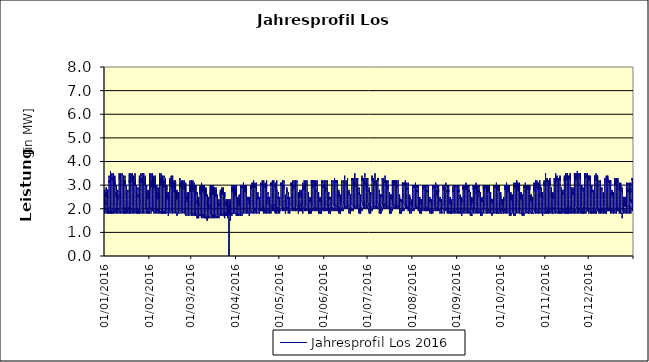
| Category | Jahresprofil Los 2016 |
|---|---|
| 01/01/2016 | 2.1 |
| 01/01/2016 | 2.1 |
| 01/01/2016 | 2 |
| 01/01/2016 | 1.8 |
| 01/01/2016 | 1.8 |
| 01/01/2016 | 1.9 |
| 01/01/2016 | 2 |
| 01/01/2016 | 2.1 |
| 01/01/2016 | 2.1 |
| 01/01/2016 | 2.2 |
| 01/01/2016 | 2.1 |
| 01/01/2016 | 2.4 |
| 01/01/2016 | 2.4 |
| 01/01/2016 | 2.2 |
| 01/01/2016 | 2.3 |
| 01/01/2016 | 2.2 |
| 01/01/2016 | 2.4 |
| 01/01/2016 | 2.8 |
| 01/01/2016 | 2.7 |
| 01/01/2016 | 2.7 |
| 01/01/2016 | 2.6 |
| 01/01/2016 | 2.4 |
| 01/01/2016 | 2.4 |
| 01/01/2016 | 2.3 |
| 02/01/2016 | 2 |
| 02/01/2016 | 1.9 |
| 02/01/2016 | 1.8 |
| 02/01/2016 | 1.8 |
| 02/01/2016 | 1.8 |
| 02/01/2016 | 1.8 |
| 02/01/2016 | 1.9 |
| 02/01/2016 | 2.1 |
| 02/01/2016 | 2.1 |
| 02/01/2016 | 2.4 |
| 02/01/2016 | 2.5 |
| 02/01/2016 | 2.7 |
| 02/01/2016 | 2.5 |
| 02/01/2016 | 2.6 |
| 02/01/2016 | 2.6 |
| 02/01/2016 | 2.5 |
| 02/01/2016 | 2.7 |
| 02/01/2016 | 2.9 |
| 02/01/2016 | 2.9 |
| 02/01/2016 | 2.8 |
| 02/01/2016 | 2.6 |
| 02/01/2016 | 2.4 |
| 02/01/2016 | 2.3 |
| 02/01/2016 | 2.1 |
| 03/01/2016 | 2 |
| 03/01/2016 | 1.9 |
| 03/01/2016 | 1.8 |
| 03/01/2016 | 1.8 |
| 03/01/2016 | 1.8 |
| 03/01/2016 | 1.8 |
| 03/01/2016 | 1.8 |
| 03/01/2016 | 2 |
| 03/01/2016 | 2.1 |
| 03/01/2016 | 2.3 |
| 03/01/2016 | 2.4 |
| 03/01/2016 | 2.5 |
| 03/01/2016 | 2.5 |
| 03/01/2016 | 2.5 |
| 03/01/2016 | 2.4 |
| 03/01/2016 | 2.6 |
| 03/01/2016 | 2.7 |
| 03/01/2016 | 2.8 |
| 03/01/2016 | 2.7 |
| 03/01/2016 | 2.8 |
| 03/01/2016 | 2.5 |
| 03/01/2016 | 2.4 |
| 03/01/2016 | 2.4 |
| 03/01/2016 | 2.1 |
| 04/01/2016 | 2.1 |
| 04/01/2016 | 1.8 |
| 04/01/2016 | 1.8 |
| 04/01/2016 | 1.9 |
| 04/01/2016 | 1.8 |
| 04/01/2016 | 2.1 |
| 04/01/2016 | 2.4 |
| 04/01/2016 | 2.7 |
| 04/01/2016 | 3 |
| 04/01/2016 | 3 |
| 04/01/2016 | 3.1 |
| 04/01/2016 | 3.2 |
| 04/01/2016 | 3.1 |
| 04/01/2016 | 3.2 |
| 04/01/2016 | 3.2 |
| 04/01/2016 | 3.2 |
| 04/01/2016 | 3.4 |
| 04/01/2016 | 3.4 |
| 04/01/2016 | 3.4 |
| 04/01/2016 | 3.3 |
| 04/01/2016 | 3 |
| 04/01/2016 | 2.6 |
| 04/01/2016 | 2.4 |
| 04/01/2016 | 2.2 |
| 05/01/2016 | 2.1 |
| 05/01/2016 | 2 |
| 05/01/2016 | 1.8 |
| 05/01/2016 | 1.8 |
| 05/01/2016 | 1.9 |
| 05/01/2016 | 2.1 |
| 05/01/2016 | 2.4 |
| 05/01/2016 | 2.7 |
| 05/01/2016 | 3 |
| 05/01/2016 | 3 |
| 05/01/2016 | 3.1 |
| 05/01/2016 | 3.1 |
| 05/01/2016 | 3.2 |
| 05/01/2016 | 3.1 |
| 05/01/2016 | 3.1 |
| 05/01/2016 | 3.2 |
| 05/01/2016 | 3.5 |
| 05/01/2016 | 3.6 |
| 05/01/2016 | 3.5 |
| 05/01/2016 | 3.3 |
| 05/01/2016 | 3 |
| 05/01/2016 | 2.7 |
| 05/01/2016 | 2.5 |
| 05/01/2016 | 2.3 |
| 06/01/2016 | 2.1 |
| 06/01/2016 | 1.8 |
| 06/01/2016 | 1.9 |
| 06/01/2016 | 1.8 |
| 06/01/2016 | 1.9 |
| 06/01/2016 | 2.1 |
| 06/01/2016 | 2.5 |
| 06/01/2016 | 2.8 |
| 06/01/2016 | 3 |
| 06/01/2016 | 3.2 |
| 06/01/2016 | 3.2 |
| 06/01/2016 | 3.2 |
| 06/01/2016 | 3.3 |
| 06/01/2016 | 3.2 |
| 06/01/2016 | 3.2 |
| 06/01/2016 | 3.3 |
| 06/01/2016 | 3.5 |
| 06/01/2016 | 3.5 |
| 06/01/2016 | 3.5 |
| 06/01/2016 | 3.3 |
| 06/01/2016 | 3 |
| 06/01/2016 | 2.7 |
| 06/01/2016 | 2.5 |
| 06/01/2016 | 2.3 |
| 07/01/2016 | 2 |
| 07/01/2016 | 1.9 |
| 07/01/2016 | 1.9 |
| 07/01/2016 | 1.8 |
| 07/01/2016 | 1.9 |
| 07/01/2016 | 2.1 |
| 07/01/2016 | 2.5 |
| 07/01/2016 | 2.8 |
| 07/01/2016 | 3 |
| 07/01/2016 | 3 |
| 07/01/2016 | 3.2 |
| 07/01/2016 | 3.2 |
| 07/01/2016 | 3.1 |
| 07/01/2016 | 3.1 |
| 07/01/2016 | 3.1 |
| 07/01/2016 | 3 |
| 07/01/2016 | 3.3 |
| 07/01/2016 | 3.5 |
| 07/01/2016 | 3.3 |
| 07/01/2016 | 3.2 |
| 07/01/2016 | 2.9 |
| 07/01/2016 | 2.7 |
| 07/01/2016 | 2.5 |
| 07/01/2016 | 2.1 |
| 08/01/2016 | 2 |
| 08/01/2016 | 1.9 |
| 08/01/2016 | 1.8 |
| 08/01/2016 | 1.8 |
| 08/01/2016 | 1.9 |
| 08/01/2016 | 2.1 |
| 08/01/2016 | 2.4 |
| 08/01/2016 | 2.7 |
| 08/01/2016 | 3 |
| 08/01/2016 | 3 |
| 08/01/2016 | 3.2 |
| 08/01/2016 | 3.2 |
| 08/01/2016 | 3.2 |
| 08/01/2016 | 3.2 |
| 08/01/2016 | 3 |
| 08/01/2016 | 3.1 |
| 08/01/2016 | 3.2 |
| 08/01/2016 | 3.4 |
| 08/01/2016 | 3.4 |
| 08/01/2016 | 3.2 |
| 08/01/2016 | 2.9 |
| 08/01/2016 | 2.6 |
| 08/01/2016 | 2.4 |
| 08/01/2016 | 2.2 |
| 09/01/2016 | 2.1 |
| 09/01/2016 | 1.8 |
| 09/01/2016 | 1.8 |
| 09/01/2016 | 1.8 |
| 09/01/2016 | 1.8 |
| 09/01/2016 | 1.8 |
| 09/01/2016 | 2 |
| 09/01/2016 | 2.1 |
| 09/01/2016 | 2.3 |
| 09/01/2016 | 2.5 |
| 09/01/2016 | 2.7 |
| 09/01/2016 | 2.6 |
| 09/01/2016 | 2.6 |
| 09/01/2016 | 2.7 |
| 09/01/2016 | 2.5 |
| 09/01/2016 | 2.7 |
| 09/01/2016 | 2.8 |
| 09/01/2016 | 3 |
| 09/01/2016 | 3 |
| 09/01/2016 | 2.8 |
| 09/01/2016 | 2.6 |
| 09/01/2016 | 2.4 |
| 09/01/2016 | 2.3 |
| 09/01/2016 | 2.1 |
| 10/01/2016 | 1.9 |
| 10/01/2016 | 2 |
| 10/01/2016 | 1.8 |
| 10/01/2016 | 1.8 |
| 10/01/2016 | 1.8 |
| 10/01/2016 | 1.8 |
| 10/01/2016 | 1.9 |
| 10/01/2016 | 1.9 |
| 10/01/2016 | 2.1 |
| 10/01/2016 | 2.2 |
| 10/01/2016 | 2.4 |
| 10/01/2016 | 2.6 |
| 10/01/2016 | 2.6 |
| 10/01/2016 | 2.6 |
| 10/01/2016 | 2.4 |
| 10/01/2016 | 2.6 |
| 10/01/2016 | 2.7 |
| 10/01/2016 | 2.8 |
| 10/01/2016 | 2.8 |
| 10/01/2016 | 2.7 |
| 10/01/2016 | 2.6 |
| 10/01/2016 | 2.4 |
| 10/01/2016 | 2.4 |
| 10/01/2016 | 2.1 |
| 11/01/2016 | 2 |
| 11/01/2016 | 2 |
| 11/01/2016 | 1.9 |
| 11/01/2016 | 1.8 |
| 11/01/2016 | 1.9 |
| 11/01/2016 | 2.1 |
| 11/01/2016 | 2.4 |
| 11/01/2016 | 2.9 |
| 11/01/2016 | 3 |
| 11/01/2016 | 3 |
| 11/01/2016 | 3.1 |
| 11/01/2016 | 3.1 |
| 11/01/2016 | 3.2 |
| 11/01/2016 | 3.2 |
| 11/01/2016 | 3.2 |
| 11/01/2016 | 3.2 |
| 11/01/2016 | 3.3 |
| 11/01/2016 | 3.4 |
| 11/01/2016 | 3.5 |
| 11/01/2016 | 3.2 |
| 11/01/2016 | 2.9 |
| 11/01/2016 | 2.7 |
| 11/01/2016 | 2.5 |
| 11/01/2016 | 2.3 |
| 12/01/2016 | 2 |
| 12/01/2016 | 1.9 |
| 12/01/2016 | 1.8 |
| 12/01/2016 | 1.9 |
| 12/01/2016 | 2 |
| 12/01/2016 | 2.1 |
| 12/01/2016 | 2.4 |
| 12/01/2016 | 2.9 |
| 12/01/2016 | 3 |
| 12/01/2016 | 3 |
| 12/01/2016 | 3.2 |
| 12/01/2016 | 3.2 |
| 12/01/2016 | 3.1 |
| 12/01/2016 | 3.2 |
| 12/01/2016 | 3.1 |
| 12/01/2016 | 3.2 |
| 12/01/2016 | 3.3 |
| 12/01/2016 | 3.5 |
| 12/01/2016 | 3.5 |
| 12/01/2016 | 3.4 |
| 12/01/2016 | 3 |
| 12/01/2016 | 2.7 |
| 12/01/2016 | 2.4 |
| 12/01/2016 | 2.1 |
| 13/01/2016 | 2.1 |
| 13/01/2016 | 2 |
| 13/01/2016 | 1.8 |
| 13/01/2016 | 1.9 |
| 13/01/2016 | 2 |
| 13/01/2016 | 2.1 |
| 13/01/2016 | 2.5 |
| 13/01/2016 | 2.8 |
| 13/01/2016 | 3 |
| 13/01/2016 | 3.2 |
| 13/01/2016 | 3.2 |
| 13/01/2016 | 3.2 |
| 13/01/2016 | 3.2 |
| 13/01/2016 | 3.2 |
| 13/01/2016 | 3.2 |
| 13/01/2016 | 3.2 |
| 13/01/2016 | 3.3 |
| 13/01/2016 | 3.5 |
| 13/01/2016 | 3.5 |
| 13/01/2016 | 3.4 |
| 13/01/2016 | 3 |
| 13/01/2016 | 2.7 |
| 13/01/2016 | 2.4 |
| 13/01/2016 | 2.2 |
| 14/01/2016 | 2.1 |
| 14/01/2016 | 2 |
| 14/01/2016 | 1.8 |
| 14/01/2016 | 1.9 |
| 14/01/2016 | 2 |
| 14/01/2016 | 2.1 |
| 14/01/2016 | 2.5 |
| 14/01/2016 | 2.8 |
| 14/01/2016 | 3 |
| 14/01/2016 | 3.1 |
| 14/01/2016 | 3.1 |
| 14/01/2016 | 3.2 |
| 14/01/2016 | 3.2 |
| 14/01/2016 | 3.2 |
| 14/01/2016 | 3.1 |
| 14/01/2016 | 3 |
| 14/01/2016 | 3.2 |
| 14/01/2016 | 3.4 |
| 14/01/2016 | 3.4 |
| 14/01/2016 | 3.3 |
| 14/01/2016 | 3 |
| 14/01/2016 | 2.6 |
| 14/01/2016 | 2.4 |
| 14/01/2016 | 2.2 |
| 15/01/2016 | 2.1 |
| 15/01/2016 | 2 |
| 15/01/2016 | 1.8 |
| 15/01/2016 | 1.9 |
| 15/01/2016 | 1.8 |
| 15/01/2016 | 2.1 |
| 15/01/2016 | 2.4 |
| 15/01/2016 | 2.7 |
| 15/01/2016 | 3 |
| 15/01/2016 | 3.2 |
| 15/01/2016 | 3.2 |
| 15/01/2016 | 3.2 |
| 15/01/2016 | 3.1 |
| 15/01/2016 | 3.2 |
| 15/01/2016 | 3 |
| 15/01/2016 | 3.1 |
| 15/01/2016 | 3.2 |
| 15/01/2016 | 3.4 |
| 15/01/2016 | 3.3 |
| 15/01/2016 | 3.2 |
| 15/01/2016 | 2.8 |
| 15/01/2016 | 2.7 |
| 15/01/2016 | 2.4 |
| 15/01/2016 | 2.1 |
| 16/01/2016 | 2 |
| 16/01/2016 | 1.9 |
| 16/01/2016 | 1.8 |
| 16/01/2016 | 1.8 |
| 16/01/2016 | 1.8 |
| 16/01/2016 | 2 |
| 16/01/2016 | 2.1 |
| 16/01/2016 | 2.2 |
| 16/01/2016 | 2.4 |
| 16/01/2016 | 2.4 |
| 16/01/2016 | 2.6 |
| 16/01/2016 | 2.7 |
| 16/01/2016 | 2.7 |
| 16/01/2016 | 2.6 |
| 16/01/2016 | 2.6 |
| 16/01/2016 | 2.6 |
| 16/01/2016 | 2.7 |
| 16/01/2016 | 2.9 |
| 16/01/2016 | 3 |
| 16/01/2016 | 2.9 |
| 16/01/2016 | 2.7 |
| 16/01/2016 | 2.5 |
| 16/01/2016 | 2.4 |
| 16/01/2016 | 2.2 |
| 17/01/2016 | 2 |
| 17/01/2016 | 1.9 |
| 17/01/2016 | 1.8 |
| 17/01/2016 | 1.8 |
| 17/01/2016 | 1.8 |
| 17/01/2016 | 1.8 |
| 17/01/2016 | 1.8 |
| 17/01/2016 | 2.1 |
| 17/01/2016 | 2.1 |
| 17/01/2016 | 2.4 |
| 17/01/2016 | 2.4 |
| 17/01/2016 | 2.5 |
| 17/01/2016 | 2.5 |
| 17/01/2016 | 2.5 |
| 17/01/2016 | 2.5 |
| 17/01/2016 | 2.5 |
| 17/01/2016 | 2.6 |
| 17/01/2016 | 2.8 |
| 17/01/2016 | 2.8 |
| 17/01/2016 | 2.7 |
| 17/01/2016 | 2.6 |
| 17/01/2016 | 2.4 |
| 17/01/2016 | 2.3 |
| 17/01/2016 | 2.2 |
| 18/01/2016 | 2.1 |
| 18/01/2016 | 1.9 |
| 18/01/2016 | 1.8 |
| 18/01/2016 | 1.9 |
| 18/01/2016 | 1.8 |
| 18/01/2016 | 2.1 |
| 18/01/2016 | 2.4 |
| 18/01/2016 | 2.9 |
| 18/01/2016 | 3.1 |
| 18/01/2016 | 3.2 |
| 18/01/2016 | 3.2 |
| 18/01/2016 | 3.2 |
| 18/01/2016 | 3.2 |
| 18/01/2016 | 3.1 |
| 18/01/2016 | 3.1 |
| 18/01/2016 | 3.1 |
| 18/01/2016 | 3.3 |
| 18/01/2016 | 3.4 |
| 18/01/2016 | 3.5 |
| 18/01/2016 | 3.3 |
| 18/01/2016 | 3 |
| 18/01/2016 | 2.7 |
| 18/01/2016 | 2.4 |
| 18/01/2016 | 2.2 |
| 19/01/2016 | 2.1 |
| 19/01/2016 | 2 |
| 19/01/2016 | 1.8 |
| 19/01/2016 | 1.8 |
| 19/01/2016 | 1.9 |
| 19/01/2016 | 2.1 |
| 19/01/2016 | 2.6 |
| 19/01/2016 | 2.9 |
| 19/01/2016 | 3.1 |
| 19/01/2016 | 3.2 |
| 19/01/2016 | 3.2 |
| 19/01/2016 | 3.2 |
| 19/01/2016 | 3.2 |
| 19/01/2016 | 3.2 |
| 19/01/2016 | 3.1 |
| 19/01/2016 | 3.2 |
| 19/01/2016 | 3.3 |
| 19/01/2016 | 3.5 |
| 19/01/2016 | 3.5 |
| 19/01/2016 | 3.5 |
| 19/01/2016 | 3.1 |
| 19/01/2016 | 2.7 |
| 19/01/2016 | 2.4 |
| 19/01/2016 | 2.2 |
| 20/01/2016 | 2 |
| 20/01/2016 | 1.9 |
| 20/01/2016 | 1.9 |
| 20/01/2016 | 1.8 |
| 20/01/2016 | 1.9 |
| 20/01/2016 | 2.1 |
| 20/01/2016 | 2.5 |
| 20/01/2016 | 3 |
| 20/01/2016 | 3.2 |
| 20/01/2016 | 3.2 |
| 20/01/2016 | 3.3 |
| 20/01/2016 | 3.3 |
| 20/01/2016 | 3.3 |
| 20/01/2016 | 3.2 |
| 20/01/2016 | 3.2 |
| 20/01/2016 | 3.2 |
| 20/01/2016 | 3.2 |
| 20/01/2016 | 3.5 |
| 20/01/2016 | 3.5 |
| 20/01/2016 | 3.3 |
| 20/01/2016 | 3.1 |
| 20/01/2016 | 2.7 |
| 20/01/2016 | 2.5 |
| 20/01/2016 | 2.3 |
| 21/01/2016 | 2 |
| 21/01/2016 | 1.9 |
| 21/01/2016 | 1.9 |
| 21/01/2016 | 1.8 |
| 21/01/2016 | 1.9 |
| 21/01/2016 | 2.1 |
| 21/01/2016 | 2.5 |
| 21/01/2016 | 3 |
| 21/01/2016 | 3 |
| 21/01/2016 | 3.1 |
| 21/01/2016 | 3.2 |
| 21/01/2016 | 3.2 |
| 21/01/2016 | 3.2 |
| 21/01/2016 | 3.1 |
| 21/01/2016 | 3 |
| 21/01/2016 | 3 |
| 21/01/2016 | 3.2 |
| 21/01/2016 | 3.4 |
| 21/01/2016 | 3.4 |
| 21/01/2016 | 3.2 |
| 21/01/2016 | 2.9 |
| 21/01/2016 | 2.7 |
| 21/01/2016 | 2.5 |
| 21/01/2016 | 2.1 |
| 22/01/2016 | 2 |
| 22/01/2016 | 1.9 |
| 22/01/2016 | 1.8 |
| 22/01/2016 | 1.8 |
| 22/01/2016 | 1.9 |
| 22/01/2016 | 2.1 |
| 22/01/2016 | 2.4 |
| 22/01/2016 | 2.9 |
| 22/01/2016 | 3 |
| 22/01/2016 | 3.2 |
| 22/01/2016 | 3.2 |
| 22/01/2016 | 3.2 |
| 22/01/2016 | 3.2 |
| 22/01/2016 | 3.1 |
| 22/01/2016 | 3.1 |
| 22/01/2016 | 3 |
| 22/01/2016 | 3.2 |
| 22/01/2016 | 3.4 |
| 22/01/2016 | 3.5 |
| 22/01/2016 | 3.2 |
| 22/01/2016 | 2.9 |
| 22/01/2016 | 2.6 |
| 22/01/2016 | 2.4 |
| 22/01/2016 | 2.2 |
| 23/01/2016 | 1.9 |
| 23/01/2016 | 1.9 |
| 23/01/2016 | 1.9 |
| 23/01/2016 | 1.8 |
| 23/01/2016 | 1.9 |
| 23/01/2016 | 1.9 |
| 23/01/2016 | 2.1 |
| 23/01/2016 | 2.1 |
| 23/01/2016 | 2.4 |
| 23/01/2016 | 2.6 |
| 23/01/2016 | 2.7 |
| 23/01/2016 | 2.8 |
| 23/01/2016 | 2.7 |
| 23/01/2016 | 2.6 |
| 23/01/2016 | 2.6 |
| 23/01/2016 | 2.6 |
| 23/01/2016 | 2.7 |
| 23/01/2016 | 2.9 |
| 23/01/2016 | 3 |
| 23/01/2016 | 3 |
| 23/01/2016 | 2.7 |
| 23/01/2016 | 2.4 |
| 23/01/2016 | 2.3 |
| 23/01/2016 | 2.1 |
| 24/01/2016 | 1.9 |
| 24/01/2016 | 2 |
| 24/01/2016 | 1.8 |
| 24/01/2016 | 1.9 |
| 24/01/2016 | 1.8 |
| 24/01/2016 | 1.8 |
| 24/01/2016 | 2 |
| 24/01/2016 | 2 |
| 24/01/2016 | 2.3 |
| 24/01/2016 | 2.3 |
| 24/01/2016 | 2.5 |
| 24/01/2016 | 2.6 |
| 24/01/2016 | 2.6 |
| 24/01/2016 | 2.5 |
| 24/01/2016 | 2.5 |
| 24/01/2016 | 2.5 |
| 24/01/2016 | 2.6 |
| 24/01/2016 | 2.8 |
| 24/01/2016 | 2.9 |
| 24/01/2016 | 2.8 |
| 24/01/2016 | 2.5 |
| 24/01/2016 | 2.4 |
| 24/01/2016 | 2.4 |
| 24/01/2016 | 2.1 |
| 25/01/2016 | 2 |
| 25/01/2016 | 1.8 |
| 25/01/2016 | 1.9 |
| 25/01/2016 | 1.8 |
| 25/01/2016 | 1.9 |
| 25/01/2016 | 2.1 |
| 25/01/2016 | 2.6 |
| 25/01/2016 | 2.9 |
| 25/01/2016 | 3.1 |
| 25/01/2016 | 3.2 |
| 25/01/2016 | 3.2 |
| 25/01/2016 | 3.2 |
| 25/01/2016 | 3.2 |
| 25/01/2016 | 3.2 |
| 25/01/2016 | 3.1 |
| 25/01/2016 | 3.1 |
| 25/01/2016 | 3.2 |
| 25/01/2016 | 3.3 |
| 25/01/2016 | 3.4 |
| 25/01/2016 | 3.4 |
| 25/01/2016 | 3 |
| 25/01/2016 | 2.7 |
| 25/01/2016 | 2.4 |
| 25/01/2016 | 2.2 |
| 26/01/2016 | 2 |
| 26/01/2016 | 1.9 |
| 26/01/2016 | 1.8 |
| 26/01/2016 | 1.9 |
| 26/01/2016 | 2 |
| 26/01/2016 | 2.2 |
| 26/01/2016 | 2.6 |
| 26/01/2016 | 2.9 |
| 26/01/2016 | 3.1 |
| 26/01/2016 | 3.2 |
| 26/01/2016 | 3.3 |
| 26/01/2016 | 3.3 |
| 26/01/2016 | 3.2 |
| 26/01/2016 | 3.1 |
| 26/01/2016 | 3.2 |
| 26/01/2016 | 3.2 |
| 26/01/2016 | 3.2 |
| 26/01/2016 | 3.5 |
| 26/01/2016 | 3.5 |
| 26/01/2016 | 3.4 |
| 26/01/2016 | 3 |
| 26/01/2016 | 2.7 |
| 26/01/2016 | 2.5 |
| 26/01/2016 | 2.1 |
| 27/01/2016 | 2.1 |
| 27/01/2016 | 2 |
| 27/01/2016 | 1.8 |
| 27/01/2016 | 1.9 |
| 27/01/2016 | 2 |
| 27/01/2016 | 2.1 |
| 27/01/2016 | 2.7 |
| 27/01/2016 | 3 |
| 27/01/2016 | 3.2 |
| 27/01/2016 | 3.3 |
| 27/01/2016 | 3.2 |
| 27/01/2016 | 3.2 |
| 27/01/2016 | 3.2 |
| 27/01/2016 | 3.2 |
| 27/01/2016 | 3.1 |
| 27/01/2016 | 3.2 |
| 27/01/2016 | 3.2 |
| 27/01/2016 | 3.5 |
| 27/01/2016 | 3.5 |
| 27/01/2016 | 3.4 |
| 27/01/2016 | 3 |
| 27/01/2016 | 2.7 |
| 27/01/2016 | 2.4 |
| 27/01/2016 | 2.2 |
| 28/01/2016 | 2.1 |
| 28/01/2016 | 2 |
| 28/01/2016 | 1.8 |
| 28/01/2016 | 1.9 |
| 28/01/2016 | 2 |
| 28/01/2016 | 2.1 |
| 28/01/2016 | 2.7 |
| 28/01/2016 | 3 |
| 28/01/2016 | 3.2 |
| 28/01/2016 | 3.2 |
| 28/01/2016 | 3.2 |
| 28/01/2016 | 3.2 |
| 28/01/2016 | 3.2 |
| 28/01/2016 | 3.1 |
| 28/01/2016 | 3 |
| 28/01/2016 | 3 |
| 28/01/2016 | 3.1 |
| 28/01/2016 | 3.4 |
| 28/01/2016 | 3.5 |
| 28/01/2016 | 3.3 |
| 28/01/2016 | 3 |
| 28/01/2016 | 2.7 |
| 28/01/2016 | 2.4 |
| 28/01/2016 | 2.2 |
| 29/01/2016 | 1.9 |
| 29/01/2016 | 1.8 |
| 29/01/2016 | 1.8 |
| 29/01/2016 | 1.9 |
| 29/01/2016 | 2 |
| 29/01/2016 | 2.1 |
| 29/01/2016 | 2.6 |
| 29/01/2016 | 2.9 |
| 29/01/2016 | 3.2 |
| 29/01/2016 | 3.3 |
| 29/01/2016 | 3.2 |
| 29/01/2016 | 3.2 |
| 29/01/2016 | 3.2 |
| 29/01/2016 | 3.2 |
| 29/01/2016 | 3.1 |
| 29/01/2016 | 3 |
| 29/01/2016 | 3.1 |
| 29/01/2016 | 3.3 |
| 29/01/2016 | 3.4 |
| 29/01/2016 | 3.2 |
| 29/01/2016 | 2.8 |
| 29/01/2016 | 2.7 |
| 29/01/2016 | 2.4 |
| 29/01/2016 | 2.3 |
| 30/01/2016 | 2 |
| 30/01/2016 | 2 |
| 30/01/2016 | 1.8 |
| 30/01/2016 | 1.8 |
| 30/01/2016 | 1.8 |
| 30/01/2016 | 2 |
| 30/01/2016 | 2 |
| 30/01/2016 | 2.3 |
| 30/01/2016 | 2.5 |
| 30/01/2016 | 2.6 |
| 30/01/2016 | 2.8 |
| 30/01/2016 | 2.7 |
| 30/01/2016 | 2.7 |
| 30/01/2016 | 2.7 |
| 30/01/2016 | 2.6 |
| 30/01/2016 | 2.6 |
| 30/01/2016 | 2.7 |
| 30/01/2016 | 2.9 |
| 30/01/2016 | 3 |
| 30/01/2016 | 2.9 |
| 30/01/2016 | 2.7 |
| 30/01/2016 | 2.4 |
| 30/01/2016 | 2.4 |
| 30/01/2016 | 2.1 |
| 31/01/2016 | 2.1 |
| 31/01/2016 | 1.9 |
| 31/01/2016 | 1.8 |
| 31/01/2016 | 1.8 |
| 31/01/2016 | 1.9 |
| 31/01/2016 | 1.8 |
| 31/01/2016 | 1.9 |
| 31/01/2016 | 2.1 |
| 31/01/2016 | 2.2 |
| 31/01/2016 | 2.4 |
| 31/01/2016 | 2.6 |
| 31/01/2016 | 2.7 |
| 31/01/2016 | 2.7 |
| 31/01/2016 | 2.6 |
| 31/01/2016 | 2.5 |
| 31/01/2016 | 2.5 |
| 31/01/2016 | 2.4 |
| 31/01/2016 | 2.7 |
| 31/01/2016 | 2.8 |
| 31/01/2016 | 2.7 |
| 31/01/2016 | 2.6 |
| 31/01/2016 | 2.4 |
| 31/01/2016 | 2.3 |
| 31/01/2016 | 2.2 |
| 01/02/2016 | 2.1 |
| 01/02/2016 | 1.9 |
| 01/02/2016 | 1.8 |
| 01/02/2016 | 1.8 |
| 01/02/2016 | 2 |
| 01/02/2016 | 2.1 |
| 01/02/2016 | 2.5 |
| 01/02/2016 | 2.9 |
| 01/02/2016 | 3.2 |
| 01/02/2016 | 3.2 |
| 01/02/2016 | 3.2 |
| 01/02/2016 | 3.2 |
| 01/02/2016 | 3.2 |
| 01/02/2016 | 3 |
| 01/02/2016 | 3 |
| 01/02/2016 | 2.9 |
| 01/02/2016 | 3 |
| 01/02/2016 | 3.3 |
| 01/02/2016 | 3.5 |
| 01/02/2016 | 3.2 |
| 01/02/2016 | 2.8 |
| 01/02/2016 | 2.5 |
| 01/02/2016 | 2.4 |
| 01/02/2016 | 2.1 |
| 02/02/2016 | 2.1 |
| 02/02/2016 | 2 |
| 02/02/2016 | 1.8 |
| 02/02/2016 | 1.9 |
| 02/02/2016 | 2 |
| 02/02/2016 | 2.2 |
| 02/02/2016 | 2.5 |
| 02/02/2016 | 2.9 |
| 02/02/2016 | 3.2 |
| 02/02/2016 | 3.2 |
| 02/02/2016 | 3.2 |
| 02/02/2016 | 3.2 |
| 02/02/2016 | 3.2 |
| 02/02/2016 | 3 |
| 02/02/2016 | 2.9 |
| 02/02/2016 | 3 |
| 02/02/2016 | 3.1 |
| 02/02/2016 | 3.3 |
| 02/02/2016 | 3.5 |
| 02/02/2016 | 3.2 |
| 02/02/2016 | 2.9 |
| 02/02/2016 | 2.6 |
| 02/02/2016 | 2.5 |
| 02/02/2016 | 2.2 |
| 03/02/2016 | 2 |
| 03/02/2016 | 1.9 |
| 03/02/2016 | 1.9 |
| 03/02/2016 | 2 |
| 03/02/2016 | 1.9 |
| 03/02/2016 | 2.1 |
| 03/02/2016 | 2.6 |
| 03/02/2016 | 3 |
| 03/02/2016 | 3.1 |
| 03/02/2016 | 3.4 |
| 03/02/2016 | 3.4 |
| 03/02/2016 | 3.3 |
| 03/02/2016 | 3.2 |
| 03/02/2016 | 3.2 |
| 03/02/2016 | 3 |
| 03/02/2016 | 3 |
| 03/02/2016 | 3.1 |
| 03/02/2016 | 3.3 |
| 03/02/2016 | 3.5 |
| 03/02/2016 | 3.3 |
| 03/02/2016 | 2.9 |
| 03/02/2016 | 2.6 |
| 03/02/2016 | 2.4 |
| 03/02/2016 | 2.2 |
| 04/02/2016 | 2 |
| 04/02/2016 | 1.9 |
| 04/02/2016 | 1.9 |
| 04/02/2016 | 1.8 |
| 04/02/2016 | 1.9 |
| 04/02/2016 | 2.1 |
| 04/02/2016 | 2.6 |
| 04/02/2016 | 3 |
| 04/02/2016 | 3.1 |
| 04/02/2016 | 3.3 |
| 04/02/2016 | 3.3 |
| 04/02/2016 | 3.3 |
| 04/02/2016 | 3.2 |
| 04/02/2016 | 3 |
| 04/02/2016 | 2.9 |
| 04/02/2016 | 3 |
| 04/02/2016 | 3 |
| 04/02/2016 | 3.2 |
| 04/02/2016 | 3.4 |
| 04/02/2016 | 3 |
| 04/02/2016 | 2.9 |
| 04/02/2016 | 2.6 |
| 04/02/2016 | 2.4 |
| 04/02/2016 | 2.2 |
| 05/02/2016 | 2 |
| 05/02/2016 | 1.9 |
| 05/02/2016 | 1.9 |
| 05/02/2016 | 1.8 |
| 05/02/2016 | 1.9 |
| 05/02/2016 | 2.1 |
| 05/02/2016 | 2.5 |
| 05/02/2016 | 2.9 |
| 05/02/2016 | 3.1 |
| 05/02/2016 | 3.3 |
| 05/02/2016 | 3.3 |
| 05/02/2016 | 3.3 |
| 05/02/2016 | 3.2 |
| 05/02/2016 | 3 |
| 05/02/2016 | 2.9 |
| 05/02/2016 | 2.8 |
| 05/02/2016 | 3 |
| 05/02/2016 | 3.2 |
| 05/02/2016 | 3.4 |
| 05/02/2016 | 3 |
| 05/02/2016 | 2.7 |
| 05/02/2016 | 2.5 |
| 05/02/2016 | 2.4 |
| 05/02/2016 | 2.1 |
| 06/02/2016 | 1.9 |
| 06/02/2016 | 1.9 |
| 06/02/2016 | 1.9 |
| 06/02/2016 | 1.9 |
| 06/02/2016 | 1.8 |
| 06/02/2016 | 2 |
| 06/02/2016 | 2 |
| 06/02/2016 | 2.2 |
| 06/02/2016 | 2.4 |
| 06/02/2016 | 2.7 |
| 06/02/2016 | 2.7 |
| 06/02/2016 | 2.8 |
| 06/02/2016 | 2.7 |
| 06/02/2016 | 2.5 |
| 06/02/2016 | 2.4 |
| 06/02/2016 | 2.4 |
| 06/02/2016 | 2.5 |
| 06/02/2016 | 2.7 |
| 06/02/2016 | 3 |
| 06/02/2016 | 2.8 |
| 06/02/2016 | 2.6 |
| 06/02/2016 | 2.4 |
| 06/02/2016 | 2.3 |
| 06/02/2016 | 2 |
| 07/02/2016 | 1.9 |
| 07/02/2016 | 2 |
| 07/02/2016 | 1.8 |
| 07/02/2016 | 1.8 |
| 07/02/2016 | 1.8 |
| 07/02/2016 | 1.9 |
| 07/02/2016 | 2 |
| 07/02/2016 | 2.2 |
| 07/02/2016 | 2.3 |
| 07/02/2016 | 2.5 |
| 07/02/2016 | 2.5 |
| 07/02/2016 | 2.6 |
| 07/02/2016 | 2.7 |
| 07/02/2016 | 2.6 |
| 07/02/2016 | 2.5 |
| 07/02/2016 | 2.4 |
| 07/02/2016 | 2.4 |
| 07/02/2016 | 2.7 |
| 07/02/2016 | 2.9 |
| 07/02/2016 | 2.8 |
| 07/02/2016 | 2.7 |
| 07/02/2016 | 2.4 |
| 07/02/2016 | 2.4 |
| 07/02/2016 | 2.1 |
| 08/02/2016 | 1.9 |
| 08/02/2016 | 1.9 |
| 08/02/2016 | 1.8 |
| 08/02/2016 | 1.8 |
| 08/02/2016 | 1.9 |
| 08/02/2016 | 2.2 |
| 08/02/2016 | 2.7 |
| 08/02/2016 | 3 |
| 08/02/2016 | 3.2 |
| 08/02/2016 | 3.2 |
| 08/02/2016 | 3.3 |
| 08/02/2016 | 3.3 |
| 08/02/2016 | 3.2 |
| 08/02/2016 | 3.1 |
| 08/02/2016 | 3.1 |
| 08/02/2016 | 3.2 |
| 08/02/2016 | 3 |
| 08/02/2016 | 3.3 |
| 08/02/2016 | 3.5 |
| 08/02/2016 | 3.3 |
| 08/02/2016 | 3 |
| 08/02/2016 | 2.6 |
| 08/02/2016 | 2.4 |
| 08/02/2016 | 2.2 |
| 09/02/2016 | 1.9 |
| 09/02/2016 | 1.8 |
| 09/02/2016 | 1.9 |
| 09/02/2016 | 1.8 |
| 09/02/2016 | 1.9 |
| 09/02/2016 | 2.2 |
| 09/02/2016 | 2.6 |
| 09/02/2016 | 3.1 |
| 09/02/2016 | 3.3 |
| 09/02/2016 | 3.2 |
| 09/02/2016 | 3.2 |
| 09/02/2016 | 3.2 |
| 09/02/2016 | 3.2 |
| 09/02/2016 | 3.1 |
| 09/02/2016 | 3.1 |
| 09/02/2016 | 3 |
| 09/02/2016 | 3.2 |
| 09/02/2016 | 3.5 |
| 09/02/2016 | 3.5 |
| 09/02/2016 | 3.5 |
| 09/02/2016 | 3 |
| 09/02/2016 | 2.7 |
| 09/02/2016 | 2.4 |
| 09/02/2016 | 2.2 |
| 10/02/2016 | 2 |
| 10/02/2016 | 1.8 |
| 10/02/2016 | 1.9 |
| 10/02/2016 | 1.8 |
| 10/02/2016 | 1.9 |
| 10/02/2016 | 2.2 |
| 10/02/2016 | 2.7 |
| 10/02/2016 | 3 |
| 10/02/2016 | 3.2 |
| 10/02/2016 | 3.3 |
| 10/02/2016 | 3.3 |
| 10/02/2016 | 3.3 |
| 10/02/2016 | 3.2 |
| 10/02/2016 | 3.2 |
| 10/02/2016 | 3.2 |
| 10/02/2016 | 3 |
| 10/02/2016 | 3.1 |
| 10/02/2016 | 3.3 |
| 10/02/2016 | 3.4 |
| 10/02/2016 | 3.4 |
| 10/02/2016 | 3 |
| 10/02/2016 | 2.6 |
| 10/02/2016 | 2.4 |
| 10/02/2016 | 2.2 |
| 11/02/2016 | 1.9 |
| 11/02/2016 | 1.8 |
| 11/02/2016 | 1.9 |
| 11/02/2016 | 1.8 |
| 11/02/2016 | 1.9 |
| 11/02/2016 | 2.1 |
| 11/02/2016 | 2.6 |
| 11/02/2016 | 3 |
| 11/02/2016 | 3.2 |
| 11/02/2016 | 3.2 |
| 11/02/2016 | 3.2 |
| 11/02/2016 | 3.2 |
| 11/02/2016 | 3.1 |
| 11/02/2016 | 3 |
| 11/02/2016 | 3 |
| 11/02/2016 | 2.9 |
| 11/02/2016 | 3 |
| 11/02/2016 | 3.2 |
| 11/02/2016 | 3.4 |
| 11/02/2016 | 3.3 |
| 11/02/2016 | 3 |
| 11/02/2016 | 2.6 |
| 11/02/2016 | 2.4 |
| 11/02/2016 | 2.1 |
| 12/02/2016 | 1.9 |
| 12/02/2016 | 1.8 |
| 12/02/2016 | 1.9 |
| 12/02/2016 | 1.8 |
| 12/02/2016 | 1.9 |
| 12/02/2016 | 2.1 |
| 12/02/2016 | 2.5 |
| 12/02/2016 | 2.9 |
| 12/02/2016 | 3.2 |
| 12/02/2016 | 3.3 |
| 12/02/2016 | 3.2 |
| 12/02/2016 | 3.2 |
| 12/02/2016 | 3.2 |
| 12/02/2016 | 3 |
| 12/02/2016 | 3 |
| 12/02/2016 | 3 |
| 12/02/2016 | 3 |
| 12/02/2016 | 3.2 |
| 12/02/2016 | 3.2 |
| 12/02/2016 | 3.1 |
| 12/02/2016 | 2.8 |
| 12/02/2016 | 2.6 |
| 12/02/2016 | 2.4 |
| 12/02/2016 | 2.2 |
| 13/02/2016 | 1.9 |
| 13/02/2016 | 1.8 |
| 13/02/2016 | 1.8 |
| 13/02/2016 | 1.8 |
| 13/02/2016 | 1.8 |
| 13/02/2016 | 1.8 |
| 13/02/2016 | 2 |
| 13/02/2016 | 2.2 |
| 13/02/2016 | 2.4 |
| 13/02/2016 | 2.7 |
| 13/02/2016 | 2.7 |
| 13/02/2016 | 2.7 |
| 13/02/2016 | 2.7 |
| 13/02/2016 | 2.5 |
| 13/02/2016 | 2.4 |
| 13/02/2016 | 2.4 |
| 13/02/2016 | 2.5 |
| 13/02/2016 | 2.7 |
| 13/02/2016 | 3 |
| 13/02/2016 | 2.8 |
| 13/02/2016 | 2.6 |
| 13/02/2016 | 2.4 |
| 13/02/2016 | 2.2 |
| 13/02/2016 | 2.1 |
| 14/02/2016 | 1.9 |
| 14/02/2016 | 1.8 |
| 14/02/2016 | 1.8 |
| 14/02/2016 | 1.8 |
| 14/02/2016 | 1.7 |
| 14/02/2016 | 1.8 |
| 14/02/2016 | 1.9 |
| 14/02/2016 | 2 |
| 14/02/2016 | 2.1 |
| 14/02/2016 | 2.4 |
| 14/02/2016 | 2.4 |
| 14/02/2016 | 2.5 |
| 14/02/2016 | 2.4 |
| 14/02/2016 | 2.4 |
| 14/02/2016 | 2.4 |
| 14/02/2016 | 2.4 |
| 14/02/2016 | 2.4 |
| 14/02/2016 | 2.6 |
| 14/02/2016 | 2.7 |
| 14/02/2016 | 2.7 |
| 14/02/2016 | 2.5 |
| 14/02/2016 | 2.4 |
| 14/02/2016 | 2.3 |
| 14/02/2016 | 2.1 |
| 15/02/2016 | 1.9 |
| 15/02/2016 | 1.8 |
| 15/02/2016 | 1.8 |
| 15/02/2016 | 1.8 |
| 15/02/2016 | 1.9 |
| 15/02/2016 | 2.1 |
| 15/02/2016 | 2.5 |
| 15/02/2016 | 2.9 |
| 15/02/2016 | 3.1 |
| 15/02/2016 | 3.2 |
| 15/02/2016 | 3.2 |
| 15/02/2016 | 3.2 |
| 15/02/2016 | 3.1 |
| 15/02/2016 | 3.1 |
| 15/02/2016 | 3 |
| 15/02/2016 | 3 |
| 15/02/2016 | 3 |
| 15/02/2016 | 3.1 |
| 15/02/2016 | 3.3 |
| 15/02/2016 | 3.2 |
| 15/02/2016 | 3 |
| 15/02/2016 | 2.6 |
| 15/02/2016 | 2.4 |
| 15/02/2016 | 2.1 |
| 16/02/2016 | 1.9 |
| 16/02/2016 | 1.8 |
| 16/02/2016 | 1.8 |
| 16/02/2016 | 1.8 |
| 16/02/2016 | 2 |
| 16/02/2016 | 2.1 |
| 16/02/2016 | 2.6 |
| 16/02/2016 | 3 |
| 16/02/2016 | 3 |
| 16/02/2016 | 3.1 |
| 16/02/2016 | 3.2 |
| 16/02/2016 | 3.1 |
| 16/02/2016 | 3 |
| 16/02/2016 | 3 |
| 16/02/2016 | 3 |
| 16/02/2016 | 2.9 |
| 16/02/2016 | 3 |
| 16/02/2016 | 3.2 |
| 16/02/2016 | 3.4 |
| 16/02/2016 | 3.2 |
| 16/02/2016 | 2.9 |
| 16/02/2016 | 2.7 |
| 16/02/2016 | 2.4 |
| 16/02/2016 | 2 |
| 17/02/2016 | 1.9 |
| 17/02/2016 | 1.9 |
| 17/02/2016 | 1.8 |
| 17/02/2016 | 1.9 |
| 17/02/2016 | 2 |
| 17/02/2016 | 2.1 |
| 17/02/2016 | 2.6 |
| 17/02/2016 | 2.9 |
| 17/02/2016 | 3.1 |
| 17/02/2016 | 3.2 |
| 17/02/2016 | 3.2 |
| 17/02/2016 | 3.2 |
| 17/02/2016 | 3.1 |
| 17/02/2016 | 3 |
| 17/02/2016 | 3.1 |
| 17/02/2016 | 2.9 |
| 17/02/2016 | 3 |
| 17/02/2016 | 3.1 |
| 17/02/2016 | 3.4 |
| 17/02/2016 | 3.2 |
| 17/02/2016 | 2.9 |
| 17/02/2016 | 2.6 |
| 17/02/2016 | 2.4 |
| 17/02/2016 | 2 |
| 18/02/2016 | 1.9 |
| 18/02/2016 | 1.8 |
| 18/02/2016 | 1.8 |
| 18/02/2016 | 1.8 |
| 18/02/2016 | 2 |
| 18/02/2016 | 2.1 |
| 18/02/2016 | 2.6 |
| 18/02/2016 | 3 |
| 18/02/2016 | 3 |
| 18/02/2016 | 3.1 |
| 18/02/2016 | 3.1 |
| 18/02/2016 | 3 |
| 18/02/2016 | 3 |
| 18/02/2016 | 3 |
| 18/02/2016 | 3 |
| 18/02/2016 | 2.7 |
| 18/02/2016 | 2.8 |
| 18/02/2016 | 3.1 |
| 18/02/2016 | 3.2 |
| 18/02/2016 | 3.1 |
| 18/02/2016 | 2.8 |
| 18/02/2016 | 2.5 |
| 18/02/2016 | 2.4 |
| 18/02/2016 | 2 |
| 19/02/2016 | 1.9 |
| 19/02/2016 | 1.8 |
| 19/02/2016 | 1.8 |
| 19/02/2016 | 1.8 |
| 19/02/2016 | 1.9 |
| 19/02/2016 | 2 |
| 19/02/2016 | 2.4 |
| 19/02/2016 | 2.8 |
| 19/02/2016 | 3.1 |
| 19/02/2016 | 3 |
| 19/02/2016 | 3.1 |
| 19/02/2016 | 3.2 |
| 19/02/2016 | 3 |
| 19/02/2016 | 2.9 |
| 19/02/2016 | 2.8 |
| 19/02/2016 | 2.8 |
| 19/02/2016 | 2.8 |
| 19/02/2016 | 3 |
| 19/02/2016 | 3.2 |
| 19/02/2016 | 3.1 |
| 19/02/2016 | 2.8 |
| 19/02/2016 | 2.4 |
| 19/02/2016 | 2.2 |
| 19/02/2016 | 2 |
| 20/02/2016 | 1.9 |
| 20/02/2016 | 1.8 |
| 20/02/2016 | 1.7 |
| 20/02/2016 | 1.7 |
| 20/02/2016 | 1.8 |
| 20/02/2016 | 1.9 |
| 20/02/2016 | 2 |
| 20/02/2016 | 2.2 |
| 20/02/2016 | 2.3 |
| 20/02/2016 | 2.4 |
| 20/02/2016 | 2.7 |
| 20/02/2016 | 2.5 |
| 20/02/2016 | 2.6 |
| 20/02/2016 | 2.4 |
| 20/02/2016 | 2.4 |
| 20/02/2016 | 2.4 |
| 20/02/2016 | 2.4 |
| 20/02/2016 | 2.6 |
| 20/02/2016 | 2.8 |
| 20/02/2016 | 2.8 |
| 20/02/2016 | 2.6 |
| 20/02/2016 | 2.4 |
| 20/02/2016 | 2.2 |
| 20/02/2016 | 2.1 |
| 21/02/2016 | 1.8 |
| 21/02/2016 | 1.8 |
| 21/02/2016 | 1.8 |
| 21/02/2016 | 1.8 |
| 21/02/2016 | 1.8 |
| 21/02/2016 | 1.8 |
| 21/02/2016 | 1.9 |
| 21/02/2016 | 2 |
| 21/02/2016 | 2.1 |
| 21/02/2016 | 2.3 |
| 21/02/2016 | 2.4 |
| 21/02/2016 | 2.4 |
| 21/02/2016 | 2.4 |
| 21/02/2016 | 2.3 |
| 21/02/2016 | 2.3 |
| 21/02/2016 | 2.3 |
| 21/02/2016 | 2.3 |
| 21/02/2016 | 2.5 |
| 21/02/2016 | 2.7 |
| 21/02/2016 | 2.7 |
| 21/02/2016 | 2.5 |
| 21/02/2016 | 2.3 |
| 21/02/2016 | 2.1 |
| 21/02/2016 | 2.1 |
| 22/02/2016 | 1.8 |
| 22/02/2016 | 1.8 |
| 22/02/2016 | 1.8 |
| 22/02/2016 | 1.8 |
| 22/02/2016 | 1.8 |
| 22/02/2016 | 2.1 |
| 22/02/2016 | 2.4 |
| 22/02/2016 | 2.8 |
| 22/02/2016 | 3 |
| 22/02/2016 | 3.1 |
| 22/02/2016 | 3 |
| 22/02/2016 | 3 |
| 22/02/2016 | 3 |
| 22/02/2016 | 3 |
| 22/02/2016 | 2.9 |
| 22/02/2016 | 2.9 |
| 22/02/2016 | 2.9 |
| 22/02/2016 | 3.1 |
| 22/02/2016 | 3.3 |
| 22/02/2016 | 3.2 |
| 22/02/2016 | 2.8 |
| 22/02/2016 | 2.5 |
| 22/02/2016 | 2.4 |
| 22/02/2016 | 2 |
| 23/02/2016 | 1.9 |
| 23/02/2016 | 1.8 |
| 23/02/2016 | 1.8 |
| 23/02/2016 | 1.8 |
| 23/02/2016 | 1.8 |
| 23/02/2016 | 2.1 |
| 23/02/2016 | 2.4 |
| 23/02/2016 | 2.7 |
| 23/02/2016 | 3 |
| 23/02/2016 | 3 |
| 23/02/2016 | 3.1 |
| 23/02/2016 | 3 |
| 23/02/2016 | 2.9 |
| 23/02/2016 | 2.9 |
| 23/02/2016 | 2.9 |
| 23/02/2016 | 2.9 |
| 23/02/2016 | 3 |
| 23/02/2016 | 3 |
| 23/02/2016 | 3.2 |
| 23/02/2016 | 3.2 |
| 23/02/2016 | 2.9 |
| 23/02/2016 | 2.6 |
| 23/02/2016 | 2.2 |
| 23/02/2016 | 2 |
| 24/02/2016 | 1.9 |
| 24/02/2016 | 1.8 |
| 24/02/2016 | 1.8 |
| 24/02/2016 | 1.8 |
| 24/02/2016 | 1.9 |
| 24/02/2016 | 2.1 |
| 24/02/2016 | 2.4 |
| 24/02/2016 | 2.8 |
| 24/02/2016 | 3 |
| 24/02/2016 | 3.1 |
| 24/02/2016 | 3.1 |
| 24/02/2016 | 3 |
| 24/02/2016 | 3 |
| 24/02/2016 | 3 |
| 24/02/2016 | 3 |
| 24/02/2016 | 3 |
| 24/02/2016 | 3 |
| 24/02/2016 | 3.1 |
| 24/02/2016 | 3.2 |
| 24/02/2016 | 3.2 |
| 24/02/2016 | 2.9 |
| 24/02/2016 | 2.6 |
| 24/02/2016 | 2.2 |
| 24/02/2016 | 2 |
| 25/02/2016 | 1.9 |
| 25/02/2016 | 1.8 |
| 25/02/2016 | 1.8 |
| 25/02/2016 | 1.8 |
| 25/02/2016 | 1.8 |
| 25/02/2016 | 2.1 |
| 25/02/2016 | 2.4 |
| 25/02/2016 | 2.7 |
| 25/02/2016 | 2.9 |
| 25/02/2016 | 3 |
| 25/02/2016 | 3 |
| 25/02/2016 | 3 |
| 25/02/2016 | 2.9 |
| 25/02/2016 | 2.8 |
| 25/02/2016 | 2.8 |
| 25/02/2016 | 2.8 |
| 25/02/2016 | 2.8 |
| 25/02/2016 | 2.9 |
| 25/02/2016 | 3.2 |
| 25/02/2016 | 3.1 |
| 25/02/2016 | 2.8 |
| 25/02/2016 | 2.5 |
| 25/02/2016 | 2.1 |
| 25/02/2016 | 2 |
| 26/02/2016 | 1.9 |
| 26/02/2016 | 1.7 |
| 26/02/2016 | 1.8 |
| 26/02/2016 | 1.8 |
| 26/02/2016 | 1.8 |
| 26/02/2016 | 2.1 |
| 26/02/2016 | 2.4 |
| 26/02/2016 | 2.7 |
| 26/02/2016 | 3 |
| 26/02/2016 | 3 |
| 26/02/2016 | 3 |
| 26/02/2016 | 3 |
| 26/02/2016 | 3 |
| 26/02/2016 | 2.8 |
| 26/02/2016 | 2.7 |
| 26/02/2016 | 2.7 |
| 26/02/2016 | 2.8 |
| 26/02/2016 | 2.8 |
| 26/02/2016 | 3.1 |
| 26/02/2016 | 3.1 |
| 26/02/2016 | 2.7 |
| 26/02/2016 | 2.4 |
| 26/02/2016 | 2.2 |
| 26/02/2016 | 2 |
| 27/02/2016 | 1.8 |
| 27/02/2016 | 1.7 |
| 27/02/2016 | 1.8 |
| 27/02/2016 | 1.8 |
| 27/02/2016 | 1.8 |
| 27/02/2016 | 1.8 |
| 27/02/2016 | 1.9 |
| 27/02/2016 | 2 |
| 27/02/2016 | 2.2 |
| 27/02/2016 | 2.4 |
| 27/02/2016 | 2.4 |
| 27/02/2016 | 2.4 |
| 27/02/2016 | 2.5 |
| 27/02/2016 | 2.4 |
| 27/02/2016 | 2.3 |
| 27/02/2016 | 2.3 |
| 27/02/2016 | 2.3 |
| 27/02/2016 | 2.5 |
| 27/02/2016 | 2.7 |
| 27/02/2016 | 2.7 |
| 27/02/2016 | 2.4 |
| 27/02/2016 | 2.2 |
| 27/02/2016 | 2.1 |
| 27/02/2016 | 1.9 |
| 28/02/2016 | 1.8 |
| 28/02/2016 | 1.7 |
| 28/02/2016 | 1.7 |
| 28/02/2016 | 1.7 |
| 28/02/2016 | 1.7 |
| 28/02/2016 | 1.8 |
| 28/02/2016 | 1.8 |
| 28/02/2016 | 1.8 |
| 28/02/2016 | 2.1 |
| 28/02/2016 | 2.1 |
| 28/02/2016 | 2.2 |
| 28/02/2016 | 2.4 |
| 28/02/2016 | 2.4 |
| 28/02/2016 | 2.3 |
| 28/02/2016 | 2.2 |
| 28/02/2016 | 2.3 |
| 28/02/2016 | 2.1 |
| 28/02/2016 | 2.4 |
| 28/02/2016 | 2.7 |
| 28/02/2016 | 2.7 |
| 28/02/2016 | 2.4 |
| 28/02/2016 | 2.3 |
| 28/02/2016 | 2.1 |
| 28/02/2016 | 1.9 |
| 29/02/2016 | 1.8 |
| 29/02/2016 | 1.7 |
| 29/02/2016 | 1.7 |
| 29/02/2016 | 1.8 |
| 29/02/2016 | 1.8 |
| 29/02/2016 | 2 |
| 29/02/2016 | 2.4 |
| 29/02/2016 | 2.7 |
| 29/02/2016 | 2.9 |
| 29/02/2016 | 3 |
| 29/02/2016 | 2.9 |
| 29/02/2016 | 3 |
| 29/02/2016 | 2.9 |
| 29/02/2016 | 2.9 |
| 29/02/2016 | 2.7 |
| 29/02/2016 | 2.7 |
| 29/02/2016 | 2.7 |
| 29/02/2016 | 2.9 |
| 29/02/2016 | 3.1 |
| 29/02/2016 | 3.2 |
| 29/02/2016 | 2.8 |
| 29/02/2016 | 2.4 |
| 29/02/2016 | 2.1 |
| 29/02/2016 | 2 |
| 01/03/2016 | 1.8 |
| 01/03/2016 | 1.8 |
| 01/03/2016 | 1.7 |
| 01/03/2016 | 1.8 |
| 01/03/2016 | 1.8 |
| 01/03/2016 | 2 |
| 01/03/2016 | 2.4 |
| 01/03/2016 | 2.7 |
| 01/03/2016 | 2.9 |
| 01/03/2016 | 3 |
| 01/03/2016 | 3 |
| 01/03/2016 | 2.9 |
| 01/03/2016 | 2.8 |
| 01/03/2016 | 2.8 |
| 01/03/2016 | 2.8 |
| 01/03/2016 | 2.8 |
| 01/03/2016 | 2.8 |
| 01/03/2016 | 3 |
| 01/03/2016 | 3.2 |
| 01/03/2016 | 3.1 |
| 01/03/2016 | 2.7 |
| 01/03/2016 | 2.4 |
| 01/03/2016 | 2.1 |
| 01/03/2016 | 2 |
| 02/03/2016 | 1.8 |
| 02/03/2016 | 1.8 |
| 02/03/2016 | 1.7 |
| 02/03/2016 | 1.7 |
| 02/03/2016 | 1.8 |
| 02/03/2016 | 2 |
| 02/03/2016 | 2.4 |
| 02/03/2016 | 2.7 |
| 02/03/2016 | 3 |
| 02/03/2016 | 3 |
| 02/03/2016 | 3 |
| 02/03/2016 | 3 |
| 02/03/2016 | 2.9 |
| 02/03/2016 | 2.9 |
| 02/03/2016 | 2.8 |
| 02/03/2016 | 2.8 |
| 02/03/2016 | 2.8 |
| 02/03/2016 | 2.9 |
| 02/03/2016 | 3.2 |
| 02/03/2016 | 3.2 |
| 02/03/2016 | 2.7 |
| 02/03/2016 | 2.4 |
| 02/03/2016 | 2.1 |
| 02/03/2016 | 2 |
| 03/03/2016 | 1.8 |
| 03/03/2016 | 1.8 |
| 03/03/2016 | 1.7 |
| 03/03/2016 | 1.7 |
| 03/03/2016 | 1.8 |
| 03/03/2016 | 2 |
| 03/03/2016 | 2.4 |
| 03/03/2016 | 2.6 |
| 03/03/2016 | 2.8 |
| 03/03/2016 | 2.9 |
| 03/03/2016 | 3 |
| 03/03/2016 | 2.8 |
| 03/03/2016 | 2.7 |
| 03/03/2016 | 2.7 |
| 03/03/2016 | 2.7 |
| 03/03/2016 | 2.7 |
| 03/03/2016 | 2.7 |
| 03/03/2016 | 2.7 |
| 03/03/2016 | 3 |
| 03/03/2016 | 3.1 |
| 03/03/2016 | 2.7 |
| 03/03/2016 | 2.3 |
| 03/03/2016 | 2.1 |
| 03/03/2016 | 1.9 |
| 04/03/2016 | 1.8 |
| 04/03/2016 | 1.8 |
| 04/03/2016 | 1.7 |
| 04/03/2016 | 1.8 |
| 04/03/2016 | 1.7 |
| 04/03/2016 | 1.9 |
| 04/03/2016 | 2.3 |
| 04/03/2016 | 2.7 |
| 04/03/2016 | 2.7 |
| 04/03/2016 | 2.9 |
| 04/03/2016 | 2.9 |
| 04/03/2016 | 3 |
| 04/03/2016 | 2.8 |
| 04/03/2016 | 2.7 |
| 04/03/2016 | 2.6 |
| 04/03/2016 | 2.7 |
| 04/03/2016 | 2.7 |
| 04/03/2016 | 2.7 |
| 04/03/2016 | 3 |
| 04/03/2016 | 3 |
| 04/03/2016 | 2.7 |
| 04/03/2016 | 2.4 |
| 04/03/2016 | 2.1 |
| 04/03/2016 | 2 |
| 05/03/2016 | 1.8 |
| 05/03/2016 | 1.7 |
| 05/03/2016 | 1.6 |
| 05/03/2016 | 1.7 |
| 05/03/2016 | 1.6 |
| 05/03/2016 | 1.7 |
| 05/03/2016 | 1.9 |
| 05/03/2016 | 2 |
| 05/03/2016 | 2.2 |
| 05/03/2016 | 2.4 |
| 05/03/2016 | 2.4 |
| 05/03/2016 | 2.4 |
| 05/03/2016 | 2.4 |
| 05/03/2016 | 2.3 |
| 05/03/2016 | 2.2 |
| 05/03/2016 | 2.2 |
| 05/03/2016 | 2.2 |
| 05/03/2016 | 2.4 |
| 05/03/2016 | 2.7 |
| 05/03/2016 | 2.7 |
| 05/03/2016 | 2.5 |
| 05/03/2016 | 2.2 |
| 05/03/2016 | 2.1 |
| 05/03/2016 | 1.9 |
| 06/03/2016 | 1.8 |
| 06/03/2016 | 1.8 |
| 06/03/2016 | 1.7 |
| 06/03/2016 | 1.6 |
| 06/03/2016 | 1.8 |
| 06/03/2016 | 1.7 |
| 06/03/2016 | 1.8 |
| 06/03/2016 | 1.8 |
| 06/03/2016 | 2 |
| 06/03/2016 | 2.1 |
| 06/03/2016 | 2.2 |
| 06/03/2016 | 2.2 |
| 06/03/2016 | 2.3 |
| 06/03/2016 | 2.2 |
| 06/03/2016 | 2.1 |
| 06/03/2016 | 2.2 |
| 06/03/2016 | 2.1 |
| 06/03/2016 | 2.1 |
| 06/03/2016 | 2.5 |
| 06/03/2016 | 2.5 |
| 06/03/2016 | 2.4 |
| 06/03/2016 | 2.1 |
| 06/03/2016 | 2 |
| 06/03/2016 | 1.9 |
| 07/03/2016 | 1.8 |
| 07/03/2016 | 1.7 |
| 07/03/2016 | 1.7 |
| 07/03/2016 | 1.7 |
| 07/03/2016 | 1.8 |
| 07/03/2016 | 1.9 |
| 07/03/2016 | 2.3 |
| 07/03/2016 | 2.6 |
| 07/03/2016 | 2.8 |
| 07/03/2016 | 2.9 |
| 07/03/2016 | 2.8 |
| 07/03/2016 | 2.8 |
| 07/03/2016 | 2.8 |
| 07/03/2016 | 2.8 |
| 07/03/2016 | 2.7 |
| 07/03/2016 | 2.7 |
| 07/03/2016 | 2.6 |
| 07/03/2016 | 2.7 |
| 07/03/2016 | 3 |
| 07/03/2016 | 3 |
| 07/03/2016 | 2.7 |
| 07/03/2016 | 2.4 |
| 07/03/2016 | 2.1 |
| 07/03/2016 | 1.9 |
| 08/03/2016 | 1.8 |
| 08/03/2016 | 1.6 |
| 08/03/2016 | 1.8 |
| 08/03/2016 | 1.7 |
| 08/03/2016 | 1.8 |
| 08/03/2016 | 1.9 |
| 08/03/2016 | 2.2 |
| 08/03/2016 | 2.6 |
| 08/03/2016 | 2.8 |
| 08/03/2016 | 2.9 |
| 08/03/2016 | 2.9 |
| 08/03/2016 | 2.7 |
| 08/03/2016 | 2.7 |
| 08/03/2016 | 2.7 |
| 08/03/2016 | 2.7 |
| 08/03/2016 | 2.7 |
| 08/03/2016 | 2.7 |
| 08/03/2016 | 2.8 |
| 08/03/2016 | 3 |
| 08/03/2016 | 3.1 |
| 08/03/2016 | 2.7 |
| 08/03/2016 | 2.4 |
| 08/03/2016 | 2.1 |
| 08/03/2016 | 2 |
| 09/03/2016 | 1.8 |
| 09/03/2016 | 1.7 |
| 09/03/2016 | 1.6 |
| 09/03/2016 | 1.8 |
| 09/03/2016 | 1.8 |
| 09/03/2016 | 1.9 |
| 09/03/2016 | 2.2 |
| 09/03/2016 | 2.6 |
| 09/03/2016 | 2.8 |
| 09/03/2016 | 2.9 |
| 09/03/2016 | 3 |
| 09/03/2016 | 2.8 |
| 09/03/2016 | 2.8 |
| 09/03/2016 | 2.7 |
| 09/03/2016 | 2.7 |
| 09/03/2016 | 2.7 |
| 09/03/2016 | 2.7 |
| 09/03/2016 | 2.7 |
| 09/03/2016 | 3 |
| 09/03/2016 | 3 |
| 09/03/2016 | 2.7 |
| 09/03/2016 | 2.4 |
| 09/03/2016 | 2.1 |
| 09/03/2016 | 1.8 |
| 10/03/2016 | 1.8 |
| 10/03/2016 | 1.6 |
| 10/03/2016 | 1.6 |
| 10/03/2016 | 1.7 |
| 10/03/2016 | 1.8 |
| 10/03/2016 | 1.8 |
| 10/03/2016 | 2.4 |
| 10/03/2016 | 2.5 |
| 10/03/2016 | 2.7 |
| 10/03/2016 | 2.8 |
| 10/03/2016 | 2.8 |
| 10/03/2016 | 2.7 |
| 10/03/2016 | 2.7 |
| 10/03/2016 | 2.7 |
| 10/03/2016 | 2.6 |
| 10/03/2016 | 2.6 |
| 10/03/2016 | 2.5 |
| 10/03/2016 | 2.6 |
| 10/03/2016 | 3 |
| 10/03/2016 | 3 |
| 10/03/2016 | 2.7 |
| 10/03/2016 | 2.3 |
| 10/03/2016 | 2.1 |
| 10/03/2016 | 1.8 |
| 11/03/2016 | 1.8 |
| 11/03/2016 | 1.6 |
| 11/03/2016 | 1.7 |
| 11/03/2016 | 1.7 |
| 11/03/2016 | 1.8 |
| 11/03/2016 | 2 |
| 11/03/2016 | 2.2 |
| 11/03/2016 | 2.6 |
| 11/03/2016 | 2.7 |
| 11/03/2016 | 2.8 |
| 11/03/2016 | 2.8 |
| 11/03/2016 | 2.8 |
| 11/03/2016 | 2.7 |
| 11/03/2016 | 2.7 |
| 11/03/2016 | 2.7 |
| 11/03/2016 | 2.6 |
| 11/03/2016 | 2.5 |
| 11/03/2016 | 2.5 |
| 11/03/2016 | 2.9 |
| 11/03/2016 | 2.9 |
| 11/03/2016 | 2.5 |
| 11/03/2016 | 2.2 |
| 11/03/2016 | 2 |
| 11/03/2016 | 1.8 |
| 12/03/2016 | 1.6 |
| 12/03/2016 | 1.5 |
| 12/03/2016 | 1.7 |
| 12/03/2016 | 1.5 |
| 12/03/2016 | 1.7 |
| 12/03/2016 | 1.8 |
| 12/03/2016 | 1.8 |
| 12/03/2016 | 2 |
| 12/03/2016 | 2.1 |
| 12/03/2016 | 2.1 |
| 12/03/2016 | 2.3 |
| 12/03/2016 | 2.3 |
| 12/03/2016 | 2.2 |
| 12/03/2016 | 2.2 |
| 12/03/2016 | 2.1 |
| 12/03/2016 | 2.1 |
| 12/03/2016 | 2.1 |
| 12/03/2016 | 2.1 |
| 12/03/2016 | 2.6 |
| 12/03/2016 | 2.5 |
| 12/03/2016 | 2.4 |
| 12/03/2016 | 2.1 |
| 12/03/2016 | 1.9 |
| 12/03/2016 | 1.8 |
| 13/03/2016 | 1.7 |
| 13/03/2016 | 1.6 |
| 13/03/2016 | 1.6 |
| 13/03/2016 | 1.7 |
| 13/03/2016 | 1.6 |
| 13/03/2016 | 1.7 |
| 13/03/2016 | 1.7 |
| 13/03/2016 | 1.8 |
| 13/03/2016 | 2 |
| 13/03/2016 | 2.1 |
| 13/03/2016 | 2.1 |
| 13/03/2016 | 2.1 |
| 13/03/2016 | 2.2 |
| 13/03/2016 | 2.2 |
| 13/03/2016 | 2.1 |
| 13/03/2016 | 2 |
| 13/03/2016 | 2 |
| 13/03/2016 | 2.1 |
| 13/03/2016 | 2.4 |
| 13/03/2016 | 2.5 |
| 13/03/2016 | 2.3 |
| 13/03/2016 | 2.1 |
| 13/03/2016 | 1.9 |
| 13/03/2016 | 1.8 |
| 14/03/2016 | 1.7 |
| 14/03/2016 | 1.6 |
| 14/03/2016 | 1.6 |
| 14/03/2016 | 1.6 |
| 14/03/2016 | 1.7 |
| 14/03/2016 | 1.9 |
| 14/03/2016 | 2.3 |
| 14/03/2016 | 2.5 |
| 14/03/2016 | 2.6 |
| 14/03/2016 | 2.7 |
| 14/03/2016 | 2.7 |
| 14/03/2016 | 2.7 |
| 14/03/2016 | 2.7 |
| 14/03/2016 | 2.7 |
| 14/03/2016 | 2.6 |
| 14/03/2016 | 2.5 |
| 14/03/2016 | 2.6 |
| 14/03/2016 | 2.6 |
| 14/03/2016 | 3 |
| 14/03/2016 | 3 |
| 14/03/2016 | 2.7 |
| 14/03/2016 | 2.4 |
| 14/03/2016 | 1.9 |
| 14/03/2016 | 1.8 |
| 15/03/2016 | 1.8 |
| 15/03/2016 | 1.7 |
| 15/03/2016 | 1.6 |
| 15/03/2016 | 1.6 |
| 15/03/2016 | 1.7 |
| 15/03/2016 | 1.9 |
| 15/03/2016 | 2.2 |
| 15/03/2016 | 2.5 |
| 15/03/2016 | 2.7 |
| 15/03/2016 | 2.8 |
| 15/03/2016 | 2.8 |
| 15/03/2016 | 2.7 |
| 15/03/2016 | 2.7 |
| 15/03/2016 | 2.6 |
| 15/03/2016 | 2.6 |
| 15/03/2016 | 2.6 |
| 15/03/2016 | 2.6 |
| 15/03/2016 | 2.7 |
| 15/03/2016 | 3 |
| 15/03/2016 | 3 |
| 15/03/2016 | 2.7 |
| 15/03/2016 | 2.4 |
| 15/03/2016 | 2 |
| 15/03/2016 | 1.8 |
| 16/03/2016 | 1.7 |
| 16/03/2016 | 1.7 |
| 16/03/2016 | 1.7 |
| 16/03/2016 | 1.6 |
| 16/03/2016 | 1.8 |
| 16/03/2016 | 2 |
| 16/03/2016 | 2.3 |
| 16/03/2016 | 2.6 |
| 16/03/2016 | 2.8 |
| 16/03/2016 | 2.9 |
| 16/03/2016 | 2.9 |
| 16/03/2016 | 2.7 |
| 16/03/2016 | 2.7 |
| 16/03/2016 | 2.7 |
| 16/03/2016 | 2.7 |
| 16/03/2016 | 2.7 |
| 16/03/2016 | 2.6 |
| 16/03/2016 | 2.7 |
| 16/03/2016 | 3 |
| 16/03/2016 | 3 |
| 16/03/2016 | 2.7 |
| 16/03/2016 | 2.4 |
| 16/03/2016 | 2 |
| 16/03/2016 | 1.8 |
| 17/03/2016 | 1.7 |
| 17/03/2016 | 1.7 |
| 17/03/2016 | 1.7 |
| 17/03/2016 | 1.6 |
| 17/03/2016 | 1.8 |
| 17/03/2016 | 1.9 |
| 17/03/2016 | 2.2 |
| 17/03/2016 | 2.5 |
| 17/03/2016 | 2.7 |
| 17/03/2016 | 2.8 |
| 17/03/2016 | 2.8 |
| 17/03/2016 | 2.7 |
| 17/03/2016 | 2.7 |
| 17/03/2016 | 2.6 |
| 17/03/2016 | 2.6 |
| 17/03/2016 | 2.5 |
| 17/03/2016 | 2.5 |
| 17/03/2016 | 2.7 |
| 17/03/2016 | 2.9 |
| 17/03/2016 | 2.8 |
| 17/03/2016 | 2.7 |
| 17/03/2016 | 2.4 |
| 17/03/2016 | 2 |
| 17/03/2016 | 1.8 |
| 18/03/2016 | 1.7 |
| 18/03/2016 | 1.7 |
| 18/03/2016 | 1.6 |
| 18/03/2016 | 1.6 |
| 18/03/2016 | 1.7 |
| 18/03/2016 | 1.9 |
| 18/03/2016 | 2.3 |
| 18/03/2016 | 2.4 |
| 18/03/2016 | 2.7 |
| 18/03/2016 | 2.8 |
| 18/03/2016 | 2.8 |
| 18/03/2016 | 2.7 |
| 18/03/2016 | 2.7 |
| 18/03/2016 | 2.7 |
| 18/03/2016 | 2.5 |
| 18/03/2016 | 2.6 |
| 18/03/2016 | 2.6 |
| 18/03/2016 | 2.7 |
| 18/03/2016 | 2.9 |
| 18/03/2016 | 2.8 |
| 18/03/2016 | 2.5 |
| 18/03/2016 | 2.3 |
| 18/03/2016 | 2.1 |
| 18/03/2016 | 1.8 |
| 19/03/2016 | 1.7 |
| 19/03/2016 | 1.6 |
| 19/03/2016 | 1.6 |
| 19/03/2016 | 1.7 |
| 19/03/2016 | 1.7 |
| 19/03/2016 | 1.7 |
| 19/03/2016 | 1.8 |
| 19/03/2016 | 1.8 |
| 19/03/2016 | 2.1 |
| 19/03/2016 | 2.2 |
| 19/03/2016 | 2.4 |
| 19/03/2016 | 2.4 |
| 19/03/2016 | 2.3 |
| 19/03/2016 | 2.3 |
| 19/03/2016 | 2.2 |
| 19/03/2016 | 2.2 |
| 19/03/2016 | 2.2 |
| 19/03/2016 | 2.2 |
| 19/03/2016 | 2.5 |
| 19/03/2016 | 2.6 |
| 19/03/2016 | 2.4 |
| 19/03/2016 | 2.1 |
| 19/03/2016 | 2 |
| 19/03/2016 | 1.8 |
| 20/03/2016 | 1.8 |
| 20/03/2016 | 1.8 |
| 20/03/2016 | 1.7 |
| 20/03/2016 | 1.6 |
| 20/03/2016 | 1.6 |
| 20/03/2016 | 1.7 |
| 20/03/2016 | 1.8 |
| 20/03/2016 | 1.8 |
| 20/03/2016 | 1.9 |
| 20/03/2016 | 2 |
| 20/03/2016 | 2.1 |
| 20/03/2016 | 2.2 |
| 20/03/2016 | 2.1 |
| 20/03/2016 | 2.1 |
| 20/03/2016 | 2.1 |
| 20/03/2016 | 2.1 |
| 20/03/2016 | 2.1 |
| 20/03/2016 | 2.3 |
| 20/03/2016 | 2.4 |
| 20/03/2016 | 2.4 |
| 20/03/2016 | 2.3 |
| 20/03/2016 | 2.1 |
| 20/03/2016 | 2.1 |
| 20/03/2016 | 1.8 |
| 21/03/2016 | 1.8 |
| 21/03/2016 | 1.7 |
| 21/03/2016 | 1.7 |
| 21/03/2016 | 1.7 |
| 21/03/2016 | 1.8 |
| 21/03/2016 | 1.9 |
| 21/03/2016 | 2.1 |
| 21/03/2016 | 2.4 |
| 21/03/2016 | 2.6 |
| 21/03/2016 | 2.7 |
| 21/03/2016 | 2.7 |
| 21/03/2016 | 2.7 |
| 21/03/2016 | 2.6 |
| 21/03/2016 | 2.6 |
| 21/03/2016 | 2.5 |
| 21/03/2016 | 2.5 |
| 21/03/2016 | 2.5 |
| 21/03/2016 | 2.7 |
| 21/03/2016 | 2.8 |
| 21/03/2016 | 2.7 |
| 21/03/2016 | 2.5 |
| 21/03/2016 | 2.2 |
| 21/03/2016 | 2.1 |
| 21/03/2016 | 1.8 |
| 22/03/2016 | 1.7 |
| 22/03/2016 | 1.8 |
| 22/03/2016 | 1.8 |
| 22/03/2016 | 1.7 |
| 22/03/2016 | 1.8 |
| 22/03/2016 | 1.9 |
| 22/03/2016 | 2.1 |
| 22/03/2016 | 2.4 |
| 22/03/2016 | 2.6 |
| 22/03/2016 | 2.7 |
| 22/03/2016 | 2.8 |
| 22/03/2016 | 2.7 |
| 22/03/2016 | 2.7 |
| 22/03/2016 | 2.7 |
| 22/03/2016 | 2.6 |
| 22/03/2016 | 2.6 |
| 22/03/2016 | 2.6 |
| 22/03/2016 | 2.7 |
| 22/03/2016 | 2.9 |
| 22/03/2016 | 2.8 |
| 22/03/2016 | 2.6 |
| 22/03/2016 | 2.3 |
| 22/03/2016 | 2.1 |
| 22/03/2016 | 1.8 |
| 23/03/2016 | 1.8 |
| 23/03/2016 | 1.7 |
| 23/03/2016 | 1.8 |
| 23/03/2016 | 1.8 |
| 23/03/2016 | 1.8 |
| 23/03/2016 | 2 |
| 23/03/2016 | 2.1 |
| 23/03/2016 | 2.5 |
| 23/03/2016 | 2.7 |
| 23/03/2016 | 2.8 |
| 23/03/2016 | 2.7 |
| 23/03/2016 | 2.8 |
| 23/03/2016 | 2.8 |
| 23/03/2016 | 2.7 |
| 23/03/2016 | 2.7 |
| 23/03/2016 | 2.6 |
| 23/03/2016 | 2.6 |
| 23/03/2016 | 2.7 |
| 23/03/2016 | 2.9 |
| 23/03/2016 | 2.9 |
| 23/03/2016 | 2.6 |
| 23/03/2016 | 2.3 |
| 23/03/2016 | 2.1 |
| 23/03/2016 | 1.9 |
| 24/03/2016 | 1.8 |
| 24/03/2016 | 1.6 |
| 24/03/2016 | 1.8 |
| 24/03/2016 | 1.7 |
| 24/03/2016 | 1.8 |
| 24/03/2016 | 1.9 |
| 24/03/2016 | 2.2 |
| 24/03/2016 | 2.4 |
| 24/03/2016 | 2.6 |
| 24/03/2016 | 2.7 |
| 24/03/2016 | 2.7 |
| 24/03/2016 | 2.7 |
| 24/03/2016 | 2.7 |
| 24/03/2016 | 2.7 |
| 24/03/2016 | 2.6 |
| 24/03/2016 | 2.5 |
| 24/03/2016 | 2.5 |
| 24/03/2016 | 2.6 |
| 24/03/2016 | 2.7 |
| 24/03/2016 | 2.7 |
| 24/03/2016 | 2.4 |
| 24/03/2016 | 2.3 |
| 24/03/2016 | 2.1 |
| 24/03/2016 | 1.8 |
| 25/03/2016 | 1.8 |
| 25/03/2016 | 1.8 |
| 25/03/2016 | 1.8 |
| 25/03/2016 | 1.7 |
| 25/03/2016 | 1.7 |
| 25/03/2016 | 1.7 |
| 25/03/2016 | 1.8 |
| 25/03/2016 | 1.7 |
| 25/03/2016 | 1.9 |
| 25/03/2016 | 2.1 |
| 25/03/2016 | 2.1 |
| 25/03/2016 | 2.2 |
| 25/03/2016 | 2.2 |
| 25/03/2016 | 2.3 |
| 25/03/2016 | 2.2 |
| 25/03/2016 | 2.1 |
| 25/03/2016 | 2.1 |
| 25/03/2016 | 2.3 |
| 25/03/2016 | 2.4 |
| 25/03/2016 | 2.2 |
| 25/03/2016 | 2.1 |
| 25/03/2016 | 2.1 |
| 25/03/2016 | 2 |
| 25/03/2016 | 1.8 |
| 26/03/2016 | 1.8 |
| 26/03/2016 | 1.8 |
| 26/03/2016 | 1.7 |
| 26/03/2016 | 1.8 |
| 26/03/2016 | 1.8 |
| 26/03/2016 | 1.8 |
| 26/03/2016 | 1.8 |
| 26/03/2016 | 1.8 |
| 26/03/2016 | 2.1 |
| 26/03/2016 | 2.2 |
| 26/03/2016 | 2.3 |
| 26/03/2016 | 2.3 |
| 26/03/2016 | 2.4 |
| 26/03/2016 | 2.2 |
| 26/03/2016 | 2.1 |
| 26/03/2016 | 2.1 |
| 26/03/2016 | 2.1 |
| 26/03/2016 | 2.4 |
| 26/03/2016 | 2.4 |
| 26/03/2016 | 2.4 |
| 26/03/2016 | 2.3 |
| 26/03/2016 | 2.1 |
| 26/03/2016 | 2 |
| 26/03/2016 | 1.8 |
| 27/03/2016 | 1.6 |
| 27/03/2016 | 1.6 |
| 27/03/2016 | 0 |
| 27/03/2016 | 1.5 |
| 27/03/2016 | 1.5 |
| 27/03/2016 | 1.5 |
| 27/03/2016 | 1.7 |
| 27/03/2016 | 1.9 |
| 27/03/2016 | 2 |
| 27/03/2016 | 2.1 |
| 27/03/2016 | 2.1 |
| 27/03/2016 | 2.1 |
| 27/03/2016 | 2.1 |
| 27/03/2016 | 1.9 |
| 27/03/2016 | 2 |
| 27/03/2016 | 1.8 |
| 27/03/2016 | 1.8 |
| 27/03/2016 | 1.7 |
| 27/03/2016 | 2.3 |
| 27/03/2016 | 2.4 |
| 27/03/2016 | 2.1 |
| 27/03/2016 | 1.9 |
| 27/03/2016 | 1.8 |
| 27/03/2016 | 1.8 |
| 28/03/2016 | 1.5 |
| 28/03/2016 | 1.6 |
| 28/03/2016 | 1.6 |
| 28/03/2016 | 1.5 |
| 28/03/2016 | 1.5 |
| 28/03/2016 | 1.5 |
| 28/03/2016 | 1.7 |
| 28/03/2016 | 1.9 |
| 28/03/2016 | 2 |
| 28/03/2016 | 2.1 |
| 28/03/2016 | 2.1 |
| 28/03/2016 | 2.1 |
| 28/03/2016 | 2.1 |
| 28/03/2016 | 1.9 |
| 28/03/2016 | 2 |
| 28/03/2016 | 1.8 |
| 28/03/2016 | 1.9 |
| 28/03/2016 | 1.8 |
| 28/03/2016 | 2.4 |
| 28/03/2016 | 2.4 |
| 28/03/2016 | 2.2 |
| 28/03/2016 | 1.9 |
| 28/03/2016 | 1.8 |
| 28/03/2016 | 1.8 |
| 29/03/2016 | 1.8 |
| 29/03/2016 | 1.8 |
| 29/03/2016 | 1.8 |
| 29/03/2016 | 1.7 |
| 29/03/2016 | 1.8 |
| 29/03/2016 | 1.9 |
| 29/03/2016 | 2.3 |
| 29/03/2016 | 2.5 |
| 29/03/2016 | 2.8 |
| 29/03/2016 | 2.9 |
| 29/03/2016 | 2.9 |
| 29/03/2016 | 3 |
| 29/03/2016 | 2.9 |
| 29/03/2016 | 2.8 |
| 29/03/2016 | 2.7 |
| 29/03/2016 | 2.7 |
| 29/03/2016 | 2.7 |
| 29/03/2016 | 2.7 |
| 29/03/2016 | 2.9 |
| 29/03/2016 | 2.9 |
| 29/03/2016 | 2.8 |
| 29/03/2016 | 2.4 |
| 29/03/2016 | 2.1 |
| 29/03/2016 | 2.1 |
| 30/03/2016 | 1.8 |
| 30/03/2016 | 1.8 |
| 30/03/2016 | 1.8 |
| 30/03/2016 | 1.8 |
| 30/03/2016 | 1.8 |
| 30/03/2016 | 2 |
| 30/03/2016 | 2.3 |
| 30/03/2016 | 2.6 |
| 30/03/2016 | 2.9 |
| 30/03/2016 | 3 |
| 30/03/2016 | 3 |
| 30/03/2016 | 3 |
| 30/03/2016 | 3 |
| 30/03/2016 | 2.9 |
| 30/03/2016 | 2.8 |
| 30/03/2016 | 2.7 |
| 30/03/2016 | 2.7 |
| 30/03/2016 | 2.7 |
| 30/03/2016 | 3 |
| 30/03/2016 | 2.9 |
| 30/03/2016 | 2.7 |
| 30/03/2016 | 2.4 |
| 30/03/2016 | 2.1 |
| 30/03/2016 | 2.1 |
| 31/03/2016 | 1.8 |
| 31/03/2016 | 1.8 |
| 31/03/2016 | 1.8 |
| 31/03/2016 | 1.8 |
| 31/03/2016 | 1.8 |
| 31/03/2016 | 1.9 |
| 31/03/2016 | 2.3 |
| 31/03/2016 | 2.5 |
| 31/03/2016 | 2.8 |
| 31/03/2016 | 2.9 |
| 31/03/2016 | 2.9 |
| 31/03/2016 | 3 |
| 31/03/2016 | 3 |
| 31/03/2016 | 2.8 |
| 31/03/2016 | 2.7 |
| 31/03/2016 | 2.7 |
| 31/03/2016 | 2.6 |
| 31/03/2016 | 2.6 |
| 31/03/2016 | 2.9 |
| 31/03/2016 | 2.9 |
| 31/03/2016 | 2.7 |
| 31/03/2016 | 2.3 |
| 31/03/2016 | 2.1 |
| 31/03/2016 | 2.1 |
| 01/04/2016 | 1.8 |
| 01/04/2016 | 1.8 |
| 01/04/2016 | 1.8 |
| 01/04/2016 | 1.7 |
| 01/04/2016 | 1.8 |
| 01/04/2016 | 2.1 |
| 01/04/2016 | 2.2 |
| 01/04/2016 | 2.6 |
| 01/04/2016 | 2.7 |
| 01/04/2016 | 2.9 |
| 01/04/2016 | 3 |
| 01/04/2016 | 3 |
| 01/04/2016 | 2.9 |
| 01/04/2016 | 2.8 |
| 01/04/2016 | 2.7 |
| 01/04/2016 | 2.6 |
| 01/04/2016 | 2.7 |
| 01/04/2016 | 2.5 |
| 01/04/2016 | 2.8 |
| 01/04/2016 | 2.7 |
| 01/04/2016 | 2.5 |
| 01/04/2016 | 2.4 |
| 01/04/2016 | 2.2 |
| 01/04/2016 | 1.9 |
| 02/04/2016 | 1.8 |
| 02/04/2016 | 1.8 |
| 02/04/2016 | 1.7 |
| 02/04/2016 | 1.8 |
| 02/04/2016 | 1.8 |
| 02/04/2016 | 1.7 |
| 02/04/2016 | 1.8 |
| 02/04/2016 | 2 |
| 02/04/2016 | 2.1 |
| 02/04/2016 | 2.3 |
| 02/04/2016 | 2.4 |
| 02/04/2016 | 2.4 |
| 02/04/2016 | 2.4 |
| 02/04/2016 | 2.4 |
| 02/04/2016 | 2.2 |
| 02/04/2016 | 2.2 |
| 02/04/2016 | 2.2 |
| 02/04/2016 | 2.2 |
| 02/04/2016 | 2.5 |
| 02/04/2016 | 2.4 |
| 02/04/2016 | 2.4 |
| 02/04/2016 | 2.3 |
| 02/04/2016 | 2.1 |
| 02/04/2016 | 2 |
| 03/04/2016 | 1.9 |
| 03/04/2016 | 1.7 |
| 03/04/2016 | 1.7 |
| 03/04/2016 | 1.8 |
| 03/04/2016 | 1.8 |
| 03/04/2016 | 1.8 |
| 03/04/2016 | 1.8 |
| 03/04/2016 | 1.9 |
| 03/04/2016 | 2.1 |
| 03/04/2016 | 2.2 |
| 03/04/2016 | 2.3 |
| 03/04/2016 | 2.3 |
| 03/04/2016 | 2.4 |
| 03/04/2016 | 2.4 |
| 03/04/2016 | 2.3 |
| 03/04/2016 | 2.3 |
| 03/04/2016 | 2.2 |
| 03/04/2016 | 2.1 |
| 03/04/2016 | 2.4 |
| 03/04/2016 | 2.6 |
| 03/04/2016 | 2.4 |
| 03/04/2016 | 2.2 |
| 03/04/2016 | 2.1 |
| 03/04/2016 | 2.1 |
| 04/04/2016 | 1.9 |
| 04/04/2016 | 1.8 |
| 04/04/2016 | 1.7 |
| 04/04/2016 | 1.8 |
| 04/04/2016 | 1.8 |
| 04/04/2016 | 2 |
| 04/04/2016 | 2.4 |
| 04/04/2016 | 2.7 |
| 04/04/2016 | 2.8 |
| 04/04/2016 | 2.9 |
| 04/04/2016 | 3 |
| 04/04/2016 | 3 |
| 04/04/2016 | 3 |
| 04/04/2016 | 3 |
| 04/04/2016 | 2.9 |
| 04/04/2016 | 2.9 |
| 04/04/2016 | 2.8 |
| 04/04/2016 | 2.7 |
| 04/04/2016 | 3 |
| 04/04/2016 | 3 |
| 04/04/2016 | 2.8 |
| 04/04/2016 | 2.5 |
| 04/04/2016 | 2.3 |
| 04/04/2016 | 2.1 |
| 05/04/2016 | 1.9 |
| 05/04/2016 | 1.8 |
| 05/04/2016 | 1.7 |
| 05/04/2016 | 1.8 |
| 05/04/2016 | 1.8 |
| 05/04/2016 | 2 |
| 05/04/2016 | 2.4 |
| 05/04/2016 | 2.7 |
| 05/04/2016 | 3 |
| 05/04/2016 | 2.9 |
| 05/04/2016 | 3 |
| 05/04/2016 | 3 |
| 05/04/2016 | 3 |
| 05/04/2016 | 3 |
| 05/04/2016 | 3 |
| 05/04/2016 | 3 |
| 05/04/2016 | 3 |
| 05/04/2016 | 2.9 |
| 05/04/2016 | 3 |
| 05/04/2016 | 3 |
| 05/04/2016 | 2.9 |
| 05/04/2016 | 2.6 |
| 05/04/2016 | 2.3 |
| 05/04/2016 | 2.1 |
| 06/04/2016 | 1.9 |
| 06/04/2016 | 1.8 |
| 06/04/2016 | 1.8 |
| 06/04/2016 | 1.9 |
| 06/04/2016 | 1.8 |
| 06/04/2016 | 2.1 |
| 06/04/2016 | 2.4 |
| 06/04/2016 | 2.8 |
| 06/04/2016 | 2.9 |
| 06/04/2016 | 3 |
| 06/04/2016 | 3 |
| 06/04/2016 | 3.1 |
| 06/04/2016 | 3.1 |
| 06/04/2016 | 3.1 |
| 06/04/2016 | 3 |
| 06/04/2016 | 3 |
| 06/04/2016 | 3 |
| 06/04/2016 | 2.9 |
| 06/04/2016 | 3 |
| 06/04/2016 | 3.1 |
| 06/04/2016 | 2.9 |
| 06/04/2016 | 2.5 |
| 06/04/2016 | 2.4 |
| 06/04/2016 | 2.1 |
| 07/04/2016 | 1.9 |
| 07/04/2016 | 1.8 |
| 07/04/2016 | 1.8 |
| 07/04/2016 | 1.8 |
| 07/04/2016 | 1.8 |
| 07/04/2016 | 2 |
| 07/04/2016 | 2.4 |
| 07/04/2016 | 2.7 |
| 07/04/2016 | 3 |
| 07/04/2016 | 2.9 |
| 07/04/2016 | 3 |
| 07/04/2016 | 3 |
| 07/04/2016 | 3 |
| 07/04/2016 | 3 |
| 07/04/2016 | 2.9 |
| 07/04/2016 | 2.9 |
| 07/04/2016 | 2.7 |
| 07/04/2016 | 2.8 |
| 07/04/2016 | 2.9 |
| 07/04/2016 | 3 |
| 07/04/2016 | 2.7 |
| 07/04/2016 | 2.5 |
| 07/04/2016 | 2.3 |
| 07/04/2016 | 2 |
| 08/04/2016 | 1.9 |
| 08/04/2016 | 1.8 |
| 08/04/2016 | 1.8 |
| 08/04/2016 | 1.8 |
| 08/04/2016 | 2 |
| 08/04/2016 | 2.1 |
| 08/04/2016 | 2.3 |
| 08/04/2016 | 2.7 |
| 08/04/2016 | 2.9 |
| 08/04/2016 | 3 |
| 08/04/2016 | 3 |
| 08/04/2016 | 3 |
| 08/04/2016 | 3 |
| 08/04/2016 | 3 |
| 08/04/2016 | 2.9 |
| 08/04/2016 | 2.8 |
| 08/04/2016 | 2.8 |
| 08/04/2016 | 2.7 |
| 08/04/2016 | 2.8 |
| 08/04/2016 | 3 |
| 08/04/2016 | 2.8 |
| 08/04/2016 | 2.4 |
| 08/04/2016 | 2.2 |
| 08/04/2016 | 2.1 |
| 09/04/2016 | 1.8 |
| 09/04/2016 | 1.9 |
| 09/04/2016 | 1.8 |
| 09/04/2016 | 1.8 |
| 09/04/2016 | 1.8 |
| 09/04/2016 | 1.9 |
| 09/04/2016 | 1.9 |
| 09/04/2016 | 2.1 |
| 09/04/2016 | 2.1 |
| 09/04/2016 | 2.4 |
| 09/04/2016 | 2.5 |
| 09/04/2016 | 2.5 |
| 09/04/2016 | 2.5 |
| 09/04/2016 | 2.5 |
| 09/04/2016 | 2.4 |
| 09/04/2016 | 2.4 |
| 09/04/2016 | 2.4 |
| 09/04/2016 | 2.4 |
| 09/04/2016 | 2.5 |
| 09/04/2016 | 2.5 |
| 09/04/2016 | 2.5 |
| 09/04/2016 | 2.4 |
| 09/04/2016 | 2.1 |
| 09/04/2016 | 2 |
| 09/04/2016 | 1.9 |
| 10/04/2016 | 1.8 |
| 10/04/2016 | 1.8 |
| 10/04/2016 | 1.7 |
| 10/04/2016 | 1.7 |
| 10/04/2016 | 1.8 |
| 10/04/2016 | 1.8 |
| 10/04/2016 | 1.8 |
| 10/04/2016 | 2 |
| 10/04/2016 | 2.3 |
| 10/04/2016 | 2.4 |
| 10/04/2016 | 2.4 |
| 10/04/2016 | 2.4 |
| 10/04/2016 | 2.5 |
| 10/04/2016 | 2.4 |
| 10/04/2016 | 2.3 |
| 10/04/2016 | 2.2 |
| 10/04/2016 | 2.4 |
| 10/04/2016 | 2.4 |
| 10/04/2016 | 2.4 |
| 10/04/2016 | 2.4 |
| 10/04/2016 | 2.4 |
| 10/04/2016 | 2.2 |
| 10/04/2016 | 2 |
| 10/04/2016 | 1.9 |
| 11/04/2016 | 1.8 |
| 11/04/2016 | 1.8 |
| 11/04/2016 | 1.8 |
| 11/04/2016 | 1.9 |
| 11/04/2016 | 2.1 |
| 11/04/2016 | 2.4 |
| 11/04/2016 | 2.7 |
| 11/04/2016 | 2.9 |
| 11/04/2016 | 3 |
| 11/04/2016 | 3 |
| 11/04/2016 | 3 |
| 11/04/2016 | 3 |
| 11/04/2016 | 3 |
| 11/04/2016 | 3 |
| 11/04/2016 | 3 |
| 11/04/2016 | 3 |
| 11/04/2016 | 2.8 |
| 11/04/2016 | 2.9 |
| 11/04/2016 | 3 |
| 11/04/2016 | 2.8 |
| 11/04/2016 | 2.6 |
| 11/04/2016 | 2.4 |
| 11/04/2016 | 2.1 |
| 11/04/2016 | 2 |
| 12/04/2016 | 1.8 |
| 12/04/2016 | 1.8 |
| 12/04/2016 | 1.8 |
| 12/04/2016 | 1.9 |
| 12/04/2016 | 2.1 |
| 12/04/2016 | 2.4 |
| 12/04/2016 | 2.8 |
| 12/04/2016 | 2.9 |
| 12/04/2016 | 3 |
| 12/04/2016 | 3 |
| 12/04/2016 | 3.1 |
| 12/04/2016 | 3.1 |
| 12/04/2016 | 3.1 |
| 12/04/2016 | 3 |
| 12/04/2016 | 2.9 |
| 12/04/2016 | 3 |
| 12/04/2016 | 3 |
| 12/04/2016 | 3 |
| 12/04/2016 | 3.1 |
| 12/04/2016 | 2.9 |
| 12/04/2016 | 2.7 |
| 12/04/2016 | 2.4 |
| 12/04/2016 | 2.1 |
| 12/04/2016 | 2.1 |
| 13/04/2016 | 1.9 |
| 13/04/2016 | 1.8 |
| 13/04/2016 | 1.8 |
| 13/04/2016 | 2 |
| 13/04/2016 | 2.1 |
| 13/04/2016 | 2.5 |
| 13/04/2016 | 2.7 |
| 13/04/2016 | 3 |
| 13/04/2016 | 3 |
| 13/04/2016 | 3.1 |
| 13/04/2016 | 3.2 |
| 13/04/2016 | 3.2 |
| 13/04/2016 | 3.2 |
| 13/04/2016 | 3.1 |
| 13/04/2016 | 3 |
| 13/04/2016 | 3 |
| 13/04/2016 | 3 |
| 13/04/2016 | 2.9 |
| 13/04/2016 | 3 |
| 13/04/2016 | 3 |
| 13/04/2016 | 2.7 |
| 13/04/2016 | 2.3 |
| 13/04/2016 | 2.1 |
| 13/04/2016 | 2.1 |
| 14/04/2016 | 1.9 |
| 14/04/2016 | 1.8 |
| 14/04/2016 | 1.8 |
| 14/04/2016 | 2 |
| 14/04/2016 | 2.1 |
| 14/04/2016 | 2.4 |
| 14/04/2016 | 2.8 |
| 14/04/2016 | 2.9 |
| 14/04/2016 | 3 |
| 14/04/2016 | 3 |
| 14/04/2016 | 3.1 |
| 14/04/2016 | 3.1 |
| 14/04/2016 | 3.1 |
| 14/04/2016 | 2.9 |
| 14/04/2016 | 2.9 |
| 14/04/2016 | 2.9 |
| 14/04/2016 | 2.9 |
| 14/04/2016 | 3 |
| 14/04/2016 | 2.9 |
| 14/04/2016 | 2.9 |
| 14/04/2016 | 2.7 |
| 14/04/2016 | 2.4 |
| 14/04/2016 | 2.1 |
| 14/04/2016 | 2 |
| 15/04/2016 | 1.9 |
| 15/04/2016 | 1.8 |
| 15/04/2016 | 1.8 |
| 15/04/2016 | 1.9 |
| 15/04/2016 | 2.1 |
| 15/04/2016 | 2.4 |
| 15/04/2016 | 2.7 |
| 15/04/2016 | 2.8 |
| 15/04/2016 | 3 |
| 15/04/2016 | 3 |
| 15/04/2016 | 3 |
| 15/04/2016 | 3 |
| 15/04/2016 | 3.1 |
| 15/04/2016 | 3 |
| 15/04/2016 | 3 |
| 15/04/2016 | 3 |
| 15/04/2016 | 2.9 |
| 15/04/2016 | 2.9 |
| 15/04/2016 | 2.9 |
| 15/04/2016 | 2.7 |
| 15/04/2016 | 2.6 |
| 15/04/2016 | 2.3 |
| 15/04/2016 | 2.2 |
| 15/04/2016 | 1.9 |
| 16/04/2016 | 1.8 |
| 16/04/2016 | 1.8 |
| 16/04/2016 | 1.8 |
| 16/04/2016 | 1.9 |
| 16/04/2016 | 1.9 |
| 16/04/2016 | 2 |
| 16/04/2016 | 2.1 |
| 16/04/2016 | 2.3 |
| 16/04/2016 | 2.4 |
| 16/04/2016 | 2.6 |
| 16/04/2016 | 2.6 |
| 16/04/2016 | 2.6 |
| 16/04/2016 | 2.7 |
| 16/04/2016 | 2.5 |
| 16/04/2016 | 2.5 |
| 16/04/2016 | 2.4 |
| 16/04/2016 | 2.5 |
| 16/04/2016 | 2.5 |
| 16/04/2016 | 2.5 |
| 16/04/2016 | 2.5 |
| 16/04/2016 | 2.4 |
| 16/04/2016 | 2.2 |
| 16/04/2016 | 2.1 |
| 16/04/2016 | 2 |
| 17/04/2016 | 1.9 |
| 17/04/2016 | 1.8 |
| 17/04/2016 | 1.8 |
| 17/04/2016 | 1.8 |
| 17/04/2016 | 1.9 |
| 17/04/2016 | 1.8 |
| 17/04/2016 | 2 |
| 17/04/2016 | 2.1 |
| 17/04/2016 | 2.2 |
| 17/04/2016 | 2.3 |
| 17/04/2016 | 2.5 |
| 17/04/2016 | 2.5 |
| 17/04/2016 | 2.4 |
| 17/04/2016 | 2.4 |
| 17/04/2016 | 2.4 |
| 17/04/2016 | 2.4 |
| 17/04/2016 | 2.4 |
| 17/04/2016 | 2.4 |
| 17/04/2016 | 2.4 |
| 17/04/2016 | 2.4 |
| 17/04/2016 | 2.5 |
| 17/04/2016 | 2.3 |
| 17/04/2016 | 2.1 |
| 17/04/2016 | 2 |
| 18/04/2016 | 1.9 |
| 18/04/2016 | 1.9 |
| 18/04/2016 | 1.9 |
| 18/04/2016 | 1.9 |
| 18/04/2016 | 2.1 |
| 18/04/2016 | 2.4 |
| 18/04/2016 | 2.7 |
| 18/04/2016 | 3 |
| 18/04/2016 | 3 |
| 18/04/2016 | 3 |
| 18/04/2016 | 3 |
| 18/04/2016 | 3.1 |
| 18/04/2016 | 3.1 |
| 18/04/2016 | 3.1 |
| 18/04/2016 | 3 |
| 18/04/2016 | 3 |
| 18/04/2016 | 3 |
| 18/04/2016 | 3 |
| 18/04/2016 | 3 |
| 18/04/2016 | 2.9 |
| 18/04/2016 | 2.7 |
| 18/04/2016 | 2.4 |
| 18/04/2016 | 2.2 |
| 18/04/2016 | 1.9 |
| 19/04/2016 | 2 |
| 19/04/2016 | 1.9 |
| 19/04/2016 | 1.9 |
| 19/04/2016 | 1.9 |
| 19/04/2016 | 2.1 |
| 19/04/2016 | 2.5 |
| 19/04/2016 | 2.7 |
| 19/04/2016 | 3 |
| 19/04/2016 | 3 |
| 19/04/2016 | 3.1 |
| 19/04/2016 | 3.2 |
| 19/04/2016 | 3.2 |
| 19/04/2016 | 3 |
| 19/04/2016 | 3 |
| 19/04/2016 | 3 |
| 19/04/2016 | 3.1 |
| 19/04/2016 | 3 |
| 19/04/2016 | 3 |
| 19/04/2016 | 3 |
| 19/04/2016 | 3 |
| 19/04/2016 | 2.8 |
| 19/04/2016 | 2.4 |
| 19/04/2016 | 2.2 |
| 19/04/2016 | 2 |
| 20/04/2016 | 1.8 |
| 20/04/2016 | 1.8 |
| 20/04/2016 | 2 |
| 20/04/2016 | 1.9 |
| 20/04/2016 | 2.1 |
| 20/04/2016 | 2.6 |
| 20/04/2016 | 2.7 |
| 20/04/2016 | 3 |
| 20/04/2016 | 3.1 |
| 20/04/2016 | 3.2 |
| 20/04/2016 | 3.2 |
| 20/04/2016 | 3.2 |
| 20/04/2016 | 3.1 |
| 20/04/2016 | 3.1 |
| 20/04/2016 | 3.1 |
| 20/04/2016 | 3.1 |
| 20/04/2016 | 3 |
| 20/04/2016 | 3 |
| 20/04/2016 | 3 |
| 20/04/2016 | 3 |
| 20/04/2016 | 2.8 |
| 20/04/2016 | 2.4 |
| 20/04/2016 | 2.2 |
| 20/04/2016 | 2 |
| 21/04/2016 | 1.8 |
| 21/04/2016 | 1.8 |
| 21/04/2016 | 1.9 |
| 21/04/2016 | 1.9 |
| 21/04/2016 | 2.1 |
| 21/04/2016 | 2.5 |
| 21/04/2016 | 2.7 |
| 21/04/2016 | 3 |
| 21/04/2016 | 3 |
| 21/04/2016 | 3.1 |
| 21/04/2016 | 3 |
| 21/04/2016 | 3 |
| 21/04/2016 | 3 |
| 21/04/2016 | 3 |
| 21/04/2016 | 3 |
| 21/04/2016 | 3 |
| 21/04/2016 | 2.9 |
| 21/04/2016 | 2.9 |
| 21/04/2016 | 3 |
| 21/04/2016 | 2.9 |
| 21/04/2016 | 2.7 |
| 21/04/2016 | 2.4 |
| 21/04/2016 | 2.2 |
| 21/04/2016 | 2 |
| 22/04/2016 | 1.8 |
| 22/04/2016 | 1.8 |
| 22/04/2016 | 1.9 |
| 22/04/2016 | 1.9 |
| 22/04/2016 | 2.1 |
| 22/04/2016 | 2.4 |
| 22/04/2016 | 2.8 |
| 22/04/2016 | 2.9 |
| 22/04/2016 | 3 |
| 22/04/2016 | 3.1 |
| 22/04/2016 | 3.2 |
| 22/04/2016 | 3.2 |
| 22/04/2016 | 3.1 |
| 22/04/2016 | 3 |
| 22/04/2016 | 2.9 |
| 22/04/2016 | 3 |
| 22/04/2016 | 3 |
| 22/04/2016 | 2.9 |
| 22/04/2016 | 2.8 |
| 22/04/2016 | 2.7 |
| 22/04/2016 | 2.7 |
| 22/04/2016 | 2.4 |
| 22/04/2016 | 2.1 |
| 22/04/2016 | 1.9 |
| 23/04/2016 | 2 |
| 23/04/2016 | 1.9 |
| 23/04/2016 | 1.8 |
| 23/04/2016 | 1.8 |
| 23/04/2016 | 1.8 |
| 23/04/2016 | 1.9 |
| 23/04/2016 | 2.1 |
| 23/04/2016 | 2.2 |
| 23/04/2016 | 2.5 |
| 23/04/2016 | 2.5 |
| 23/04/2016 | 2.6 |
| 23/04/2016 | 2.7 |
| 23/04/2016 | 2.6 |
| 23/04/2016 | 2.5 |
| 23/04/2016 | 2.5 |
| 23/04/2016 | 2.4 |
| 23/04/2016 | 2.5 |
| 23/04/2016 | 2.5 |
| 23/04/2016 | 2.5 |
| 23/04/2016 | 2.5 |
| 23/04/2016 | 2.5 |
| 23/04/2016 | 2.2 |
| 23/04/2016 | 2.1 |
| 23/04/2016 | 2 |
| 24/04/2016 | 1.9 |
| 24/04/2016 | 1.9 |
| 24/04/2016 | 1.8 |
| 24/04/2016 | 1.8 |
| 24/04/2016 | 1.8 |
| 24/04/2016 | 1.9 |
| 24/04/2016 | 1.9 |
| 24/04/2016 | 2.1 |
| 24/04/2016 | 2.2 |
| 24/04/2016 | 2.3 |
| 24/04/2016 | 2.4 |
| 24/04/2016 | 2.5 |
| 24/04/2016 | 2.4 |
| 24/04/2016 | 2.4 |
| 24/04/2016 | 2.4 |
| 24/04/2016 | 2.4 |
| 24/04/2016 | 2.4 |
| 24/04/2016 | 2.4 |
| 24/04/2016 | 2.5 |
| 24/04/2016 | 2.4 |
| 24/04/2016 | 2.4 |
| 24/04/2016 | 2.3 |
| 24/04/2016 | 2.1 |
| 24/04/2016 | 2 |
| 25/04/2016 | 1.9 |
| 25/04/2016 | 1.9 |
| 25/04/2016 | 1.9 |
| 25/04/2016 | 1.8 |
| 25/04/2016 | 2.2 |
| 25/04/2016 | 2.5 |
| 25/04/2016 | 2.7 |
| 25/04/2016 | 2.9 |
| 25/04/2016 | 3 |
| 25/04/2016 | 3.1 |
| 25/04/2016 | 3 |
| 25/04/2016 | 3.1 |
| 25/04/2016 | 3.1 |
| 25/04/2016 | 3.1 |
| 25/04/2016 | 3.1 |
| 25/04/2016 | 3 |
| 25/04/2016 | 3 |
| 25/04/2016 | 2.9 |
| 25/04/2016 | 2.9 |
| 25/04/2016 | 2.9 |
| 25/04/2016 | 2.7 |
| 25/04/2016 | 2.4 |
| 25/04/2016 | 2.1 |
| 25/04/2016 | 2.1 |
| 26/04/2016 | 2 |
| 26/04/2016 | 1.9 |
| 26/04/2016 | 1.9 |
| 26/04/2016 | 2.1 |
| 26/04/2016 | 2.2 |
| 26/04/2016 | 2.4 |
| 26/04/2016 | 2.8 |
| 26/04/2016 | 2.9 |
| 26/04/2016 | 3 |
| 26/04/2016 | 3 |
| 26/04/2016 | 3.1 |
| 26/04/2016 | 3.2 |
| 26/04/2016 | 3 |
| 26/04/2016 | 3 |
| 26/04/2016 | 3 |
| 26/04/2016 | 3.1 |
| 26/04/2016 | 3 |
| 26/04/2016 | 3 |
| 26/04/2016 | 3 |
| 26/04/2016 | 3 |
| 26/04/2016 | 2.7 |
| 26/04/2016 | 2.4 |
| 26/04/2016 | 2.2 |
| 26/04/2016 | 2 |
| 27/04/2016 | 2 |
| 27/04/2016 | 2 |
| 27/04/2016 | 1.9 |
| 27/04/2016 | 1.9 |
| 27/04/2016 | 2.2 |
| 27/04/2016 | 2.5 |
| 27/04/2016 | 2.7 |
| 27/04/2016 | 3 |
| 27/04/2016 | 3 |
| 27/04/2016 | 3.2 |
| 27/04/2016 | 3.2 |
| 27/04/2016 | 3.2 |
| 27/04/2016 | 3.2 |
| 27/04/2016 | 3.1 |
| 27/04/2016 | 3.1 |
| 27/04/2016 | 3.1 |
| 27/04/2016 | 3 |
| 27/04/2016 | 3 |
| 27/04/2016 | 3 |
| 27/04/2016 | 3 |
| 27/04/2016 | 2.7 |
| 27/04/2016 | 2.4 |
| 27/04/2016 | 2.2 |
| 27/04/2016 | 2 |
| 28/04/2016 | 1.8 |
| 28/04/2016 | 2 |
| 28/04/2016 | 1.9 |
| 28/04/2016 | 1.9 |
| 28/04/2016 | 2.2 |
| 28/04/2016 | 2.4 |
| 28/04/2016 | 2.8 |
| 28/04/2016 | 2.9 |
| 28/04/2016 | 3 |
| 28/04/2016 | 3.1 |
| 28/04/2016 | 3 |
| 28/04/2016 | 3 |
| 28/04/2016 | 3 |
| 28/04/2016 | 3 |
| 28/04/2016 | 3 |
| 28/04/2016 | 2.9 |
| 28/04/2016 | 2.9 |
| 28/04/2016 | 3 |
| 28/04/2016 | 2.9 |
| 28/04/2016 | 2.9 |
| 28/04/2016 | 2.7 |
| 28/04/2016 | 2.4 |
| 28/04/2016 | 2.2 |
| 28/04/2016 | 2 |
| 29/04/2016 | 1.8 |
| 29/04/2016 | 2 |
| 29/04/2016 | 1.9 |
| 29/04/2016 | 1.9 |
| 29/04/2016 | 2.1 |
| 29/04/2016 | 2.4 |
| 29/04/2016 | 2.7 |
| 29/04/2016 | 2.9 |
| 29/04/2016 | 3 |
| 29/04/2016 | 3.1 |
| 29/04/2016 | 3.2 |
| 29/04/2016 | 3.2 |
| 29/04/2016 | 3.1 |
| 29/04/2016 | 3 |
| 29/04/2016 | 3 |
| 29/04/2016 | 3 |
| 29/04/2016 | 3 |
| 29/04/2016 | 2.7 |
| 29/04/2016 | 2.8 |
| 29/04/2016 | 2.7 |
| 29/04/2016 | 2.6 |
| 29/04/2016 | 2.4 |
| 29/04/2016 | 2.1 |
| 29/04/2016 | 2.1 |
| 30/04/2016 | 2 |
| 30/04/2016 | 1.9 |
| 30/04/2016 | 1.8 |
| 30/04/2016 | 1.8 |
| 30/04/2016 | 2 |
| 30/04/2016 | 2.1 |
| 30/04/2016 | 2.1 |
| 30/04/2016 | 2.4 |
| 30/04/2016 | 2.4 |
| 30/04/2016 | 2.5 |
| 30/04/2016 | 2.6 |
| 30/04/2016 | 2.7 |
| 30/04/2016 | 2.6 |
| 30/04/2016 | 2.5 |
| 30/04/2016 | 2.5 |
| 30/04/2016 | 2.4 |
| 30/04/2016 | 2.5 |
| 30/04/2016 | 2.5 |
| 30/04/2016 | 2.5 |
| 30/04/2016 | 2.5 |
| 30/04/2016 | 2.4 |
| 30/04/2016 | 2.2 |
| 30/04/2016 | 2.1 |
| 30/04/2016 | 2 |
| 01/05/2016 | 1.9 |
| 01/05/2016 | 1.9 |
| 01/05/2016 | 1.8 |
| 01/05/2016 | 1.8 |
| 01/05/2016 | 1.8 |
| 01/05/2016 | 1.9 |
| 01/05/2016 | 1.9 |
| 01/05/2016 | 2.1 |
| 01/05/2016 | 2.1 |
| 01/05/2016 | 2.4 |
| 01/05/2016 | 2.4 |
| 01/05/2016 | 2.5 |
| 01/05/2016 | 2.4 |
| 01/05/2016 | 2.4 |
| 01/05/2016 | 2.4 |
| 01/05/2016 | 2.4 |
| 01/05/2016 | 2.4 |
| 01/05/2016 | 2.4 |
| 01/05/2016 | 2.4 |
| 01/05/2016 | 2.5 |
| 01/05/2016 | 2.4 |
| 01/05/2016 | 2.3 |
| 01/05/2016 | 2.1 |
| 01/05/2016 | 2 |
| 02/05/2016 | 1.9 |
| 02/05/2016 | 1.9 |
| 02/05/2016 | 1.9 |
| 02/05/2016 | 2 |
| 02/05/2016 | 2.1 |
| 02/05/2016 | 2.4 |
| 02/05/2016 | 2.8 |
| 02/05/2016 | 2.9 |
| 02/05/2016 | 3 |
| 02/05/2016 | 3.1 |
| 02/05/2016 | 3 |
| 02/05/2016 | 3.1 |
| 02/05/2016 | 3.1 |
| 02/05/2016 | 3.1 |
| 02/05/2016 | 3 |
| 02/05/2016 | 3 |
| 02/05/2016 | 3 |
| 02/05/2016 | 2.9 |
| 02/05/2016 | 2.9 |
| 02/05/2016 | 2.7 |
| 02/05/2016 | 2.7 |
| 02/05/2016 | 2.4 |
| 02/05/2016 | 2.1 |
| 02/05/2016 | 2.1 |
| 03/05/2016 | 2 |
| 03/05/2016 | 1.9 |
| 03/05/2016 | 1.9 |
| 03/05/2016 | 2 |
| 03/05/2016 | 2.1 |
| 03/05/2016 | 2.4 |
| 03/05/2016 | 2.7 |
| 03/05/2016 | 3 |
| 03/05/2016 | 3 |
| 03/05/2016 | 3 |
| 03/05/2016 | 3.1 |
| 03/05/2016 | 3.2 |
| 03/05/2016 | 3 |
| 03/05/2016 | 3 |
| 03/05/2016 | 3 |
| 03/05/2016 | 3.1 |
| 03/05/2016 | 3 |
| 03/05/2016 | 3 |
| 03/05/2016 | 3 |
| 03/05/2016 | 2.8 |
| 03/05/2016 | 2.6 |
| 03/05/2016 | 2.4 |
| 03/05/2016 | 2.2 |
| 03/05/2016 | 2 |
| 04/05/2016 | 2 |
| 04/05/2016 | 2 |
| 04/05/2016 | 1.9 |
| 04/05/2016 | 2.1 |
| 04/05/2016 | 2.1 |
| 04/05/2016 | 2.4 |
| 04/05/2016 | 2.8 |
| 04/05/2016 | 3 |
| 04/05/2016 | 3 |
| 04/05/2016 | 3.2 |
| 04/05/2016 | 3.2 |
| 04/05/2016 | 3.2 |
| 04/05/2016 | 3.2 |
| 04/05/2016 | 3.1 |
| 04/05/2016 | 3.1 |
| 04/05/2016 | 3.1 |
| 04/05/2016 | 3 |
| 04/05/2016 | 2.9 |
| 04/05/2016 | 3 |
| 04/05/2016 | 2.8 |
| 04/05/2016 | 2.6 |
| 04/05/2016 | 2.4 |
| 04/05/2016 | 2.2 |
| 04/05/2016 | 2.1 |
| 05/05/2016 | 1.9 |
| 05/05/2016 | 1.8 |
| 05/05/2016 | 1.9 |
| 05/05/2016 | 1.9 |
| 05/05/2016 | 1.9 |
| 05/05/2016 | 1.9 |
| 05/05/2016 | 2 |
| 05/05/2016 | 2.1 |
| 05/05/2016 | 2.3 |
| 05/05/2016 | 2.4 |
| 05/05/2016 | 2.5 |
| 05/05/2016 | 2.6 |
| 05/05/2016 | 2.5 |
| 05/05/2016 | 2.4 |
| 05/05/2016 | 2.4 |
| 05/05/2016 | 2.4 |
| 05/05/2016 | 2.4 |
| 05/05/2016 | 2.4 |
| 05/05/2016 | 2.3 |
| 05/05/2016 | 2.4 |
| 05/05/2016 | 2.4 |
| 05/05/2016 | 2.2 |
| 05/05/2016 | 2.1 |
| 05/05/2016 | 2.1 |
| 06/05/2016 | 2 |
| 06/05/2016 | 2 |
| 06/05/2016 | 1.9 |
| 06/05/2016 | 1.9 |
| 06/05/2016 | 2.1 |
| 06/05/2016 | 2.1 |
| 06/05/2016 | 2.4 |
| 06/05/2016 | 2.4 |
| 06/05/2016 | 2.7 |
| 06/05/2016 | 2.7 |
| 06/05/2016 | 2.9 |
| 06/05/2016 | 2.9 |
| 06/05/2016 | 2.9 |
| 06/05/2016 | 2.7 |
| 06/05/2016 | 2.7 |
| 06/05/2016 | 2.7 |
| 06/05/2016 | 2.8 |
| 06/05/2016 | 2.8 |
| 06/05/2016 | 2.8 |
| 06/05/2016 | 2.7 |
| 06/05/2016 | 2.7 |
| 06/05/2016 | 2.5 |
| 06/05/2016 | 2.4 |
| 06/05/2016 | 2.1 |
| 07/05/2016 | 2 |
| 07/05/2016 | 1.9 |
| 07/05/2016 | 1.8 |
| 07/05/2016 | 1.8 |
| 07/05/2016 | 1.9 |
| 07/05/2016 | 2 |
| 07/05/2016 | 2.1 |
| 07/05/2016 | 2.3 |
| 07/05/2016 | 2.4 |
| 07/05/2016 | 2.5 |
| 07/05/2016 | 2.6 |
| 07/05/2016 | 2.7 |
| 07/05/2016 | 2.6 |
| 07/05/2016 | 2.5 |
| 07/05/2016 | 2.5 |
| 07/05/2016 | 2.4 |
| 07/05/2016 | 2.5 |
| 07/05/2016 | 2.4 |
| 07/05/2016 | 2.5 |
| 07/05/2016 | 2.5 |
| 07/05/2016 | 2.4 |
| 07/05/2016 | 2.2 |
| 07/05/2016 | 2.1 |
| 07/05/2016 | 2 |
| 08/05/2016 | 1.9 |
| 08/05/2016 | 1.9 |
| 08/05/2016 | 1.8 |
| 08/05/2016 | 1.8 |
| 08/05/2016 | 1.8 |
| 08/05/2016 | 1.8 |
| 08/05/2016 | 1.9 |
| 08/05/2016 | 2.1 |
| 08/05/2016 | 2.3 |
| 08/05/2016 | 2.4 |
| 08/05/2016 | 2.4 |
| 08/05/2016 | 2.5 |
| 08/05/2016 | 2.4 |
| 08/05/2016 | 2.4 |
| 08/05/2016 | 2.4 |
| 08/05/2016 | 2.4 |
| 08/05/2016 | 2.4 |
| 08/05/2016 | 2.4 |
| 08/05/2016 | 2.4 |
| 08/05/2016 | 2.4 |
| 08/05/2016 | 2.4 |
| 08/05/2016 | 2.3 |
| 08/05/2016 | 2.1 |
| 08/05/2016 | 2 |
| 09/05/2016 | 1.9 |
| 09/05/2016 | 1.9 |
| 09/05/2016 | 1.9 |
| 09/05/2016 | 2 |
| 09/05/2016 | 2.1 |
| 09/05/2016 | 2.4 |
| 09/05/2016 | 2.7 |
| 09/05/2016 | 3 |
| 09/05/2016 | 3 |
| 09/05/2016 | 3.1 |
| 09/05/2016 | 3 |
| 09/05/2016 | 3.1 |
| 09/05/2016 | 3.1 |
| 09/05/2016 | 3.1 |
| 09/05/2016 | 3 |
| 09/05/2016 | 3 |
| 09/05/2016 | 3 |
| 09/05/2016 | 3 |
| 09/05/2016 | 2.9 |
| 09/05/2016 | 2.7 |
| 09/05/2016 | 2.6 |
| 09/05/2016 | 2.4 |
| 09/05/2016 | 2.1 |
| 09/05/2016 | 2.1 |
| 10/05/2016 | 2 |
| 10/05/2016 | 1.9 |
| 10/05/2016 | 1.9 |
| 10/05/2016 | 2 |
| 10/05/2016 | 2.1 |
| 10/05/2016 | 2.5 |
| 10/05/2016 | 2.7 |
| 10/05/2016 | 3 |
| 10/05/2016 | 3.1 |
| 10/05/2016 | 3 |
| 10/05/2016 | 3.1 |
| 10/05/2016 | 3.2 |
| 10/05/2016 | 3 |
| 10/05/2016 | 3 |
| 10/05/2016 | 3 |
| 10/05/2016 | 3 |
| 10/05/2016 | 3 |
| 10/05/2016 | 2.9 |
| 10/05/2016 | 3 |
| 10/05/2016 | 2.8 |
| 10/05/2016 | 2.7 |
| 10/05/2016 | 2.4 |
| 10/05/2016 | 2.2 |
| 10/05/2016 | 2.1 |
| 11/05/2016 | 2 |
| 11/05/2016 | 2 |
| 11/05/2016 | 1.9 |
| 11/05/2016 | 2 |
| 11/05/2016 | 2.1 |
| 11/05/2016 | 2.4 |
| 11/05/2016 | 2.8 |
| 11/05/2016 | 3 |
| 11/05/2016 | 3.2 |
| 11/05/2016 | 3.2 |
| 11/05/2016 | 3.2 |
| 11/05/2016 | 3.2 |
| 11/05/2016 | 3.2 |
| 11/05/2016 | 3.1 |
| 11/05/2016 | 3.1 |
| 11/05/2016 | 3 |
| 11/05/2016 | 3 |
| 11/05/2016 | 2.9 |
| 11/05/2016 | 3 |
| 11/05/2016 | 2.8 |
| 11/05/2016 | 2.7 |
| 11/05/2016 | 2.4 |
| 11/05/2016 | 2.2 |
| 11/05/2016 | 2 |
| 12/05/2016 | 2 |
| 12/05/2016 | 1.9 |
| 12/05/2016 | 1.9 |
| 12/05/2016 | 2 |
| 12/05/2016 | 2.1 |
| 12/05/2016 | 2.5 |
| 12/05/2016 | 2.7 |
| 12/05/2016 | 3 |
| 12/05/2016 | 3.1 |
| 12/05/2016 | 3.1 |
| 12/05/2016 | 3.2 |
| 12/05/2016 | 3 |
| 12/05/2016 | 3 |
| 12/05/2016 | 3 |
| 12/05/2016 | 2.8 |
| 12/05/2016 | 2.8 |
| 12/05/2016 | 2.8 |
| 12/05/2016 | 2.8 |
| 12/05/2016 | 2.9 |
| 12/05/2016 | 2.7 |
| 12/05/2016 | 2.6 |
| 12/05/2016 | 2.4 |
| 12/05/2016 | 2.2 |
| 12/05/2016 | 2 |
| 13/05/2016 | 2 |
| 13/05/2016 | 1.9 |
| 13/05/2016 | 1.9 |
| 13/05/2016 | 2 |
| 13/05/2016 | 2.2 |
| 13/05/2016 | 2.4 |
| 13/05/2016 | 2.7 |
| 13/05/2016 | 3 |
| 13/05/2016 | 3.1 |
| 13/05/2016 | 3.1 |
| 13/05/2016 | 3.2 |
| 13/05/2016 | 3.2 |
| 13/05/2016 | 3.1 |
| 13/05/2016 | 3 |
| 13/05/2016 | 3 |
| 13/05/2016 | 2.9 |
| 13/05/2016 | 2.9 |
| 13/05/2016 | 2.8 |
| 13/05/2016 | 2.7 |
| 13/05/2016 | 2.6 |
| 13/05/2016 | 2.5 |
| 13/05/2016 | 2.4 |
| 13/05/2016 | 2.1 |
| 13/05/2016 | 2.1 |
| 14/05/2016 | 2 |
| 14/05/2016 | 1.9 |
| 14/05/2016 | 1.8 |
| 14/05/2016 | 1.8 |
| 14/05/2016 | 1.9 |
| 14/05/2016 | 2 |
| 14/05/2016 | 2.1 |
| 14/05/2016 | 2.3 |
| 14/05/2016 | 2.4 |
| 14/05/2016 | 2.5 |
| 14/05/2016 | 2.7 |
| 14/05/2016 | 2.7 |
| 14/05/2016 | 2.6 |
| 14/05/2016 | 2.5 |
| 14/05/2016 | 2.5 |
| 14/05/2016 | 2.4 |
| 14/05/2016 | 2.4 |
| 14/05/2016 | 2.4 |
| 14/05/2016 | 2.4 |
| 14/05/2016 | 2.4 |
| 14/05/2016 | 2.4 |
| 14/05/2016 | 2.2 |
| 14/05/2016 | 2.1 |
| 14/05/2016 | 2.2 |
| 15/05/2016 | 2 |
| 15/05/2016 | 1.9 |
| 15/05/2016 | 2 |
| 15/05/2016 | 1.9 |
| 15/05/2016 | 1.9 |
| 15/05/2016 | 1.9 |
| 15/05/2016 | 2.3 |
| 15/05/2016 | 2.4 |
| 15/05/2016 | 2.5 |
| 15/05/2016 | 2.5 |
| 15/05/2016 | 2.6 |
| 15/05/2016 | 2.7 |
| 15/05/2016 | 2.6 |
| 15/05/2016 | 2.5 |
| 15/05/2016 | 2.6 |
| 15/05/2016 | 2.6 |
| 15/05/2016 | 2.6 |
| 15/05/2016 | 2.6 |
| 15/05/2016 | 2.7 |
| 15/05/2016 | 2.8 |
| 15/05/2016 | 2.7 |
| 15/05/2016 | 2.6 |
| 15/05/2016 | 2.4 |
| 15/05/2016 | 2.2 |
| 16/05/2016 | 2.1 |
| 16/05/2016 | 1.9 |
| 16/05/2016 | 2 |
| 16/05/2016 | 1.9 |
| 16/05/2016 | 1.9 |
| 16/05/2016 | 2.1 |
| 16/05/2016 | 2.3 |
| 16/05/2016 | 2.4 |
| 16/05/2016 | 2.5 |
| 16/05/2016 | 2.5 |
| 16/05/2016 | 2.6 |
| 16/05/2016 | 2.7 |
| 16/05/2016 | 2.6 |
| 16/05/2016 | 2.5 |
| 16/05/2016 | 2.6 |
| 16/05/2016 | 2.6 |
| 16/05/2016 | 2.6 |
| 16/05/2016 | 2.6 |
| 16/05/2016 | 2.7 |
| 16/05/2016 | 2.8 |
| 16/05/2016 | 2.7 |
| 16/05/2016 | 2.6 |
| 16/05/2016 | 2.4 |
| 16/05/2016 | 2.1 |
| 17/05/2016 | 1.9 |
| 17/05/2016 | 1.9 |
| 17/05/2016 | 1.8 |
| 17/05/2016 | 1.9 |
| 17/05/2016 | 2.1 |
| 17/05/2016 | 2.4 |
| 17/05/2016 | 2.7 |
| 17/05/2016 | 2.9 |
| 17/05/2016 | 3 |
| 17/05/2016 | 3 |
| 17/05/2016 | 3.1 |
| 17/05/2016 | 3 |
| 17/05/2016 | 3 |
| 17/05/2016 | 2.9 |
| 17/05/2016 | 2.9 |
| 17/05/2016 | 2.8 |
| 17/05/2016 | 3 |
| 17/05/2016 | 3 |
| 17/05/2016 | 2.8 |
| 17/05/2016 | 2.7 |
| 17/05/2016 | 2.5 |
| 17/05/2016 | 2.4 |
| 17/05/2016 | 2.1 |
| 17/05/2016 | 2.1 |
| 18/05/2016 | 2 |
| 18/05/2016 | 1.9 |
| 18/05/2016 | 1.9 |
| 18/05/2016 | 2 |
| 18/05/2016 | 2.2 |
| 18/05/2016 | 2.5 |
| 18/05/2016 | 2.7 |
| 18/05/2016 | 3 |
| 18/05/2016 | 3.1 |
| 18/05/2016 | 3.1 |
| 18/05/2016 | 3.2 |
| 18/05/2016 | 3.2 |
| 18/05/2016 | 3.2 |
| 18/05/2016 | 3.1 |
| 18/05/2016 | 3.1 |
| 18/05/2016 | 2.9 |
| 18/05/2016 | 2.9 |
| 18/05/2016 | 2.9 |
| 18/05/2016 | 3 |
| 18/05/2016 | 2.8 |
| 18/05/2016 | 2.5 |
| 18/05/2016 | 2.4 |
| 18/05/2016 | 2.2 |
| 18/05/2016 | 2.1 |
| 19/05/2016 | 2 |
| 19/05/2016 | 1.9 |
| 19/05/2016 | 1.9 |
| 19/05/2016 | 2 |
| 19/05/2016 | 2.1 |
| 19/05/2016 | 2.5 |
| 19/05/2016 | 2.7 |
| 19/05/2016 | 3 |
| 19/05/2016 | 3 |
| 19/05/2016 | 3.1 |
| 19/05/2016 | 3.2 |
| 19/05/2016 | 3 |
| 19/05/2016 | 3.1 |
| 19/05/2016 | 3 |
| 19/05/2016 | 2.8 |
| 19/05/2016 | 2.8 |
| 19/05/2016 | 2.8 |
| 19/05/2016 | 2.8 |
| 19/05/2016 | 2.8 |
| 19/05/2016 | 2.7 |
| 19/05/2016 | 2.5 |
| 19/05/2016 | 2.4 |
| 19/05/2016 | 2.2 |
| 19/05/2016 | 2 |
| 20/05/2016 | 2 |
| 20/05/2016 | 1.9 |
| 20/05/2016 | 1.9 |
| 20/05/2016 | 2 |
| 20/05/2016 | 2.1 |
| 20/05/2016 | 2.4 |
| 20/05/2016 | 2.8 |
| 20/05/2016 | 2.9 |
| 20/05/2016 | 3.1 |
| 20/05/2016 | 3.1 |
| 20/05/2016 | 3.2 |
| 20/05/2016 | 3.2 |
| 20/05/2016 | 3.1 |
| 20/05/2016 | 3 |
| 20/05/2016 | 3 |
| 20/05/2016 | 2.9 |
| 20/05/2016 | 2.8 |
| 20/05/2016 | 2.8 |
| 20/05/2016 | 2.7 |
| 20/05/2016 | 2.6 |
| 20/05/2016 | 2.4 |
| 20/05/2016 | 2.4 |
| 20/05/2016 | 2.3 |
| 20/05/2016 | 2.1 |
| 21/05/2016 | 2 |
| 21/05/2016 | 1.9 |
| 21/05/2016 | 1.8 |
| 21/05/2016 | 1.9 |
| 21/05/2016 | 1.8 |
| 21/05/2016 | 2 |
| 21/05/2016 | 2.1 |
| 21/05/2016 | 2.3 |
| 21/05/2016 | 2.4 |
| 21/05/2016 | 2.7 |
| 21/05/2016 | 2.7 |
| 21/05/2016 | 2.7 |
| 21/05/2016 | 2.6 |
| 21/05/2016 | 2.5 |
| 21/05/2016 | 2.4 |
| 21/05/2016 | 2.4 |
| 21/05/2016 | 2.4 |
| 21/05/2016 | 2.4 |
| 21/05/2016 | 2.4 |
| 21/05/2016 | 2.4 |
| 21/05/2016 | 2.3 |
| 21/05/2016 | 2.2 |
| 21/05/2016 | 2.2 |
| 21/05/2016 | 2 |
| 22/05/2016 | 1.9 |
| 22/05/2016 | 1.8 |
| 22/05/2016 | 1.8 |
| 22/05/2016 | 1.9 |
| 22/05/2016 | 1.8 |
| 22/05/2016 | 2 |
| 22/05/2016 | 2 |
| 22/05/2016 | 2.1 |
| 22/05/2016 | 2.3 |
| 22/05/2016 | 2.4 |
| 22/05/2016 | 2.4 |
| 22/05/2016 | 2.5 |
| 22/05/2016 | 2.4 |
| 22/05/2016 | 2.4 |
| 22/05/2016 | 2.4 |
| 22/05/2016 | 2.4 |
| 22/05/2016 | 2.3 |
| 22/05/2016 | 2.4 |
| 22/05/2016 | 2.4 |
| 22/05/2016 | 2.4 |
| 22/05/2016 | 2.4 |
| 22/05/2016 | 2.3 |
| 22/05/2016 | 2.1 |
| 22/05/2016 | 2 |
| 23/05/2016 | 1.9 |
| 23/05/2016 | 1.8 |
| 23/05/2016 | 1.8 |
| 23/05/2016 | 1.9 |
| 23/05/2016 | 2.1 |
| 23/05/2016 | 2.5 |
| 23/05/2016 | 2.8 |
| 23/05/2016 | 3 |
| 23/05/2016 | 3 |
| 23/05/2016 | 3.1 |
| 23/05/2016 | 3.2 |
| 23/05/2016 | 3.1 |
| 23/05/2016 | 3.2 |
| 23/05/2016 | 3 |
| 23/05/2016 | 3 |
| 23/05/2016 | 2.9 |
| 23/05/2016 | 2.9 |
| 23/05/2016 | 2.8 |
| 23/05/2016 | 2.8 |
| 23/05/2016 | 2.7 |
| 23/05/2016 | 2.6 |
| 23/05/2016 | 2.4 |
| 23/05/2016 | 2.1 |
| 23/05/2016 | 2.1 |
| 24/05/2016 | 1.9 |
| 24/05/2016 | 1.9 |
| 24/05/2016 | 1.9 |
| 24/05/2016 | 2 |
| 24/05/2016 | 2.1 |
| 24/05/2016 | 2.4 |
| 24/05/2016 | 2.8 |
| 24/05/2016 | 2.9 |
| 24/05/2016 | 3 |
| 24/05/2016 | 3.2 |
| 24/05/2016 | 3.1 |
| 24/05/2016 | 3.2 |
| 24/05/2016 | 3 |
| 24/05/2016 | 3 |
| 24/05/2016 | 3 |
| 24/05/2016 | 2.9 |
| 24/05/2016 | 2.9 |
| 24/05/2016 | 3 |
| 24/05/2016 | 2.9 |
| 24/05/2016 | 2.8 |
| 24/05/2016 | 2.6 |
| 24/05/2016 | 2.5 |
| 24/05/2016 | 2.2 |
| 24/05/2016 | 2.1 |
| 25/05/2016 | 2 |
| 25/05/2016 | 1.9 |
| 25/05/2016 | 1.9 |
| 25/05/2016 | 2 |
| 25/05/2016 | 2.1 |
| 25/05/2016 | 2.5 |
| 25/05/2016 | 2.9 |
| 25/05/2016 | 3 |
| 25/05/2016 | 3.1 |
| 25/05/2016 | 3.1 |
| 25/05/2016 | 3.2 |
| 25/05/2016 | 3.2 |
| 25/05/2016 | 3.2 |
| 25/05/2016 | 3.1 |
| 25/05/2016 | 3 |
| 25/05/2016 | 2.9 |
| 25/05/2016 | 2.9 |
| 25/05/2016 | 2.9 |
| 25/05/2016 | 2.9 |
| 25/05/2016 | 2.8 |
| 25/05/2016 | 2.6 |
| 25/05/2016 | 2.4 |
| 25/05/2016 | 2.2 |
| 25/05/2016 | 2.1 |
| 26/05/2016 | 2 |
| 26/05/2016 | 1.9 |
| 26/05/2016 | 1.9 |
| 26/05/2016 | 2 |
| 26/05/2016 | 2.1 |
| 26/05/2016 | 2.4 |
| 26/05/2016 | 2.8 |
| 26/05/2016 | 2.9 |
| 26/05/2016 | 3 |
| 26/05/2016 | 3 |
| 26/05/2016 | 3.2 |
| 26/05/2016 | 3 |
| 26/05/2016 | 3.1 |
| 26/05/2016 | 3 |
| 26/05/2016 | 2.9 |
| 26/05/2016 | 2.8 |
| 26/05/2016 | 2.7 |
| 26/05/2016 | 2.8 |
| 26/05/2016 | 2.8 |
| 26/05/2016 | 2.7 |
| 26/05/2016 | 2.5 |
| 26/05/2016 | 2.4 |
| 26/05/2016 | 2.2 |
| 26/05/2016 | 2.1 |
| 27/05/2016 | 2 |
| 27/05/2016 | 1.9 |
| 27/05/2016 | 1.9 |
| 27/05/2016 | 2 |
| 27/05/2016 | 2.1 |
| 27/05/2016 | 2.4 |
| 27/05/2016 | 2.7 |
| 27/05/2016 | 3 |
| 27/05/2016 | 3 |
| 27/05/2016 | 3.1 |
| 27/05/2016 | 3.2 |
| 27/05/2016 | 3.2 |
| 27/05/2016 | 3.1 |
| 27/05/2016 | 3 |
| 27/05/2016 | 3 |
| 27/05/2016 | 2.9 |
| 27/05/2016 | 2.8 |
| 27/05/2016 | 2.8 |
| 27/05/2016 | 2.7 |
| 27/05/2016 | 2.7 |
| 27/05/2016 | 2.5 |
| 27/05/2016 | 2.4 |
| 27/05/2016 | 2.3 |
| 27/05/2016 | 2.1 |
| 28/05/2016 | 2 |
| 28/05/2016 | 1.9 |
| 28/05/2016 | 1.8 |
| 28/05/2016 | 1.9 |
| 28/05/2016 | 2 |
| 28/05/2016 | 1.9 |
| 28/05/2016 | 2.2 |
| 28/05/2016 | 2.2 |
| 28/05/2016 | 2.6 |
| 28/05/2016 | 2.7 |
| 28/05/2016 | 2.7 |
| 28/05/2016 | 2.7 |
| 28/05/2016 | 2.7 |
| 28/05/2016 | 2.5 |
| 28/05/2016 | 2.4 |
| 28/05/2016 | 2.4 |
| 28/05/2016 | 2.4 |
| 28/05/2016 | 2.4 |
| 28/05/2016 | 2.4 |
| 28/05/2016 | 2.4 |
| 28/05/2016 | 2.4 |
| 28/05/2016 | 2.4 |
| 28/05/2016 | 2.2 |
| 28/05/2016 | 2 |
| 29/05/2016 | 1.9 |
| 29/05/2016 | 1.8 |
| 29/05/2016 | 1.9 |
| 29/05/2016 | 1.9 |
| 29/05/2016 | 1.8 |
| 29/05/2016 | 1.9 |
| 29/05/2016 | 2 |
| 29/05/2016 | 2.1 |
| 29/05/2016 | 2.3 |
| 29/05/2016 | 2.4 |
| 29/05/2016 | 2.5 |
| 29/05/2016 | 2.5 |
| 29/05/2016 | 2.5 |
| 29/05/2016 | 2.4 |
| 29/05/2016 | 2.4 |
| 29/05/2016 | 2.4 |
| 29/05/2016 | 2.3 |
| 29/05/2016 | 2.4 |
| 29/05/2016 | 2.4 |
| 29/05/2016 | 2.4 |
| 29/05/2016 | 2.4 |
| 29/05/2016 | 2.3 |
| 29/05/2016 | 2.1 |
| 29/05/2016 | 2 |
| 30/05/2016 | 1.9 |
| 30/05/2016 | 1.9 |
| 30/05/2016 | 1.8 |
| 30/05/2016 | 1.9 |
| 30/05/2016 | 2.1 |
| 30/05/2016 | 2.5 |
| 30/05/2016 | 2.8 |
| 30/05/2016 | 2.9 |
| 30/05/2016 | 3 |
| 30/05/2016 | 3.1 |
| 30/05/2016 | 3.2 |
| 30/05/2016 | 3.1 |
| 30/05/2016 | 3.2 |
| 30/05/2016 | 3 |
| 30/05/2016 | 3 |
| 30/05/2016 | 3 |
| 30/05/2016 | 2.9 |
| 30/05/2016 | 2.8 |
| 30/05/2016 | 2.8 |
| 30/05/2016 | 2.7 |
| 30/05/2016 | 2.5 |
| 30/05/2016 | 2.4 |
| 30/05/2016 | 2.1 |
| 30/05/2016 | 2.1 |
| 31/05/2016 | 2 |
| 31/05/2016 | 1.9 |
| 31/05/2016 | 1.9 |
| 31/05/2016 | 2 |
| 31/05/2016 | 2.1 |
| 31/05/2016 | 2.4 |
| 31/05/2016 | 2.8 |
| 31/05/2016 | 3 |
| 31/05/2016 | 3 |
| 31/05/2016 | 3.2 |
| 31/05/2016 | 3.2 |
| 31/05/2016 | 3.2 |
| 31/05/2016 | 3.1 |
| 31/05/2016 | 3 |
| 31/05/2016 | 3 |
| 31/05/2016 | 3 |
| 31/05/2016 | 2.9 |
| 31/05/2016 | 3 |
| 31/05/2016 | 2.9 |
| 31/05/2016 | 2.8 |
| 31/05/2016 | 2.6 |
| 31/05/2016 | 2.5 |
| 31/05/2016 | 2.2 |
| 31/05/2016 | 2.1 |
| 01/06/2016 | 2 |
| 01/06/2016 | 2 |
| 01/06/2016 | 1.9 |
| 01/06/2016 | 2 |
| 01/06/2016 | 2.1 |
| 01/06/2016 | 2.5 |
| 01/06/2016 | 2.9 |
| 01/06/2016 | 3 |
| 01/06/2016 | 3.1 |
| 01/06/2016 | 3.2 |
| 01/06/2016 | 3.2 |
| 01/06/2016 | 3.2 |
| 01/06/2016 | 3.2 |
| 01/06/2016 | 3.2 |
| 01/06/2016 | 3.2 |
| 01/06/2016 | 3 |
| 01/06/2016 | 2.9 |
| 01/06/2016 | 3 |
| 01/06/2016 | 3 |
| 01/06/2016 | 2.8 |
| 01/06/2016 | 2.6 |
| 01/06/2016 | 2.4 |
| 01/06/2016 | 2.2 |
| 01/06/2016 | 2.1 |
| 02/06/2016 | 2 |
| 02/06/2016 | 2 |
| 02/06/2016 | 1.9 |
| 02/06/2016 | 2 |
| 02/06/2016 | 2.1 |
| 02/06/2016 | 2.4 |
| 02/06/2016 | 2.8 |
| 02/06/2016 | 3 |
| 02/06/2016 | 3 |
| 02/06/2016 | 3.1 |
| 02/06/2016 | 3.2 |
| 02/06/2016 | 3.1 |
| 02/06/2016 | 3.1 |
| 02/06/2016 | 3.1 |
| 02/06/2016 | 2.9 |
| 02/06/2016 | 2.9 |
| 02/06/2016 | 2.8 |
| 02/06/2016 | 2.9 |
| 02/06/2016 | 2.9 |
| 02/06/2016 | 2.7 |
| 02/06/2016 | 2.5 |
| 02/06/2016 | 2.4 |
| 02/06/2016 | 2.2 |
| 02/06/2016 | 2 |
| 03/06/2016 | 2 |
| 03/06/2016 | 2 |
| 03/06/2016 | 1.9 |
| 03/06/2016 | 2 |
| 03/06/2016 | 2.1 |
| 03/06/2016 | 2.4 |
| 03/06/2016 | 2.7 |
| 03/06/2016 | 2.9 |
| 03/06/2016 | 3.1 |
| 03/06/2016 | 3.1 |
| 03/06/2016 | 3.2 |
| 03/06/2016 | 3.2 |
| 03/06/2016 | 3.2 |
| 03/06/2016 | 3 |
| 03/06/2016 | 3 |
| 03/06/2016 | 3 |
| 03/06/2016 | 2.9 |
| 03/06/2016 | 2.9 |
| 03/06/2016 | 2.7 |
| 03/06/2016 | 2.7 |
| 03/06/2016 | 2.5 |
| 03/06/2016 | 2.4 |
| 03/06/2016 | 2.3 |
| 03/06/2016 | 2.1 |
| 04/06/2016 | 2 |
| 04/06/2016 | 1.9 |
| 04/06/2016 | 1.8 |
| 04/06/2016 | 1.9 |
| 04/06/2016 | 2 |
| 04/06/2016 | 1.9 |
| 04/06/2016 | 2.2 |
| 04/06/2016 | 2.3 |
| 04/06/2016 | 2.6 |
| 04/06/2016 | 2.7 |
| 04/06/2016 | 2.7 |
| 04/06/2016 | 2.7 |
| 04/06/2016 | 2.7 |
| 04/06/2016 | 2.6 |
| 04/06/2016 | 2.4 |
| 04/06/2016 | 2.4 |
| 04/06/2016 | 2.5 |
| 04/06/2016 | 2.5 |
| 04/06/2016 | 2.4 |
| 04/06/2016 | 2.5 |
| 04/06/2016 | 2.4 |
| 04/06/2016 | 2.4 |
| 04/06/2016 | 2.3 |
| 04/06/2016 | 2 |
| 05/06/2016 | 1.9 |
| 05/06/2016 | 1.9 |
| 05/06/2016 | 1.8 |
| 05/06/2016 | 1.9 |
| 05/06/2016 | 1.8 |
| 05/06/2016 | 1.9 |
| 05/06/2016 | 2 |
| 05/06/2016 | 2.1 |
| 05/06/2016 | 2.3 |
| 05/06/2016 | 2.4 |
| 05/06/2016 | 2.5 |
| 05/06/2016 | 2.5 |
| 05/06/2016 | 2.5 |
| 05/06/2016 | 2.4 |
| 05/06/2016 | 2.5 |
| 05/06/2016 | 2.4 |
| 05/06/2016 | 2.4 |
| 05/06/2016 | 2.4 |
| 05/06/2016 | 2.4 |
| 05/06/2016 | 2.4 |
| 05/06/2016 | 2.3 |
| 05/06/2016 | 2.3 |
| 05/06/2016 | 2.1 |
| 05/06/2016 | 2.1 |
| 06/06/2016 | 1.9 |
| 06/06/2016 | 1.9 |
| 06/06/2016 | 1.9 |
| 06/06/2016 | 1.9 |
| 06/06/2016 | 2.1 |
| 06/06/2016 | 2.5 |
| 06/06/2016 | 2.8 |
| 06/06/2016 | 3 |
| 06/06/2016 | 3.1 |
| 06/06/2016 | 3.1 |
| 06/06/2016 | 3.2 |
| 06/06/2016 | 3.2 |
| 06/06/2016 | 3.2 |
| 06/06/2016 | 3 |
| 06/06/2016 | 3 |
| 06/06/2016 | 3 |
| 06/06/2016 | 3 |
| 06/06/2016 | 3 |
| 06/06/2016 | 2.9 |
| 06/06/2016 | 2.7 |
| 06/06/2016 | 2.7 |
| 06/06/2016 | 2.5 |
| 06/06/2016 | 2.2 |
| 06/06/2016 | 2.1 |
| 07/06/2016 | 2 |
| 07/06/2016 | 1.9 |
| 07/06/2016 | 1.9 |
| 07/06/2016 | 2 |
| 07/06/2016 | 2.1 |
| 07/06/2016 | 2.4 |
| 07/06/2016 | 2.8 |
| 07/06/2016 | 3 |
| 07/06/2016 | 3 |
| 07/06/2016 | 3.2 |
| 07/06/2016 | 3.2 |
| 07/06/2016 | 3.2 |
| 07/06/2016 | 3.2 |
| 07/06/2016 | 3.1 |
| 07/06/2016 | 3.1 |
| 07/06/2016 | 3 |
| 07/06/2016 | 3 |
| 07/06/2016 | 3 |
| 07/06/2016 | 3 |
| 07/06/2016 | 2.8 |
| 07/06/2016 | 2.6 |
| 07/06/2016 | 2.5 |
| 07/06/2016 | 2.3 |
| 07/06/2016 | 2.2 |
| 08/06/2016 | 2.1 |
| 08/06/2016 | 2 |
| 08/06/2016 | 1.9 |
| 08/06/2016 | 2 |
| 08/06/2016 | 2.1 |
| 08/06/2016 | 2.5 |
| 08/06/2016 | 2.9 |
| 08/06/2016 | 3 |
| 08/06/2016 | 3.2 |
| 08/06/2016 | 3.2 |
| 08/06/2016 | 3.3 |
| 08/06/2016 | 3.3 |
| 08/06/2016 | 3.2 |
| 08/06/2016 | 3.2 |
| 08/06/2016 | 3.2 |
| 08/06/2016 | 3 |
| 08/06/2016 | 3 |
| 08/06/2016 | 3 |
| 08/06/2016 | 3 |
| 08/06/2016 | 2.8 |
| 08/06/2016 | 2.6 |
| 08/06/2016 | 2.6 |
| 08/06/2016 | 2.3 |
| 08/06/2016 | 2.2 |
| 09/06/2016 | 2.1 |
| 09/06/2016 | 2 |
| 09/06/2016 | 1.9 |
| 09/06/2016 | 2 |
| 09/06/2016 | 2.1 |
| 09/06/2016 | 2.4 |
| 09/06/2016 | 2.8 |
| 09/06/2016 | 3 |
| 09/06/2016 | 3.1 |
| 09/06/2016 | 3.1 |
| 09/06/2016 | 3.2 |
| 09/06/2016 | 3.1 |
| 09/06/2016 | 3.2 |
| 09/06/2016 | 3.1 |
| 09/06/2016 | 3 |
| 09/06/2016 | 3 |
| 09/06/2016 | 2.9 |
| 09/06/2016 | 2.9 |
| 09/06/2016 | 2.9 |
| 09/06/2016 | 2.7 |
| 09/06/2016 | 2.5 |
| 09/06/2016 | 2.5 |
| 09/06/2016 | 2.3 |
| 09/06/2016 | 2.1 |
| 10/06/2016 | 2.1 |
| 10/06/2016 | 2 |
| 10/06/2016 | 1.9 |
| 10/06/2016 | 2 |
| 10/06/2016 | 2.1 |
| 10/06/2016 | 2.4 |
| 10/06/2016 | 2.7 |
| 10/06/2016 | 2.9 |
| 10/06/2016 | 3.1 |
| 10/06/2016 | 3.1 |
| 10/06/2016 | 3.2 |
| 10/06/2016 | 3.2 |
| 10/06/2016 | 3.2 |
| 10/06/2016 | 3.1 |
| 10/06/2016 | 3 |
| 10/06/2016 | 3 |
| 10/06/2016 | 3 |
| 10/06/2016 | 2.9 |
| 10/06/2016 | 2.8 |
| 10/06/2016 | 2.7 |
| 10/06/2016 | 2.5 |
| 10/06/2016 | 2.4 |
| 10/06/2016 | 2.4 |
| 10/06/2016 | 2.1 |
| 11/06/2016 | 2 |
| 11/06/2016 | 1.9 |
| 11/06/2016 | 1.8 |
| 11/06/2016 | 2 |
| 11/06/2016 | 2 |
| 11/06/2016 | 1.9 |
| 11/06/2016 | 2.1 |
| 11/06/2016 | 2.3 |
| 11/06/2016 | 2.6 |
| 11/06/2016 | 2.7 |
| 11/06/2016 | 2.8 |
| 11/06/2016 | 2.8 |
| 11/06/2016 | 2.7 |
| 11/06/2016 | 2.7 |
| 11/06/2016 | 2.7 |
| 11/06/2016 | 2.5 |
| 11/06/2016 | 2.5 |
| 11/06/2016 | 2.5 |
| 11/06/2016 | 2.7 |
| 11/06/2016 | 2.5 |
| 11/06/2016 | 2.4 |
| 11/06/2016 | 2.4 |
| 11/06/2016 | 2.3 |
| 11/06/2016 | 2.1 |
| 12/06/2016 | 2 |
| 12/06/2016 | 1.9 |
| 12/06/2016 | 1.8 |
| 12/06/2016 | 1.9 |
| 12/06/2016 | 1.8 |
| 12/06/2016 | 1.8 |
| 12/06/2016 | 2 |
| 12/06/2016 | 2.1 |
| 12/06/2016 | 2.3 |
| 12/06/2016 | 2.4 |
| 12/06/2016 | 2.5 |
| 12/06/2016 | 2.6 |
| 12/06/2016 | 2.5 |
| 12/06/2016 | 2.5 |
| 12/06/2016 | 2.5 |
| 12/06/2016 | 2.4 |
| 12/06/2016 | 2.4 |
| 12/06/2016 | 2.5 |
| 12/06/2016 | 2.4 |
| 12/06/2016 | 2.4 |
| 12/06/2016 | 2.3 |
| 12/06/2016 | 2.4 |
| 12/06/2016 | 2.2 |
| 12/06/2016 | 2.1 |
| 13/06/2016 | 2 |
| 13/06/2016 | 1.9 |
| 13/06/2016 | 1.9 |
| 13/06/2016 | 2 |
| 13/06/2016 | 2.1 |
| 13/06/2016 | 2.5 |
| 13/06/2016 | 2.7 |
| 13/06/2016 | 3 |
| 13/06/2016 | 3.1 |
| 13/06/2016 | 3.2 |
| 13/06/2016 | 3.2 |
| 13/06/2016 | 3.2 |
| 13/06/2016 | 3.2 |
| 13/06/2016 | 3.1 |
| 13/06/2016 | 3.1 |
| 13/06/2016 | 3.1 |
| 13/06/2016 | 3 |
| 13/06/2016 | 3 |
| 13/06/2016 | 3 |
| 13/06/2016 | 2.7 |
| 13/06/2016 | 2.7 |
| 13/06/2016 | 2.5 |
| 13/06/2016 | 2.3 |
| 13/06/2016 | 2.2 |
| 14/06/2016 | 2 |
| 14/06/2016 | 2 |
| 14/06/2016 | 1.9 |
| 14/06/2016 | 2 |
| 14/06/2016 | 2.1 |
| 14/06/2016 | 2.4 |
| 14/06/2016 | 2.8 |
| 14/06/2016 | 3 |
| 14/06/2016 | 3.1 |
| 14/06/2016 | 3.2 |
| 14/06/2016 | 3.2 |
| 14/06/2016 | 3.2 |
| 14/06/2016 | 3.2 |
| 14/06/2016 | 3.2 |
| 14/06/2016 | 3.2 |
| 14/06/2016 | 3.1 |
| 14/06/2016 | 3 |
| 14/06/2016 | 3 |
| 14/06/2016 | 3 |
| 14/06/2016 | 2.9 |
| 14/06/2016 | 2.7 |
| 14/06/2016 | 2.6 |
| 14/06/2016 | 2.3 |
| 14/06/2016 | 2.3 |
| 15/06/2016 | 2.1 |
| 15/06/2016 | 2 |
| 15/06/2016 | 2 |
| 15/06/2016 | 2 |
| 15/06/2016 | 2.1 |
| 15/06/2016 | 2.5 |
| 15/06/2016 | 2.9 |
| 15/06/2016 | 3 |
| 15/06/2016 | 3.2 |
| 15/06/2016 | 3.2 |
| 15/06/2016 | 3.3 |
| 15/06/2016 | 3.4 |
| 15/06/2016 | 3.3 |
| 15/06/2016 | 3.2 |
| 15/06/2016 | 3.2 |
| 15/06/2016 | 3.1 |
| 15/06/2016 | 3 |
| 15/06/2016 | 3 |
| 15/06/2016 | 3 |
| 15/06/2016 | 2.9 |
| 15/06/2016 | 2.7 |
| 15/06/2016 | 2.6 |
| 15/06/2016 | 2.4 |
| 15/06/2016 | 2.1 |
| 16/06/2016 | 2.1 |
| 16/06/2016 | 2 |
| 16/06/2016 | 2 |
| 16/06/2016 | 2 |
| 16/06/2016 | 2.1 |
| 16/06/2016 | 2.4 |
| 16/06/2016 | 2.8 |
| 16/06/2016 | 3 |
| 16/06/2016 | 3.1 |
| 16/06/2016 | 3.1 |
| 16/06/2016 | 3.2 |
| 16/06/2016 | 3.2 |
| 16/06/2016 | 3.2 |
| 16/06/2016 | 3.2 |
| 16/06/2016 | 3 |
| 16/06/2016 | 3 |
| 16/06/2016 | 3 |
| 16/06/2016 | 3 |
| 16/06/2016 | 2.9 |
| 16/06/2016 | 2.8 |
| 16/06/2016 | 2.7 |
| 16/06/2016 | 2.6 |
| 16/06/2016 | 2.4 |
| 16/06/2016 | 2.1 |
| 17/06/2016 | 2.1 |
| 17/06/2016 | 2 |
| 17/06/2016 | 2 |
| 17/06/2016 | 2 |
| 17/06/2016 | 2.1 |
| 17/06/2016 | 2.4 |
| 17/06/2016 | 2.7 |
| 17/06/2016 | 3 |
| 17/06/2016 | 3.1 |
| 17/06/2016 | 3.3 |
| 17/06/2016 | 3.2 |
| 17/06/2016 | 3.2 |
| 17/06/2016 | 3.2 |
| 17/06/2016 | 3.2 |
| 17/06/2016 | 3.1 |
| 17/06/2016 | 3.1 |
| 17/06/2016 | 3 |
| 17/06/2016 | 3 |
| 17/06/2016 | 3 |
| 17/06/2016 | 2.7 |
| 17/06/2016 | 2.7 |
| 17/06/2016 | 2.5 |
| 17/06/2016 | 2.4 |
| 17/06/2016 | 2.2 |
| 18/06/2016 | 2.1 |
| 18/06/2016 | 2 |
| 18/06/2016 | 1.8 |
| 18/06/2016 | 2 |
| 18/06/2016 | 2 |
| 18/06/2016 | 2 |
| 18/06/2016 | 2.1 |
| 18/06/2016 | 2.3 |
| 18/06/2016 | 2.6 |
| 18/06/2016 | 2.7 |
| 18/06/2016 | 2.8 |
| 18/06/2016 | 2.8 |
| 18/06/2016 | 2.7 |
| 18/06/2016 | 2.7 |
| 18/06/2016 | 2.7 |
| 18/06/2016 | 2.6 |
| 18/06/2016 | 2.6 |
| 18/06/2016 | 2.6 |
| 18/06/2016 | 2.7 |
| 18/06/2016 | 2.6 |
| 18/06/2016 | 2.4 |
| 18/06/2016 | 2.4 |
| 18/06/2016 | 2.4 |
| 18/06/2016 | 2.1 |
| 19/06/2016 | 2 |
| 19/06/2016 | 1.9 |
| 19/06/2016 | 1.8 |
| 19/06/2016 | 1.9 |
| 19/06/2016 | 1.8 |
| 19/06/2016 | 1.8 |
| 19/06/2016 | 2 |
| 19/06/2016 | 2.1 |
| 19/06/2016 | 2.3 |
| 19/06/2016 | 2.5 |
| 19/06/2016 | 2.6 |
| 19/06/2016 | 2.6 |
| 19/06/2016 | 2.6 |
| 19/06/2016 | 2.5 |
| 19/06/2016 | 2.6 |
| 19/06/2016 | 2.5 |
| 19/06/2016 | 2.5 |
| 19/06/2016 | 2.5 |
| 19/06/2016 | 2.5 |
| 19/06/2016 | 2.4 |
| 19/06/2016 | 2.4 |
| 19/06/2016 | 2.4 |
| 19/06/2016 | 2.2 |
| 19/06/2016 | 2.1 |
| 20/06/2016 | 2 |
| 20/06/2016 | 2 |
| 20/06/2016 | 1.9 |
| 20/06/2016 | 2 |
| 20/06/2016 | 2.1 |
| 20/06/2016 | 2.5 |
| 20/06/2016 | 2.7 |
| 20/06/2016 | 3 |
| 20/06/2016 | 3.1 |
| 20/06/2016 | 3.2 |
| 20/06/2016 | 3.3 |
| 20/06/2016 | 3.2 |
| 20/06/2016 | 3.3 |
| 20/06/2016 | 3.2 |
| 20/06/2016 | 3.2 |
| 20/06/2016 | 3.2 |
| 20/06/2016 | 3.1 |
| 20/06/2016 | 3.1 |
| 20/06/2016 | 3.1 |
| 20/06/2016 | 2.8 |
| 20/06/2016 | 2.7 |
| 20/06/2016 | 2.5 |
| 20/06/2016 | 2.3 |
| 20/06/2016 | 2.2 |
| 21/06/2016 | 2.1 |
| 21/06/2016 | 2 |
| 21/06/2016 | 1.9 |
| 21/06/2016 | 2 |
| 21/06/2016 | 2.1 |
| 21/06/2016 | 2.4 |
| 21/06/2016 | 2.8 |
| 21/06/2016 | 3 |
| 21/06/2016 | 3.1 |
| 21/06/2016 | 3.2 |
| 21/06/2016 | 3.2 |
| 21/06/2016 | 3.3 |
| 21/06/2016 | 3.2 |
| 21/06/2016 | 3.2 |
| 21/06/2016 | 3.2 |
| 21/06/2016 | 3.2 |
| 21/06/2016 | 3.1 |
| 21/06/2016 | 3 |
| 21/06/2016 | 3.2 |
| 21/06/2016 | 2.9 |
| 21/06/2016 | 2.7 |
| 21/06/2016 | 2.6 |
| 21/06/2016 | 2.4 |
| 21/06/2016 | 2.3 |
| 22/06/2016 | 2.1 |
| 22/06/2016 | 2.1 |
| 22/06/2016 | 2 |
| 22/06/2016 | 2 |
| 22/06/2016 | 2.1 |
| 22/06/2016 | 2.5 |
| 22/06/2016 | 2.7 |
| 22/06/2016 | 3 |
| 22/06/2016 | 3.2 |
| 22/06/2016 | 3.4 |
| 22/06/2016 | 3.4 |
| 22/06/2016 | 3.5 |
| 22/06/2016 | 3.3 |
| 22/06/2016 | 3.3 |
| 22/06/2016 | 3.3 |
| 22/06/2016 | 3.2 |
| 22/06/2016 | 3.1 |
| 22/06/2016 | 3 |
| 22/06/2016 | 3.2 |
| 22/06/2016 | 2.9 |
| 22/06/2016 | 2.7 |
| 22/06/2016 | 2.6 |
| 22/06/2016 | 2.4 |
| 22/06/2016 | 2.1 |
| 23/06/2016 | 2.1 |
| 23/06/2016 | 2.1 |
| 23/06/2016 | 2 |
| 23/06/2016 | 2 |
| 23/06/2016 | 2.1 |
| 23/06/2016 | 2.5 |
| 23/06/2016 | 2.7 |
| 23/06/2016 | 3 |
| 23/06/2016 | 3.1 |
| 23/06/2016 | 3.2 |
| 23/06/2016 | 3.3 |
| 23/06/2016 | 3.2 |
| 23/06/2016 | 3.2 |
| 23/06/2016 | 3.2 |
| 23/06/2016 | 3.1 |
| 23/06/2016 | 3.1 |
| 23/06/2016 | 3 |
| 23/06/2016 | 3 |
| 23/06/2016 | 3 |
| 23/06/2016 | 2.8 |
| 23/06/2016 | 2.7 |
| 23/06/2016 | 2.6 |
| 23/06/2016 | 2.4 |
| 23/06/2016 | 2.1 |
| 24/06/2016 | 2.1 |
| 24/06/2016 | 2.1 |
| 24/06/2016 | 2 |
| 24/06/2016 | 2 |
| 24/06/2016 | 2.1 |
| 24/06/2016 | 2.4 |
| 24/06/2016 | 2.7 |
| 24/06/2016 | 3 |
| 24/06/2016 | 3.1 |
| 24/06/2016 | 3.3 |
| 24/06/2016 | 3.3 |
| 24/06/2016 | 3.3 |
| 24/06/2016 | 3.2 |
| 24/06/2016 | 3.2 |
| 24/06/2016 | 3.2 |
| 24/06/2016 | 3.2 |
| 24/06/2016 | 3.1 |
| 24/06/2016 | 3 |
| 24/06/2016 | 3 |
| 24/06/2016 | 2.8 |
| 24/06/2016 | 2.7 |
| 24/06/2016 | 2.5 |
| 24/06/2016 | 2.4 |
| 24/06/2016 | 2.2 |
| 25/06/2016 | 2.1 |
| 25/06/2016 | 2 |
| 25/06/2016 | 1.9 |
| 25/06/2016 | 2 |
| 25/06/2016 | 1.8 |
| 25/06/2016 | 2 |
| 25/06/2016 | 2.1 |
| 25/06/2016 | 2.3 |
| 25/06/2016 | 2.6 |
| 25/06/2016 | 2.7 |
| 25/06/2016 | 2.8 |
| 25/06/2016 | 2.9 |
| 25/06/2016 | 2.8 |
| 25/06/2016 | 2.7 |
| 25/06/2016 | 2.7 |
| 25/06/2016 | 2.7 |
| 25/06/2016 | 2.7 |
| 25/06/2016 | 2.6 |
| 25/06/2016 | 2.7 |
| 25/06/2016 | 2.6 |
| 25/06/2016 | 2.5 |
| 25/06/2016 | 2.4 |
| 25/06/2016 | 2.4 |
| 25/06/2016 | 2.1 |
| 26/06/2016 | 2.1 |
| 26/06/2016 | 2 |
| 26/06/2016 | 1.8 |
| 26/06/2016 | 1.9 |
| 26/06/2016 | 1.8 |
| 26/06/2016 | 1.8 |
| 26/06/2016 | 2 |
| 26/06/2016 | 2.1 |
| 26/06/2016 | 2.3 |
| 26/06/2016 | 2.5 |
| 26/06/2016 | 2.6 |
| 26/06/2016 | 2.6 |
| 26/06/2016 | 2.6 |
| 26/06/2016 | 2.6 |
| 26/06/2016 | 2.6 |
| 26/06/2016 | 2.6 |
| 26/06/2016 | 2.5 |
| 26/06/2016 | 2.5 |
| 26/06/2016 | 2.5 |
| 26/06/2016 | 2.4 |
| 26/06/2016 | 2.4 |
| 26/06/2016 | 2.4 |
| 26/06/2016 | 2.3 |
| 26/06/2016 | 2.1 |
| 27/06/2016 | 2 |
| 27/06/2016 | 2 |
| 27/06/2016 | 1.9 |
| 27/06/2016 | 2 |
| 27/06/2016 | 2.1 |
| 27/06/2016 | 2.4 |
| 27/06/2016 | 2.7 |
| 27/06/2016 | 3 |
| 27/06/2016 | 3.1 |
| 27/06/2016 | 3.2 |
| 27/06/2016 | 3.3 |
| 27/06/2016 | 3.2 |
| 27/06/2016 | 3.3 |
| 27/06/2016 | 3.4 |
| 27/06/2016 | 3.2 |
| 27/06/2016 | 3.2 |
| 27/06/2016 | 3.2 |
| 27/06/2016 | 3.1 |
| 27/06/2016 | 3.1 |
| 27/06/2016 | 2.8 |
| 27/06/2016 | 2.8 |
| 27/06/2016 | 2.6 |
| 27/06/2016 | 2.4 |
| 27/06/2016 | 2.3 |
| 28/06/2016 | 2.1 |
| 28/06/2016 | 2 |
| 28/06/2016 | 2 |
| 28/06/2016 | 2 |
| 28/06/2016 | 2.1 |
| 28/06/2016 | 2.5 |
| 28/06/2016 | 2.8 |
| 28/06/2016 | 3 |
| 28/06/2016 | 3.1 |
| 28/06/2016 | 3.3 |
| 28/06/2016 | 3.3 |
| 28/06/2016 | 3.3 |
| 28/06/2016 | 3.2 |
| 28/06/2016 | 3.2 |
| 28/06/2016 | 3.3 |
| 28/06/2016 | 3.3 |
| 28/06/2016 | 3.2 |
| 28/06/2016 | 3.2 |
| 28/06/2016 | 3.2 |
| 28/06/2016 | 3 |
| 28/06/2016 | 2.7 |
| 28/06/2016 | 2.6 |
| 28/06/2016 | 2.4 |
| 28/06/2016 | 2.4 |
| 29/06/2016 | 2.1 |
| 29/06/2016 | 2.1 |
| 29/06/2016 | 2 |
| 29/06/2016 | 2.1 |
| 29/06/2016 | 2.2 |
| 29/06/2016 | 2.5 |
| 29/06/2016 | 2.7 |
| 29/06/2016 | 3 |
| 29/06/2016 | 3.2 |
| 29/06/2016 | 3.4 |
| 29/06/2016 | 3.4 |
| 29/06/2016 | 3.5 |
| 29/06/2016 | 3.4 |
| 29/06/2016 | 3.4 |
| 29/06/2016 | 3.4 |
| 29/06/2016 | 3.4 |
| 29/06/2016 | 3.2 |
| 29/06/2016 | 3.1 |
| 29/06/2016 | 3.2 |
| 29/06/2016 | 3 |
| 29/06/2016 | 2.7 |
| 29/06/2016 | 2.7 |
| 29/06/2016 | 2.4 |
| 29/06/2016 | 2.2 |
| 30/06/2016 | 2.1 |
| 30/06/2016 | 2.1 |
| 30/06/2016 | 2 |
| 30/06/2016 | 2.1 |
| 30/06/2016 | 2.1 |
| 30/06/2016 | 2.5 |
| 30/06/2016 | 2.7 |
| 30/06/2016 | 3 |
| 30/06/2016 | 3.1 |
| 30/06/2016 | 3.2 |
| 30/06/2016 | 3.3 |
| 30/06/2016 | 3.2 |
| 30/06/2016 | 3.3 |
| 30/06/2016 | 3.2 |
| 30/06/2016 | 3.2 |
| 30/06/2016 | 3.1 |
| 30/06/2016 | 3.1 |
| 30/06/2016 | 3 |
| 30/06/2016 | 3.1 |
| 30/06/2016 | 2.9 |
| 30/06/2016 | 2.7 |
| 30/06/2016 | 2.7 |
| 30/06/2016 | 2.4 |
| 30/06/2016 | 2.2 |
| 01/07/2016 | 2.1 |
| 01/07/2016 | 2.1 |
| 01/07/2016 | 2 |
| 01/07/2016 | 2 |
| 01/07/2016 | 2.1 |
| 01/07/2016 | 2.4 |
| 01/07/2016 | 2.7 |
| 01/07/2016 | 3 |
| 01/07/2016 | 3.2 |
| 01/07/2016 | 3.3 |
| 01/07/2016 | 3.3 |
| 01/07/2016 | 3.3 |
| 01/07/2016 | 3.3 |
| 01/07/2016 | 3.2 |
| 01/07/2016 | 3.2 |
| 01/07/2016 | 3.2 |
| 01/07/2016 | 3.2 |
| 01/07/2016 | 3 |
| 01/07/2016 | 3 |
| 01/07/2016 | 2.8 |
| 01/07/2016 | 2.7 |
| 01/07/2016 | 2.6 |
| 01/07/2016 | 2.5 |
| 01/07/2016 | 2.3 |
| 02/07/2016 | 2.1 |
| 02/07/2016 | 2 |
| 02/07/2016 | 1.9 |
| 02/07/2016 | 2 |
| 02/07/2016 | 1.8 |
| 02/07/2016 | 2 |
| 02/07/2016 | 2.1 |
| 02/07/2016 | 2.3 |
| 02/07/2016 | 2.7 |
| 02/07/2016 | 2.8 |
| 02/07/2016 | 2.9 |
| 02/07/2016 | 2.9 |
| 02/07/2016 | 2.8 |
| 02/07/2016 | 2.7 |
| 02/07/2016 | 2.8 |
| 02/07/2016 | 2.7 |
| 02/07/2016 | 2.7 |
| 02/07/2016 | 2.7 |
| 02/07/2016 | 2.7 |
| 02/07/2016 | 2.7 |
| 02/07/2016 | 2.5 |
| 02/07/2016 | 2.5 |
| 02/07/2016 | 2.4 |
| 02/07/2016 | 2.1 |
| 03/07/2016 | 2.1 |
| 03/07/2016 | 2 |
| 03/07/2016 | 1.9 |
| 03/07/2016 | 1.9 |
| 03/07/2016 | 1.8 |
| 03/07/2016 | 1.8 |
| 03/07/2016 | 2 |
| 03/07/2016 | 2.1 |
| 03/07/2016 | 2.3 |
| 03/07/2016 | 2.5 |
| 03/07/2016 | 2.6 |
| 03/07/2016 | 2.6 |
| 03/07/2016 | 2.7 |
| 03/07/2016 | 2.6 |
| 03/07/2016 | 2.7 |
| 03/07/2016 | 2.6 |
| 03/07/2016 | 2.6 |
| 03/07/2016 | 2.6 |
| 03/07/2016 | 2.5 |
| 03/07/2016 | 2.5 |
| 03/07/2016 | 2.4 |
| 03/07/2016 | 2.4 |
| 03/07/2016 | 2.3 |
| 03/07/2016 | 2.1 |
| 04/07/2016 | 2.1 |
| 04/07/2016 | 2 |
| 04/07/2016 | 1.9 |
| 04/07/2016 | 2 |
| 04/07/2016 | 2.1 |
| 04/07/2016 | 2.4 |
| 04/07/2016 | 2.7 |
| 04/07/2016 | 3 |
| 04/07/2016 | 3.1 |
| 04/07/2016 | 3.2 |
| 04/07/2016 | 3.3 |
| 04/07/2016 | 3.2 |
| 04/07/2016 | 3.4 |
| 04/07/2016 | 3.4 |
| 04/07/2016 | 3.2 |
| 04/07/2016 | 3.2 |
| 04/07/2016 | 3.2 |
| 04/07/2016 | 3.1 |
| 04/07/2016 | 3.1 |
| 04/07/2016 | 2.9 |
| 04/07/2016 | 2.8 |
| 04/07/2016 | 2.6 |
| 04/07/2016 | 2.4 |
| 04/07/2016 | 2.3 |
| 05/07/2016 | 2.1 |
| 05/07/2016 | 2 |
| 05/07/2016 | 2 |
| 05/07/2016 | 2 |
| 05/07/2016 | 2.1 |
| 05/07/2016 | 2.5 |
| 05/07/2016 | 2.8 |
| 05/07/2016 | 3 |
| 05/07/2016 | 3.1 |
| 05/07/2016 | 3.2 |
| 05/07/2016 | 3.2 |
| 05/07/2016 | 3.3 |
| 05/07/2016 | 3.2 |
| 05/07/2016 | 3.2 |
| 05/07/2016 | 3.3 |
| 05/07/2016 | 3.3 |
| 05/07/2016 | 3.2 |
| 05/07/2016 | 3.2 |
| 05/07/2016 | 3.2 |
| 05/07/2016 | 3 |
| 05/07/2016 | 2.7 |
| 05/07/2016 | 2.6 |
| 05/07/2016 | 2.4 |
| 05/07/2016 | 2.1 |
| 06/07/2016 | 2.1 |
| 06/07/2016 | 2.1 |
| 06/07/2016 | 2 |
| 06/07/2016 | 2.1 |
| 06/07/2016 | 2.2 |
| 06/07/2016 | 2.5 |
| 06/07/2016 | 2.7 |
| 06/07/2016 | 3 |
| 06/07/2016 | 3.2 |
| 06/07/2016 | 3.4 |
| 06/07/2016 | 3.4 |
| 06/07/2016 | 3.5 |
| 06/07/2016 | 3.3 |
| 06/07/2016 | 3.3 |
| 06/07/2016 | 3.3 |
| 06/07/2016 | 3.3 |
| 06/07/2016 | 3.2 |
| 06/07/2016 | 3.1 |
| 06/07/2016 | 3.2 |
| 06/07/2016 | 3 |
| 06/07/2016 | 2.7 |
| 06/07/2016 | 2.7 |
| 06/07/2016 | 2.4 |
| 06/07/2016 | 2.1 |
| 07/07/2016 | 2.1 |
| 07/07/2016 | 2.1 |
| 07/07/2016 | 2 |
| 07/07/2016 | 2.1 |
| 07/07/2016 | 2.2 |
| 07/07/2016 | 2.5 |
| 07/07/2016 | 2.7 |
| 07/07/2016 | 3 |
| 07/07/2016 | 3.1 |
| 07/07/2016 | 3.2 |
| 07/07/2016 | 3.2 |
| 07/07/2016 | 3.2 |
| 07/07/2016 | 3.2 |
| 07/07/2016 | 3.2 |
| 07/07/2016 | 3.2 |
| 07/07/2016 | 3.1 |
| 07/07/2016 | 3 |
| 07/07/2016 | 3 |
| 07/07/2016 | 3.1 |
| 07/07/2016 | 2.9 |
| 07/07/2016 | 2.7 |
| 07/07/2016 | 2.6 |
| 07/07/2016 | 2.4 |
| 07/07/2016 | 2.1 |
| 08/07/2016 | 2.1 |
| 08/07/2016 | 2.1 |
| 08/07/2016 | 2 |
| 08/07/2016 | 2 |
| 08/07/2016 | 2.1 |
| 08/07/2016 | 2.4 |
| 08/07/2016 | 2.7 |
| 08/07/2016 | 2.9 |
| 08/07/2016 | 3.1 |
| 08/07/2016 | 3.3 |
| 08/07/2016 | 3.2 |
| 08/07/2016 | 3.3 |
| 08/07/2016 | 3.2 |
| 08/07/2016 | 3.2 |
| 08/07/2016 | 3.2 |
| 08/07/2016 | 3.2 |
| 08/07/2016 | 3.1 |
| 08/07/2016 | 3 |
| 08/07/2016 | 3 |
| 08/07/2016 | 2.8 |
| 08/07/2016 | 2.7 |
| 08/07/2016 | 2.5 |
| 08/07/2016 | 2.4 |
| 08/07/2016 | 2.2 |
| 09/07/2016 | 2.1 |
| 09/07/2016 | 2 |
| 09/07/2016 | 1.9 |
| 09/07/2016 | 1.8 |
| 09/07/2016 | 1.8 |
| 09/07/2016 | 2 |
| 09/07/2016 | 2.1 |
| 09/07/2016 | 2.3 |
| 09/07/2016 | 2.6 |
| 09/07/2016 | 2.7 |
| 09/07/2016 | 2.8 |
| 09/07/2016 | 2.8 |
| 09/07/2016 | 2.7 |
| 09/07/2016 | 2.7 |
| 09/07/2016 | 2.7 |
| 09/07/2016 | 2.7 |
| 09/07/2016 | 2.7 |
| 09/07/2016 | 2.7 |
| 09/07/2016 | 2.7 |
| 09/07/2016 | 2.7 |
| 09/07/2016 | 2.6 |
| 09/07/2016 | 2.4 |
| 09/07/2016 | 2.4 |
| 09/07/2016 | 2.1 |
| 10/07/2016 | 2.1 |
| 10/07/2016 | 2 |
| 10/07/2016 | 1.8 |
| 10/07/2016 | 1.8 |
| 10/07/2016 | 1.9 |
| 10/07/2016 | 1.8 |
| 10/07/2016 | 2 |
| 10/07/2016 | 2.1 |
| 10/07/2016 | 2.3 |
| 10/07/2016 | 2.4 |
| 10/07/2016 | 2.5 |
| 10/07/2016 | 2.6 |
| 10/07/2016 | 2.6 |
| 10/07/2016 | 2.5 |
| 10/07/2016 | 2.6 |
| 10/07/2016 | 2.6 |
| 10/07/2016 | 2.5 |
| 10/07/2016 | 2.5 |
| 10/07/2016 | 2.6 |
| 10/07/2016 | 2.5 |
| 10/07/2016 | 2.5 |
| 10/07/2016 | 2.4 |
| 10/07/2016 | 2.4 |
| 10/07/2016 | 2.1 |
| 11/07/2016 | 2 |
| 11/07/2016 | 2 |
| 11/07/2016 | 1.9 |
| 11/07/2016 | 2 |
| 11/07/2016 | 2.2 |
| 11/07/2016 | 2.5 |
| 11/07/2016 | 2.7 |
| 11/07/2016 | 3 |
| 11/07/2016 | 3.1 |
| 11/07/2016 | 3.1 |
| 11/07/2016 | 3.2 |
| 11/07/2016 | 3.2 |
| 11/07/2016 | 3.3 |
| 11/07/2016 | 3.3 |
| 11/07/2016 | 3.2 |
| 11/07/2016 | 3.2 |
| 11/07/2016 | 3.2 |
| 11/07/2016 | 3.1 |
| 11/07/2016 | 3 |
| 11/07/2016 | 2.8 |
| 11/07/2016 | 2.7 |
| 11/07/2016 | 2.5 |
| 11/07/2016 | 2.4 |
| 11/07/2016 | 2.2 |
| 12/07/2016 | 2.1 |
| 12/07/2016 | 2 |
| 12/07/2016 | 2 |
| 12/07/2016 | 2 |
| 12/07/2016 | 2.2 |
| 12/07/2016 | 2.5 |
| 12/07/2016 | 2.8 |
| 12/07/2016 | 3 |
| 12/07/2016 | 3 |
| 12/07/2016 | 3.2 |
| 12/07/2016 | 3.2 |
| 12/07/2016 | 3.2 |
| 12/07/2016 | 3.2 |
| 12/07/2016 | 3.2 |
| 12/07/2016 | 3.2 |
| 12/07/2016 | 3.3 |
| 12/07/2016 | 3.1 |
| 12/07/2016 | 3.2 |
| 12/07/2016 | 3.1 |
| 12/07/2016 | 3 |
| 12/07/2016 | 2.8 |
| 12/07/2016 | 2.6 |
| 12/07/2016 | 2.3 |
| 12/07/2016 | 2.3 |
| 13/07/2016 | 2.1 |
| 13/07/2016 | 2.1 |
| 13/07/2016 | 2 |
| 13/07/2016 | 2.1 |
| 13/07/2016 | 2.2 |
| 13/07/2016 | 2.5 |
| 13/07/2016 | 2.9 |
| 13/07/2016 | 3 |
| 13/07/2016 | 3.1 |
| 13/07/2016 | 3.3 |
| 13/07/2016 | 3.3 |
| 13/07/2016 | 3.4 |
| 13/07/2016 | 3.3 |
| 13/07/2016 | 3.3 |
| 13/07/2016 | 3.3 |
| 13/07/2016 | 3.3 |
| 13/07/2016 | 3.1 |
| 13/07/2016 | 3.2 |
| 13/07/2016 | 3.1 |
| 13/07/2016 | 3 |
| 13/07/2016 | 2.8 |
| 13/07/2016 | 2.6 |
| 13/07/2016 | 2.4 |
| 13/07/2016 | 2.1 |
| 14/07/2016 | 2.1 |
| 14/07/2016 | 2.1 |
| 14/07/2016 | 2 |
| 14/07/2016 | 2.1 |
| 14/07/2016 | 2.2 |
| 14/07/2016 | 2.5 |
| 14/07/2016 | 2.8 |
| 14/07/2016 | 2.9 |
| 14/07/2016 | 3 |
| 14/07/2016 | 3.2 |
| 14/07/2016 | 3.2 |
| 14/07/2016 | 3.1 |
| 14/07/2016 | 3.2 |
| 14/07/2016 | 3.2 |
| 14/07/2016 | 3.2 |
| 14/07/2016 | 3 |
| 14/07/2016 | 3 |
| 14/07/2016 | 3.1 |
| 14/07/2016 | 3 |
| 14/07/2016 | 2.9 |
| 14/07/2016 | 2.7 |
| 14/07/2016 | 2.5 |
| 14/07/2016 | 2.3 |
| 14/07/2016 | 2.1 |
| 15/07/2016 | 2.1 |
| 15/07/2016 | 2.1 |
| 15/07/2016 | 2 |
| 15/07/2016 | 2.1 |
| 15/07/2016 | 2.2 |
| 15/07/2016 | 2.4 |
| 15/07/2016 | 2.7 |
| 15/07/2016 | 3 |
| 15/07/2016 | 3 |
| 15/07/2016 | 3.2 |
| 15/07/2016 | 3.2 |
| 15/07/2016 | 3.2 |
| 15/07/2016 | 3.2 |
| 15/07/2016 | 3.2 |
| 15/07/2016 | 3.1 |
| 15/07/2016 | 3.1 |
| 15/07/2016 | 3 |
| 15/07/2016 | 2.9 |
| 15/07/2016 | 3 |
| 15/07/2016 | 2.8 |
| 15/07/2016 | 2.6 |
| 15/07/2016 | 2.4 |
| 15/07/2016 | 2.4 |
| 15/07/2016 | 2.1 |
| 16/07/2016 | 2.1 |
| 16/07/2016 | 2 |
| 16/07/2016 | 1.9 |
| 16/07/2016 | 1.8 |
| 16/07/2016 | 1.9 |
| 16/07/2016 | 2 |
| 16/07/2016 | 2.2 |
| 16/07/2016 | 2.2 |
| 16/07/2016 | 2.6 |
| 16/07/2016 | 2.7 |
| 16/07/2016 | 2.7 |
| 16/07/2016 | 2.7 |
| 16/07/2016 | 2.7 |
| 16/07/2016 | 2.7 |
| 16/07/2016 | 2.7 |
| 16/07/2016 | 2.6 |
| 16/07/2016 | 2.6 |
| 16/07/2016 | 2.7 |
| 16/07/2016 | 2.6 |
| 16/07/2016 | 2.4 |
| 16/07/2016 | 2.4 |
| 16/07/2016 | 2.4 |
| 16/07/2016 | 2.3 |
| 16/07/2016 | 2.1 |
| 17/07/2016 | 2 |
| 17/07/2016 | 2 |
| 17/07/2016 | 1.8 |
| 17/07/2016 | 1.8 |
| 17/07/2016 | 1.9 |
| 17/07/2016 | 1.8 |
| 17/07/2016 | 2 |
| 17/07/2016 | 2.1 |
| 17/07/2016 | 2.2 |
| 17/07/2016 | 2.4 |
| 17/07/2016 | 2.5 |
| 17/07/2016 | 2.5 |
| 17/07/2016 | 2.5 |
| 17/07/2016 | 2.5 |
| 17/07/2016 | 2.6 |
| 17/07/2016 | 2.5 |
| 17/07/2016 | 2.4 |
| 17/07/2016 | 2.4 |
| 17/07/2016 | 2.6 |
| 17/07/2016 | 2.4 |
| 17/07/2016 | 2.4 |
| 17/07/2016 | 2.3 |
| 17/07/2016 | 2.3 |
| 17/07/2016 | 2.1 |
| 18/07/2016 | 2 |
| 18/07/2016 | 2 |
| 18/07/2016 | 1.9 |
| 18/07/2016 | 2 |
| 18/07/2016 | 2.1 |
| 18/07/2016 | 2.5 |
| 18/07/2016 | 2.8 |
| 18/07/2016 | 2.9 |
| 18/07/2016 | 3 |
| 18/07/2016 | 3 |
| 18/07/2016 | 3.2 |
| 18/07/2016 | 3.2 |
| 18/07/2016 | 3.2 |
| 18/07/2016 | 3.2 |
| 18/07/2016 | 3.2 |
| 18/07/2016 | 3.1 |
| 18/07/2016 | 3.1 |
| 18/07/2016 | 3 |
| 18/07/2016 | 3 |
| 18/07/2016 | 2.8 |
| 18/07/2016 | 2.7 |
| 18/07/2016 | 2.4 |
| 18/07/2016 | 2.4 |
| 18/07/2016 | 2.2 |
| 19/07/2016 | 2.1 |
| 19/07/2016 | 2 |
| 19/07/2016 | 2 |
| 19/07/2016 | 2.1 |
| 19/07/2016 | 2.2 |
| 19/07/2016 | 2.5 |
| 19/07/2016 | 2.8 |
| 19/07/2016 | 3 |
| 19/07/2016 | 3 |
| 19/07/2016 | 3.2 |
| 19/07/2016 | 3.1 |
| 19/07/2016 | 3.2 |
| 19/07/2016 | 3.1 |
| 19/07/2016 | 3.2 |
| 19/07/2016 | 3.2 |
| 19/07/2016 | 3.2 |
| 19/07/2016 | 3 |
| 19/07/2016 | 3.1 |
| 19/07/2016 | 3 |
| 19/07/2016 | 2.9 |
| 19/07/2016 | 2.7 |
| 19/07/2016 | 2.5 |
| 19/07/2016 | 2.3 |
| 19/07/2016 | 2.2 |
| 20/07/2016 | 2.1 |
| 20/07/2016 | 2 |
| 20/07/2016 | 2 |
| 20/07/2016 | 2.1 |
| 20/07/2016 | 2.1 |
| 20/07/2016 | 2.4 |
| 20/07/2016 | 2.7 |
| 20/07/2016 | 2.9 |
| 20/07/2016 | 3.1 |
| 20/07/2016 | 3.2 |
| 20/07/2016 | 3.2 |
| 20/07/2016 | 3.1 |
| 20/07/2016 | 3.2 |
| 20/07/2016 | 3.1 |
| 20/07/2016 | 3.1 |
| 20/07/2016 | 3.1 |
| 20/07/2016 | 3.1 |
| 20/07/2016 | 3 |
| 20/07/2016 | 3 |
| 20/07/2016 | 2.8 |
| 20/07/2016 | 2.6 |
| 20/07/2016 | 2.4 |
| 20/07/2016 | 2.2 |
| 20/07/2016 | 2.1 |
| 21/07/2016 | 2.1 |
| 21/07/2016 | 2 |
| 21/07/2016 | 2 |
| 21/07/2016 | 2 |
| 21/07/2016 | 2.1 |
| 21/07/2016 | 2.4 |
| 21/07/2016 | 2.7 |
| 21/07/2016 | 2.8 |
| 21/07/2016 | 3 |
| 21/07/2016 | 3.2 |
| 21/07/2016 | 3.2 |
| 21/07/2016 | 3 |
| 21/07/2016 | 3 |
| 21/07/2016 | 3 |
| 21/07/2016 | 3 |
| 21/07/2016 | 2.9 |
| 21/07/2016 | 3 |
| 21/07/2016 | 2.9 |
| 21/07/2016 | 2.8 |
| 21/07/2016 | 2.6 |
| 21/07/2016 | 2.6 |
| 21/07/2016 | 2.4 |
| 21/07/2016 | 2.2 |
| 21/07/2016 | 2.1 |
| 22/07/2016 | 2.1 |
| 22/07/2016 | 2 |
| 22/07/2016 | 2 |
| 22/07/2016 | 2 |
| 22/07/2016 | 2.1 |
| 22/07/2016 | 2.3 |
| 22/07/2016 | 2.7 |
| 22/07/2016 | 2.8 |
| 22/07/2016 | 3 |
| 22/07/2016 | 3.2 |
| 22/07/2016 | 3.1 |
| 22/07/2016 | 3.1 |
| 22/07/2016 | 3.1 |
| 22/07/2016 | 3 |
| 22/07/2016 | 3 |
| 22/07/2016 | 3 |
| 22/07/2016 | 2.9 |
| 22/07/2016 | 2.9 |
| 22/07/2016 | 2.7 |
| 22/07/2016 | 2.5 |
| 22/07/2016 | 2.5 |
| 22/07/2016 | 2.3 |
| 22/07/2016 | 2.3 |
| 22/07/2016 | 2.1 |
| 23/07/2016 | 2.1 |
| 23/07/2016 | 2 |
| 23/07/2016 | 1.8 |
| 23/07/2016 | 2 |
| 23/07/2016 | 2 |
| 23/07/2016 | 1.9 |
| 23/07/2016 | 2.1 |
| 23/07/2016 | 2.2 |
| 23/07/2016 | 2.4 |
| 23/07/2016 | 2.6 |
| 23/07/2016 | 2.6 |
| 23/07/2016 | 2.6 |
| 23/07/2016 | 2.4 |
| 23/07/2016 | 2.5 |
| 23/07/2016 | 2.4 |
| 23/07/2016 | 2.4 |
| 23/07/2016 | 2.5 |
| 23/07/2016 | 2.5 |
| 23/07/2016 | 2.5 |
| 23/07/2016 | 2.4 |
| 23/07/2016 | 2.3 |
| 23/07/2016 | 2.3 |
| 23/07/2016 | 2.2 |
| 23/07/2016 | 2 |
| 24/07/2016 | 2 |
| 24/07/2016 | 1.9 |
| 24/07/2016 | 1.8 |
| 24/07/2016 | 1.9 |
| 24/07/2016 | 1.8 |
| 24/07/2016 | 1.8 |
| 24/07/2016 | 1.8 |
| 24/07/2016 | 2 |
| 24/07/2016 | 2.2 |
| 24/07/2016 | 2.4 |
| 24/07/2016 | 2.4 |
| 24/07/2016 | 2.4 |
| 24/07/2016 | 2.4 |
| 24/07/2016 | 2.4 |
| 24/07/2016 | 2.4 |
| 24/07/2016 | 2.4 |
| 24/07/2016 | 2.4 |
| 24/07/2016 | 2.4 |
| 24/07/2016 | 2.3 |
| 24/07/2016 | 2.4 |
| 24/07/2016 | 2.4 |
| 24/07/2016 | 2.3 |
| 24/07/2016 | 2.2 |
| 24/07/2016 | 2.1 |
| 25/07/2016 | 2 |
| 25/07/2016 | 1.9 |
| 25/07/2016 | 1.9 |
| 25/07/2016 | 2 |
| 25/07/2016 | 2.1 |
| 25/07/2016 | 2.4 |
| 25/07/2016 | 2.7 |
| 25/07/2016 | 2.8 |
| 25/07/2016 | 3 |
| 25/07/2016 | 3 |
| 25/07/2016 | 3.1 |
| 25/07/2016 | 3 |
| 25/07/2016 | 3.1 |
| 25/07/2016 | 3 |
| 25/07/2016 | 3 |
| 25/07/2016 | 3 |
| 25/07/2016 | 2.9 |
| 25/07/2016 | 2.9 |
| 25/07/2016 | 2.8 |
| 25/07/2016 | 2.7 |
| 25/07/2016 | 2.6 |
| 25/07/2016 | 2.3 |
| 25/07/2016 | 2.3 |
| 25/07/2016 | 2.1 |
| 26/07/2016 | 2 |
| 26/07/2016 | 2 |
| 26/07/2016 | 1.9 |
| 26/07/2016 | 2 |
| 26/07/2016 | 2.1 |
| 26/07/2016 | 2.4 |
| 26/07/2016 | 2.7 |
| 26/07/2016 | 3 |
| 26/07/2016 | 3 |
| 26/07/2016 | 3.1 |
| 26/07/2016 | 3 |
| 26/07/2016 | 3.1 |
| 26/07/2016 | 3 |
| 26/07/2016 | 3 |
| 26/07/2016 | 3 |
| 26/07/2016 | 3 |
| 26/07/2016 | 3 |
| 26/07/2016 | 3 |
| 26/07/2016 | 2.9 |
| 26/07/2016 | 2.7 |
| 26/07/2016 | 2.7 |
| 26/07/2016 | 2.4 |
| 26/07/2016 | 2.3 |
| 26/07/2016 | 2.2 |
| 27/07/2016 | 2.1 |
| 27/07/2016 | 2 |
| 27/07/2016 | 2 |
| 27/07/2016 | 2.1 |
| 27/07/2016 | 2.2 |
| 27/07/2016 | 2.4 |
| 27/07/2016 | 2.7 |
| 27/07/2016 | 2.9 |
| 27/07/2016 | 3.1 |
| 27/07/2016 | 3.2 |
| 27/07/2016 | 3.2 |
| 27/07/2016 | 3 |
| 27/07/2016 | 3.1 |
| 27/07/2016 | 3 |
| 27/07/2016 | 3 |
| 27/07/2016 | 3 |
| 27/07/2016 | 3 |
| 27/07/2016 | 3 |
| 27/07/2016 | 2.9 |
| 27/07/2016 | 2.7 |
| 27/07/2016 | 2.7 |
| 27/07/2016 | 2.4 |
| 27/07/2016 | 2.1 |
| 27/07/2016 | 2.1 |
| 28/07/2016 | 2.1 |
| 28/07/2016 | 2 |
| 28/07/2016 | 2 |
| 28/07/2016 | 2.1 |
| 28/07/2016 | 2.1 |
| 28/07/2016 | 2.4 |
| 28/07/2016 | 2.7 |
| 28/07/2016 | 2.8 |
| 28/07/2016 | 3 |
| 28/07/2016 | 3.1 |
| 28/07/2016 | 3.1 |
| 28/07/2016 | 3 |
| 28/07/2016 | 3 |
| 28/07/2016 | 3 |
| 28/07/2016 | 3 |
| 28/07/2016 | 2.8 |
| 28/07/2016 | 2.9 |
| 28/07/2016 | 2.8 |
| 28/07/2016 | 2.7 |
| 28/07/2016 | 2.6 |
| 28/07/2016 | 2.4 |
| 28/07/2016 | 2.4 |
| 28/07/2016 | 2.1 |
| 28/07/2016 | 2 |
| 29/07/2016 | 2.1 |
| 29/07/2016 | 2 |
| 29/07/2016 | 1.9 |
| 29/07/2016 | 2 |
| 29/07/2016 | 2.1 |
| 29/07/2016 | 2.3 |
| 29/07/2016 | 2.6 |
| 29/07/2016 | 2.9 |
| 29/07/2016 | 3 |
| 29/07/2016 | 3.1 |
| 29/07/2016 | 3 |
| 29/07/2016 | 3 |
| 29/07/2016 | 3 |
| 29/07/2016 | 2.9 |
| 29/07/2016 | 2.9 |
| 29/07/2016 | 2.9 |
| 29/07/2016 | 2.8 |
| 29/07/2016 | 2.8 |
| 29/07/2016 | 2.7 |
| 29/07/2016 | 2.5 |
| 29/07/2016 | 2.4 |
| 29/07/2016 | 2.3 |
| 29/07/2016 | 2.2 |
| 29/07/2016 | 2.1 |
| 30/07/2016 | 2 |
| 30/07/2016 | 2 |
| 30/07/2016 | 1.8 |
| 30/07/2016 | 1.8 |
| 30/07/2016 | 1.8 |
| 30/07/2016 | 1.9 |
| 30/07/2016 | 2 |
| 30/07/2016 | 2.2 |
| 30/07/2016 | 2.4 |
| 30/07/2016 | 2.6 |
| 30/07/2016 | 2.5 |
| 30/07/2016 | 2.5 |
| 30/07/2016 | 2.4 |
| 30/07/2016 | 2.5 |
| 30/07/2016 | 2.4 |
| 30/07/2016 | 2.4 |
| 30/07/2016 | 2.4 |
| 30/07/2016 | 2.5 |
| 30/07/2016 | 2.4 |
| 30/07/2016 | 2.4 |
| 30/07/2016 | 2.4 |
| 30/07/2016 | 2.2 |
| 30/07/2016 | 2.1 |
| 30/07/2016 | 2 |
| 31/07/2016 | 2 |
| 31/07/2016 | 1.9 |
| 31/07/2016 | 1.8 |
| 31/07/2016 | 1.8 |
| 31/07/2016 | 1.8 |
| 31/07/2016 | 1.8 |
| 31/07/2016 | 1.8 |
| 31/07/2016 | 2 |
| 31/07/2016 | 2.1 |
| 31/07/2016 | 2.4 |
| 31/07/2016 | 2.4 |
| 31/07/2016 | 2.4 |
| 31/07/2016 | 2.4 |
| 31/07/2016 | 2.4 |
| 31/07/2016 | 2.4 |
| 31/07/2016 | 2.4 |
| 31/07/2016 | 2.3 |
| 31/07/2016 | 2.3 |
| 31/07/2016 | 2.2 |
| 31/07/2016 | 2.2 |
| 31/07/2016 | 2.3 |
| 31/07/2016 | 2.3 |
| 31/07/2016 | 2.1 |
| 31/07/2016 | 2 |
| 01/08/2016 | 1.9 |
| 01/08/2016 | 1.9 |
| 01/08/2016 | 1.9 |
| 01/08/2016 | 2 |
| 01/08/2016 | 2.1 |
| 01/08/2016 | 2.4 |
| 01/08/2016 | 2.7 |
| 01/08/2016 | 2.8 |
| 01/08/2016 | 3 |
| 01/08/2016 | 2.9 |
| 01/08/2016 | 3 |
| 01/08/2016 | 3 |
| 01/08/2016 | 3 |
| 01/08/2016 | 2.9 |
| 01/08/2016 | 2.9 |
| 01/08/2016 | 2.9 |
| 01/08/2016 | 2.8 |
| 01/08/2016 | 2.8 |
| 01/08/2016 | 2.7 |
| 01/08/2016 | 2.5 |
| 01/08/2016 | 2.4 |
| 01/08/2016 | 2.3 |
| 01/08/2016 | 2.2 |
| 01/08/2016 | 2.1 |
| 02/08/2016 | 2 |
| 02/08/2016 | 2 |
| 02/08/2016 | 1.9 |
| 02/08/2016 | 2 |
| 02/08/2016 | 2.1 |
| 02/08/2016 | 2.4 |
| 02/08/2016 | 2.7 |
| 02/08/2016 | 2.9 |
| 02/08/2016 | 3 |
| 02/08/2016 | 3 |
| 02/08/2016 | 3 |
| 02/08/2016 | 3 |
| 02/08/2016 | 3 |
| 02/08/2016 | 2.9 |
| 02/08/2016 | 3 |
| 02/08/2016 | 3 |
| 02/08/2016 | 3 |
| 02/08/2016 | 2.9 |
| 02/08/2016 | 2.8 |
| 02/08/2016 | 2.7 |
| 02/08/2016 | 2.5 |
| 02/08/2016 | 2.3 |
| 02/08/2016 | 2.3 |
| 02/08/2016 | 2.1 |
| 03/08/2016 | 2.1 |
| 03/08/2016 | 2 |
| 03/08/2016 | 2 |
| 03/08/2016 | 2.1 |
| 03/08/2016 | 2.2 |
| 03/08/2016 | 2.4 |
| 03/08/2016 | 2.7 |
| 03/08/2016 | 3 |
| 03/08/2016 | 3 |
| 03/08/2016 | 3.1 |
| 03/08/2016 | 3.1 |
| 03/08/2016 | 3 |
| 03/08/2016 | 3 |
| 03/08/2016 | 3 |
| 03/08/2016 | 3 |
| 03/08/2016 | 3 |
| 03/08/2016 | 3 |
| 03/08/2016 | 2.9 |
| 03/08/2016 | 2.8 |
| 03/08/2016 | 2.6 |
| 03/08/2016 | 2.5 |
| 03/08/2016 | 2.4 |
| 03/08/2016 | 2.1 |
| 03/08/2016 | 2.1 |
| 04/08/2016 | 2.1 |
| 04/08/2016 | 2 |
| 04/08/2016 | 2 |
| 04/08/2016 | 2.1 |
| 04/08/2016 | 2.2 |
| 04/08/2016 | 2.4 |
| 04/08/2016 | 2.7 |
| 04/08/2016 | 2.9 |
| 04/08/2016 | 3 |
| 04/08/2016 | 3 |
| 04/08/2016 | 3 |
| 04/08/2016 | 2.9 |
| 04/08/2016 | 3 |
| 04/08/2016 | 2.9 |
| 04/08/2016 | 2.9 |
| 04/08/2016 | 2.7 |
| 04/08/2016 | 2.8 |
| 04/08/2016 | 2.8 |
| 04/08/2016 | 2.7 |
| 04/08/2016 | 2.6 |
| 04/08/2016 | 2.5 |
| 04/08/2016 | 2.3 |
| 04/08/2016 | 2.1 |
| 04/08/2016 | 2 |
| 05/08/2016 | 2 |
| 05/08/2016 | 2 |
| 05/08/2016 | 1.9 |
| 05/08/2016 | 2.1 |
| 05/08/2016 | 2.1 |
| 05/08/2016 | 2.4 |
| 05/08/2016 | 2.6 |
| 05/08/2016 | 2.9 |
| 05/08/2016 | 3 |
| 05/08/2016 | 3 |
| 05/08/2016 | 3 |
| 05/08/2016 | 3 |
| 05/08/2016 | 3 |
| 05/08/2016 | 2.9 |
| 05/08/2016 | 2.8 |
| 05/08/2016 | 2.8 |
| 05/08/2016 | 2.7 |
| 05/08/2016 | 2.8 |
| 05/08/2016 | 2.6 |
| 05/08/2016 | 2.5 |
| 05/08/2016 | 2.4 |
| 05/08/2016 | 2.2 |
| 05/08/2016 | 2.1 |
| 05/08/2016 | 2.1 |
| 06/08/2016 | 2 |
| 06/08/2016 | 1.9 |
| 06/08/2016 | 1.8 |
| 06/08/2016 | 1.8 |
| 06/08/2016 | 1.8 |
| 06/08/2016 | 1.9 |
| 06/08/2016 | 2 |
| 06/08/2016 | 2.2 |
| 06/08/2016 | 2.4 |
| 06/08/2016 | 2.5 |
| 06/08/2016 | 2.4 |
| 06/08/2016 | 2.4 |
| 06/08/2016 | 2.4 |
| 06/08/2016 | 2.4 |
| 06/08/2016 | 2.3 |
| 06/08/2016 | 2.4 |
| 06/08/2016 | 2.4 |
| 06/08/2016 | 2.4 |
| 06/08/2016 | 2.4 |
| 06/08/2016 | 2.4 |
| 06/08/2016 | 2.4 |
| 06/08/2016 | 2.1 |
| 06/08/2016 | 2.1 |
| 06/08/2016 | 1.9 |
| 07/08/2016 | 1.9 |
| 07/08/2016 | 1.9 |
| 07/08/2016 | 1.8 |
| 07/08/2016 | 1.8 |
| 07/08/2016 | 1.9 |
| 07/08/2016 | 1.8 |
| 07/08/2016 | 1.8 |
| 07/08/2016 | 2.1 |
| 07/08/2016 | 2.1 |
| 07/08/2016 | 2.3 |
| 07/08/2016 | 2.4 |
| 07/08/2016 | 2.4 |
| 07/08/2016 | 2.4 |
| 07/08/2016 | 2.3 |
| 07/08/2016 | 2.4 |
| 07/08/2016 | 2.3 |
| 07/08/2016 | 2.3 |
| 07/08/2016 | 2.3 |
| 07/08/2016 | 2.2 |
| 07/08/2016 | 2.2 |
| 07/08/2016 | 2.3 |
| 07/08/2016 | 2.2 |
| 07/08/2016 | 2.1 |
| 07/08/2016 | 2 |
| 08/08/2016 | 1.9 |
| 08/08/2016 | 1.9 |
| 08/08/2016 | 1.9 |
| 08/08/2016 | 2 |
| 08/08/2016 | 2.2 |
| 08/08/2016 | 2.4 |
| 08/08/2016 | 2.7 |
| 08/08/2016 | 2.9 |
| 08/08/2016 | 3 |
| 08/08/2016 | 3 |
| 08/08/2016 | 3 |
| 08/08/2016 | 3 |
| 08/08/2016 | 3 |
| 08/08/2016 | 2.8 |
| 08/08/2016 | 2.9 |
| 08/08/2016 | 2.8 |
| 08/08/2016 | 2.8 |
| 08/08/2016 | 2.7 |
| 08/08/2016 | 2.7 |
| 08/08/2016 | 2.5 |
| 08/08/2016 | 2.5 |
| 08/08/2016 | 2.4 |
| 08/08/2016 | 2.1 |
| 08/08/2016 | 2.1 |
| 09/08/2016 | 2 |
| 09/08/2016 | 1.9 |
| 09/08/2016 | 1.9 |
| 09/08/2016 | 2 |
| 09/08/2016 | 2.2 |
| 09/08/2016 | 2.4 |
| 09/08/2016 | 2.7 |
| 09/08/2016 | 2.9 |
| 09/08/2016 | 2.9 |
| 09/08/2016 | 3 |
| 09/08/2016 | 3 |
| 09/08/2016 | 3 |
| 09/08/2016 | 2.9 |
| 09/08/2016 | 2.9 |
| 09/08/2016 | 2.9 |
| 09/08/2016 | 3 |
| 09/08/2016 | 2.9 |
| 09/08/2016 | 2.9 |
| 09/08/2016 | 2.8 |
| 09/08/2016 | 2.7 |
| 09/08/2016 | 2.6 |
| 09/08/2016 | 2.3 |
| 09/08/2016 | 2.2 |
| 09/08/2016 | 2.1 |
| 10/08/2016 | 2 |
| 10/08/2016 | 2 |
| 10/08/2016 | 1.9 |
| 10/08/2016 | 2.1 |
| 10/08/2016 | 2.2 |
| 10/08/2016 | 2.4 |
| 10/08/2016 | 2.7 |
| 10/08/2016 | 3 |
| 10/08/2016 | 3 |
| 10/08/2016 | 3 |
| 10/08/2016 | 3 |
| 10/08/2016 | 3 |
| 10/08/2016 | 3 |
| 10/08/2016 | 3 |
| 10/08/2016 | 3 |
| 10/08/2016 | 3 |
| 10/08/2016 | 2.9 |
| 10/08/2016 | 2.8 |
| 10/08/2016 | 2.8 |
| 10/08/2016 | 2.7 |
| 10/08/2016 | 2.6 |
| 10/08/2016 | 2.3 |
| 10/08/2016 | 2.2 |
| 10/08/2016 | 2.1 |
| 11/08/2016 | 2 |
| 11/08/2016 | 2 |
| 11/08/2016 | 1.9 |
| 11/08/2016 | 2.1 |
| 11/08/2016 | 2.2 |
| 11/08/2016 | 2.4 |
| 11/08/2016 | 2.7 |
| 11/08/2016 | 2.9 |
| 11/08/2016 | 3 |
| 11/08/2016 | 3 |
| 11/08/2016 | 3 |
| 11/08/2016 | 2.9 |
| 11/08/2016 | 2.9 |
| 11/08/2016 | 2.9 |
| 11/08/2016 | 2.7 |
| 11/08/2016 | 2.7 |
| 11/08/2016 | 2.8 |
| 11/08/2016 | 2.7 |
| 11/08/2016 | 2.6 |
| 11/08/2016 | 2.5 |
| 11/08/2016 | 2.5 |
| 11/08/2016 | 2.3 |
| 11/08/2016 | 2.1 |
| 11/08/2016 | 1.9 |
| 12/08/2016 | 2 |
| 12/08/2016 | 1.9 |
| 12/08/2016 | 1.9 |
| 12/08/2016 | 2 |
| 12/08/2016 | 2.1 |
| 12/08/2016 | 2.3 |
| 12/08/2016 | 2.6 |
| 12/08/2016 | 2.9 |
| 12/08/2016 | 3 |
| 12/08/2016 | 3 |
| 12/08/2016 | 3 |
| 12/08/2016 | 3 |
| 12/08/2016 | 3 |
| 12/08/2016 | 2.8 |
| 12/08/2016 | 2.8 |
| 12/08/2016 | 2.8 |
| 12/08/2016 | 2.7 |
| 12/08/2016 | 2.7 |
| 12/08/2016 | 2.6 |
| 12/08/2016 | 2.4 |
| 12/08/2016 | 2.5 |
| 12/08/2016 | 2.4 |
| 12/08/2016 | 2.1 |
| 12/08/2016 | 2 |
| 13/08/2016 | 2 |
| 13/08/2016 | 1.9 |
| 13/08/2016 | 1.8 |
| 13/08/2016 | 1.8 |
| 13/08/2016 | 1.8 |
| 13/08/2016 | 1.9 |
| 13/08/2016 | 2 |
| 13/08/2016 | 2.2 |
| 13/08/2016 | 2.4 |
| 13/08/2016 | 2.5 |
| 13/08/2016 | 2.4 |
| 13/08/2016 | 2.4 |
| 13/08/2016 | 2.4 |
| 13/08/2016 | 2.4 |
| 13/08/2016 | 2.3 |
| 13/08/2016 | 2.4 |
| 13/08/2016 | 2.4 |
| 13/08/2016 | 2.4 |
| 13/08/2016 | 2.3 |
| 13/08/2016 | 2.3 |
| 13/08/2016 | 2.2 |
| 13/08/2016 | 2.1 |
| 13/08/2016 | 2.1 |
| 13/08/2016 | 1.9 |
| 14/08/2016 | 1.9 |
| 14/08/2016 | 1.9 |
| 14/08/2016 | 1.8 |
| 14/08/2016 | 1.8 |
| 14/08/2016 | 1.9 |
| 14/08/2016 | 1.8 |
| 14/08/2016 | 1.8 |
| 14/08/2016 | 1.9 |
| 14/08/2016 | 2.1 |
| 14/08/2016 | 2.3 |
| 14/08/2016 | 2.4 |
| 14/08/2016 | 2.4 |
| 14/08/2016 | 2.4 |
| 14/08/2016 | 2.3 |
| 14/08/2016 | 2.4 |
| 14/08/2016 | 2.3 |
| 14/08/2016 | 2.2 |
| 14/08/2016 | 2.3 |
| 14/08/2016 | 2.3 |
| 14/08/2016 | 2.4 |
| 14/08/2016 | 2.3 |
| 14/08/2016 | 2.2 |
| 14/08/2016 | 2.1 |
| 14/08/2016 | 1.9 |
| 15/08/2016 | 1.9 |
| 15/08/2016 | 1.9 |
| 15/08/2016 | 1.8 |
| 15/08/2016 | 2 |
| 15/08/2016 | 2 |
| 15/08/2016 | 2.4 |
| 15/08/2016 | 2.7 |
| 15/08/2016 | 2.7 |
| 15/08/2016 | 3 |
| 15/08/2016 | 2.9 |
| 15/08/2016 | 3 |
| 15/08/2016 | 3 |
| 15/08/2016 | 3 |
| 15/08/2016 | 2.8 |
| 15/08/2016 | 2.8 |
| 15/08/2016 | 2.8 |
| 15/08/2016 | 2.7 |
| 15/08/2016 | 2.7 |
| 15/08/2016 | 2.7 |
| 15/08/2016 | 2.6 |
| 15/08/2016 | 2.5 |
| 15/08/2016 | 2.4 |
| 15/08/2016 | 2.1 |
| 15/08/2016 | 2 |
| 16/08/2016 | 1.9 |
| 16/08/2016 | 1.9 |
| 16/08/2016 | 1.9 |
| 16/08/2016 | 2 |
| 16/08/2016 | 2.1 |
| 16/08/2016 | 2.4 |
| 16/08/2016 | 2.7 |
| 16/08/2016 | 2.9 |
| 16/08/2016 | 2.9 |
| 16/08/2016 | 3 |
| 16/08/2016 | 3 |
| 16/08/2016 | 2.9 |
| 16/08/2016 | 2.9 |
| 16/08/2016 | 2.9 |
| 16/08/2016 | 2.9 |
| 16/08/2016 | 3 |
| 16/08/2016 | 2.9 |
| 16/08/2016 | 2.9 |
| 16/08/2016 | 2.8 |
| 16/08/2016 | 2.7 |
| 16/08/2016 | 2.6 |
| 16/08/2016 | 2.2 |
| 16/08/2016 | 2.1 |
| 16/08/2016 | 2.1 |
| 17/08/2016 | 2 |
| 17/08/2016 | 1.9 |
| 17/08/2016 | 1.9 |
| 17/08/2016 | 2 |
| 17/08/2016 | 2.2 |
| 17/08/2016 | 2.4 |
| 17/08/2016 | 2.7 |
| 17/08/2016 | 2.8 |
| 17/08/2016 | 3 |
| 17/08/2016 | 3.1 |
| 17/08/2016 | 3 |
| 17/08/2016 | 3 |
| 17/08/2016 | 3 |
| 17/08/2016 | 3 |
| 17/08/2016 | 3 |
| 17/08/2016 | 3 |
| 17/08/2016 | 2.9 |
| 17/08/2016 | 2.9 |
| 17/08/2016 | 2.8 |
| 17/08/2016 | 2.7 |
| 17/08/2016 | 2.6 |
| 17/08/2016 | 2.3 |
| 17/08/2016 | 2.2 |
| 17/08/2016 | 2.1 |
| 18/08/2016 | 2 |
| 18/08/2016 | 1.9 |
| 18/08/2016 | 1.9 |
| 18/08/2016 | 2 |
| 18/08/2016 | 2.2 |
| 18/08/2016 | 2.4 |
| 18/08/2016 | 2.7 |
| 18/08/2016 | 2.7 |
| 18/08/2016 | 3 |
| 18/08/2016 | 2.9 |
| 18/08/2016 | 3 |
| 18/08/2016 | 2.9 |
| 18/08/2016 | 2.9 |
| 18/08/2016 | 2.9 |
| 18/08/2016 | 2.7 |
| 18/08/2016 | 2.7 |
| 18/08/2016 | 2.8 |
| 18/08/2016 | 2.8 |
| 18/08/2016 | 2.6 |
| 18/08/2016 | 2.7 |
| 18/08/2016 | 2.5 |
| 18/08/2016 | 2.2 |
| 18/08/2016 | 2.1 |
| 18/08/2016 | 2.1 |
| 19/08/2016 | 2 |
| 19/08/2016 | 1.9 |
| 19/08/2016 | 1.9 |
| 19/08/2016 | 2 |
| 19/08/2016 | 2.1 |
| 19/08/2016 | 2.3 |
| 19/08/2016 | 2.6 |
| 19/08/2016 | 2.7 |
| 19/08/2016 | 3 |
| 19/08/2016 | 3 |
| 19/08/2016 | 3 |
| 19/08/2016 | 3 |
| 19/08/2016 | 2.9 |
| 19/08/2016 | 2.8 |
| 19/08/2016 | 2.7 |
| 19/08/2016 | 2.7 |
| 19/08/2016 | 2.7 |
| 19/08/2016 | 2.8 |
| 19/08/2016 | 2.7 |
| 19/08/2016 | 2.6 |
| 19/08/2016 | 2.4 |
| 19/08/2016 | 2.3 |
| 19/08/2016 | 2.1 |
| 19/08/2016 | 2 |
| 20/08/2016 | 1.9 |
| 20/08/2016 | 1.9 |
| 20/08/2016 | 1.8 |
| 20/08/2016 | 1.8 |
| 20/08/2016 | 1.8 |
| 20/08/2016 | 1.9 |
| 20/08/2016 | 2 |
| 20/08/2016 | 2.1 |
| 20/08/2016 | 2.4 |
| 20/08/2016 | 2.5 |
| 20/08/2016 | 2.4 |
| 20/08/2016 | 2.4 |
| 20/08/2016 | 2.4 |
| 20/08/2016 | 2.4 |
| 20/08/2016 | 2.3 |
| 20/08/2016 | 2.3 |
| 20/08/2016 | 2.4 |
| 20/08/2016 | 2.4 |
| 20/08/2016 | 2.4 |
| 20/08/2016 | 2.3 |
| 20/08/2016 | 2.2 |
| 20/08/2016 | 2.1 |
| 20/08/2016 | 2.1 |
| 20/08/2016 | 2.1 |
| 21/08/2016 | 1.8 |
| 21/08/2016 | 1.8 |
| 21/08/2016 | 1.8 |
| 21/08/2016 | 1.8 |
| 21/08/2016 | 1.8 |
| 21/08/2016 | 1.8 |
| 21/08/2016 | 1.8 |
| 21/08/2016 | 1.9 |
| 21/08/2016 | 2.1 |
| 21/08/2016 | 2.3 |
| 21/08/2016 | 2.4 |
| 21/08/2016 | 2.4 |
| 21/08/2016 | 2.4 |
| 21/08/2016 | 2.3 |
| 21/08/2016 | 2.3 |
| 21/08/2016 | 2.3 |
| 21/08/2016 | 2.2 |
| 21/08/2016 | 2.3 |
| 21/08/2016 | 2.3 |
| 21/08/2016 | 2.3 |
| 21/08/2016 | 2.3 |
| 21/08/2016 | 2.1 |
| 21/08/2016 | 2.1 |
| 21/08/2016 | 1.9 |
| 22/08/2016 | 1.8 |
| 22/08/2016 | 1.8 |
| 22/08/2016 | 1.8 |
| 22/08/2016 | 1.9 |
| 22/08/2016 | 2 |
| 22/08/2016 | 2.4 |
| 22/08/2016 | 2.7 |
| 22/08/2016 | 2.7 |
| 22/08/2016 | 2.8 |
| 22/08/2016 | 2.9 |
| 22/08/2016 | 2.9 |
| 22/08/2016 | 3 |
| 22/08/2016 | 3 |
| 22/08/2016 | 2.8 |
| 22/08/2016 | 2.8 |
| 22/08/2016 | 2.8 |
| 22/08/2016 | 2.7 |
| 22/08/2016 | 2.7 |
| 22/08/2016 | 2.7 |
| 22/08/2016 | 2.7 |
| 22/08/2016 | 2.5 |
| 22/08/2016 | 2.3 |
| 22/08/2016 | 2.1 |
| 22/08/2016 | 2 |
| 23/08/2016 | 1.9 |
| 23/08/2016 | 1.8 |
| 23/08/2016 | 1.8 |
| 23/08/2016 | 1.9 |
| 23/08/2016 | 2.1 |
| 23/08/2016 | 2.4 |
| 23/08/2016 | 2.6 |
| 23/08/2016 | 2.7 |
| 23/08/2016 | 3 |
| 23/08/2016 | 3 |
| 23/08/2016 | 3 |
| 23/08/2016 | 2.8 |
| 23/08/2016 | 2.9 |
| 23/08/2016 | 2.8 |
| 23/08/2016 | 2.8 |
| 23/08/2016 | 2.9 |
| 23/08/2016 | 2.9 |
| 23/08/2016 | 2.9 |
| 23/08/2016 | 2.8 |
| 23/08/2016 | 2.7 |
| 23/08/2016 | 2.6 |
| 23/08/2016 | 2.4 |
| 23/08/2016 | 2.1 |
| 23/08/2016 | 2.1 |
| 24/08/2016 | 1.9 |
| 24/08/2016 | 1.9 |
| 24/08/2016 | 1.9 |
| 24/08/2016 | 2 |
| 24/08/2016 | 2.1 |
| 24/08/2016 | 2.4 |
| 24/08/2016 | 2.7 |
| 24/08/2016 | 2.8 |
| 24/08/2016 | 2.9 |
| 24/08/2016 | 3.1 |
| 24/08/2016 | 3 |
| 24/08/2016 | 3 |
| 24/08/2016 | 3 |
| 24/08/2016 | 3 |
| 24/08/2016 | 2.9 |
| 24/08/2016 | 2.9 |
| 24/08/2016 | 2.9 |
| 24/08/2016 | 2.9 |
| 24/08/2016 | 2.8 |
| 24/08/2016 | 2.7 |
| 24/08/2016 | 2.6 |
| 24/08/2016 | 2.2 |
| 24/08/2016 | 2.1 |
| 24/08/2016 | 2.1 |
| 25/08/2016 | 1.9 |
| 25/08/2016 | 1.9 |
| 25/08/2016 | 1.8 |
| 25/08/2016 | 2 |
| 25/08/2016 | 2 |
| 25/08/2016 | 2.4 |
| 25/08/2016 | 2.7 |
| 25/08/2016 | 2.7 |
| 25/08/2016 | 2.8 |
| 25/08/2016 | 2.9 |
| 25/08/2016 | 3 |
| 25/08/2016 | 2.9 |
| 25/08/2016 | 2.9 |
| 25/08/2016 | 2.8 |
| 25/08/2016 | 2.7 |
| 25/08/2016 | 2.7 |
| 25/08/2016 | 2.7 |
| 25/08/2016 | 2.8 |
| 25/08/2016 | 2.7 |
| 25/08/2016 | 2.7 |
| 25/08/2016 | 2.5 |
| 25/08/2016 | 2.2 |
| 25/08/2016 | 2.1 |
| 25/08/2016 | 2.1 |
| 26/08/2016 | 1.9 |
| 26/08/2016 | 1.9 |
| 26/08/2016 | 1.8 |
| 26/08/2016 | 1.9 |
| 26/08/2016 | 2 |
| 26/08/2016 | 2.3 |
| 26/08/2016 | 2.6 |
| 26/08/2016 | 2.7 |
| 26/08/2016 | 2.8 |
| 26/08/2016 | 2.9 |
| 26/08/2016 | 3 |
| 26/08/2016 | 3 |
| 26/08/2016 | 2.9 |
| 26/08/2016 | 2.8 |
| 26/08/2016 | 2.7 |
| 26/08/2016 | 2.7 |
| 26/08/2016 | 2.7 |
| 26/08/2016 | 2.8 |
| 26/08/2016 | 2.7 |
| 26/08/2016 | 2.6 |
| 26/08/2016 | 2.4 |
| 26/08/2016 | 2.3 |
| 26/08/2016 | 2.1 |
| 26/08/2016 | 1.9 |
| 27/08/2016 | 1.9 |
| 27/08/2016 | 1.8 |
| 27/08/2016 | 1.8 |
| 27/08/2016 | 1.9 |
| 27/08/2016 | 1.8 |
| 27/08/2016 | 1.9 |
| 27/08/2016 | 2 |
| 27/08/2016 | 2.1 |
| 27/08/2016 | 2.4 |
| 27/08/2016 | 2.5 |
| 27/08/2016 | 2.4 |
| 27/08/2016 | 2.4 |
| 27/08/2016 | 2.4 |
| 27/08/2016 | 2.4 |
| 27/08/2016 | 2.2 |
| 27/08/2016 | 2.3 |
| 27/08/2016 | 2.4 |
| 27/08/2016 | 2.4 |
| 27/08/2016 | 2.4 |
| 27/08/2016 | 2.4 |
| 27/08/2016 | 2.2 |
| 27/08/2016 | 2.1 |
| 27/08/2016 | 2 |
| 27/08/2016 | 2 |
| 28/08/2016 | 1.8 |
| 28/08/2016 | 1.8 |
| 28/08/2016 | 1.9 |
| 28/08/2016 | 1.8 |
| 28/08/2016 | 1.8 |
| 28/08/2016 | 1.8 |
| 28/08/2016 | 1.8 |
| 28/08/2016 | 1.9 |
| 28/08/2016 | 2.1 |
| 28/08/2016 | 2.3 |
| 28/08/2016 | 2.4 |
| 28/08/2016 | 2.4 |
| 28/08/2016 | 2.4 |
| 28/08/2016 | 2.3 |
| 28/08/2016 | 2.1 |
| 28/08/2016 | 2.3 |
| 28/08/2016 | 2.2 |
| 28/08/2016 | 2.3 |
| 28/08/2016 | 2.2 |
| 28/08/2016 | 2.3 |
| 28/08/2016 | 2.3 |
| 28/08/2016 | 2.1 |
| 28/08/2016 | 2 |
| 28/08/2016 | 2 |
| 29/08/2016 | 1.8 |
| 29/08/2016 | 1.8 |
| 29/08/2016 | 1.8 |
| 29/08/2016 | 1.9 |
| 29/08/2016 | 2 |
| 29/08/2016 | 2.3 |
| 29/08/2016 | 2.5 |
| 29/08/2016 | 2.7 |
| 29/08/2016 | 2.8 |
| 29/08/2016 | 2.9 |
| 29/08/2016 | 2.9 |
| 29/08/2016 | 3 |
| 29/08/2016 | 3 |
| 29/08/2016 | 2.8 |
| 29/08/2016 | 2.7 |
| 29/08/2016 | 2.7 |
| 29/08/2016 | 2.7 |
| 29/08/2016 | 2.8 |
| 29/08/2016 | 2.8 |
| 29/08/2016 | 2.7 |
| 29/08/2016 | 2.5 |
| 29/08/2016 | 2.3 |
| 29/08/2016 | 2.1 |
| 29/08/2016 | 2 |
| 30/08/2016 | 1.8 |
| 30/08/2016 | 1.8 |
| 30/08/2016 | 1.8 |
| 30/08/2016 | 1.9 |
| 30/08/2016 | 2 |
| 30/08/2016 | 2.2 |
| 30/08/2016 | 2.6 |
| 30/08/2016 | 2.7 |
| 30/08/2016 | 3 |
| 30/08/2016 | 3 |
| 30/08/2016 | 3 |
| 30/08/2016 | 2.8 |
| 30/08/2016 | 2.9 |
| 30/08/2016 | 2.8 |
| 30/08/2016 | 2.8 |
| 30/08/2016 | 2.9 |
| 30/08/2016 | 2.9 |
| 30/08/2016 | 2.9 |
| 30/08/2016 | 2.8 |
| 30/08/2016 | 2.7 |
| 30/08/2016 | 2.6 |
| 30/08/2016 | 2.4 |
| 30/08/2016 | 2.1 |
| 30/08/2016 | 2 |
| 31/08/2016 | 1.9 |
| 31/08/2016 | 1.8 |
| 31/08/2016 | 1.8 |
| 31/08/2016 | 1.9 |
| 31/08/2016 | 2.1 |
| 31/08/2016 | 2.3 |
| 31/08/2016 | 2.5 |
| 31/08/2016 | 2.8 |
| 31/08/2016 | 2.9 |
| 31/08/2016 | 3 |
| 31/08/2016 | 3 |
| 31/08/2016 | 3 |
| 31/08/2016 | 3 |
| 31/08/2016 | 2.9 |
| 31/08/2016 | 2.9 |
| 31/08/2016 | 2.9 |
| 31/08/2016 | 2.9 |
| 31/08/2016 | 2.9 |
| 31/08/2016 | 2.8 |
| 31/08/2016 | 2.7 |
| 31/08/2016 | 2.6 |
| 31/08/2016 | 2.4 |
| 31/08/2016 | 2.1 |
| 31/08/2016 | 2 |
| 01/09/2016 | 1.9 |
| 01/09/2016 | 1.8 |
| 01/09/2016 | 1.8 |
| 01/09/2016 | 1.9 |
| 01/09/2016 | 2 |
| 01/09/2016 | 2.2 |
| 01/09/2016 | 2.5 |
| 01/09/2016 | 2.7 |
| 01/09/2016 | 2.8 |
| 01/09/2016 | 2.9 |
| 01/09/2016 | 3 |
| 01/09/2016 | 2.9 |
| 01/09/2016 | 2.9 |
| 01/09/2016 | 2.8 |
| 01/09/2016 | 2.7 |
| 01/09/2016 | 2.7 |
| 01/09/2016 | 2.7 |
| 01/09/2016 | 2.8 |
| 01/09/2016 | 2.7 |
| 01/09/2016 | 2.7 |
| 01/09/2016 | 2.5 |
| 01/09/2016 | 2.3 |
| 01/09/2016 | 2.1 |
| 01/09/2016 | 2 |
| 02/09/2016 | 1.9 |
| 02/09/2016 | 1.8 |
| 02/09/2016 | 1.8 |
| 02/09/2016 | 1.9 |
| 02/09/2016 | 2 |
| 02/09/2016 | 2.1 |
| 02/09/2016 | 2.6 |
| 02/09/2016 | 2.7 |
| 02/09/2016 | 2.8 |
| 02/09/2016 | 2.9 |
| 02/09/2016 | 3 |
| 02/09/2016 | 3 |
| 02/09/2016 | 2.9 |
| 02/09/2016 | 2.8 |
| 02/09/2016 | 2.7 |
| 02/09/2016 | 2.7 |
| 02/09/2016 | 2.8 |
| 02/09/2016 | 2.8 |
| 02/09/2016 | 2.7 |
| 02/09/2016 | 2.6 |
| 02/09/2016 | 2.4 |
| 02/09/2016 | 2.2 |
| 02/09/2016 | 2 |
| 02/09/2016 | 1.9 |
| 03/09/2016 | 1.8 |
| 03/09/2016 | 1.8 |
| 03/09/2016 | 1.8 |
| 03/09/2016 | 1.8 |
| 03/09/2016 | 1.9 |
| 03/09/2016 | 1.8 |
| 03/09/2016 | 2 |
| 03/09/2016 | 2.1 |
| 03/09/2016 | 2.3 |
| 03/09/2016 | 2.5 |
| 03/09/2016 | 2.6 |
| 03/09/2016 | 2.6 |
| 03/09/2016 | 2.5 |
| 03/09/2016 | 2.4 |
| 03/09/2016 | 2.4 |
| 03/09/2016 | 2.4 |
| 03/09/2016 | 2.4 |
| 03/09/2016 | 2.4 |
| 03/09/2016 | 2.5 |
| 03/09/2016 | 2.5 |
| 03/09/2016 | 2.4 |
| 03/09/2016 | 2.1 |
| 03/09/2016 | 2 |
| 03/09/2016 | 2 |
| 04/09/2016 | 1.8 |
| 04/09/2016 | 1.8 |
| 04/09/2016 | 1.7 |
| 04/09/2016 | 1.7 |
| 04/09/2016 | 1.8 |
| 04/09/2016 | 1.8 |
| 04/09/2016 | 1.9 |
| 04/09/2016 | 2 |
| 04/09/2016 | 2.1 |
| 04/09/2016 | 2.3 |
| 04/09/2016 | 2.4 |
| 04/09/2016 | 2.4 |
| 04/09/2016 | 2.4 |
| 04/09/2016 | 2.3 |
| 04/09/2016 | 2.4 |
| 04/09/2016 | 2.3 |
| 04/09/2016 | 2.3 |
| 04/09/2016 | 2.4 |
| 04/09/2016 | 2.4 |
| 04/09/2016 | 2.5 |
| 04/09/2016 | 2.3 |
| 04/09/2016 | 2.2 |
| 04/09/2016 | 2.1 |
| 04/09/2016 | 2 |
| 05/09/2016 | 1.8 |
| 05/09/2016 | 1.8 |
| 05/09/2016 | 1.8 |
| 05/09/2016 | 1.9 |
| 05/09/2016 | 2.1 |
| 05/09/2016 | 2.4 |
| 05/09/2016 | 2.6 |
| 05/09/2016 | 2.7 |
| 05/09/2016 | 2.9 |
| 05/09/2016 | 2.9 |
| 05/09/2016 | 3 |
| 05/09/2016 | 3 |
| 05/09/2016 | 3 |
| 05/09/2016 | 2.9 |
| 05/09/2016 | 2.9 |
| 05/09/2016 | 2.8 |
| 05/09/2016 | 2.8 |
| 05/09/2016 | 2.9 |
| 05/09/2016 | 3 |
| 05/09/2016 | 2.8 |
| 05/09/2016 | 2.5 |
| 05/09/2016 | 2.4 |
| 05/09/2016 | 2.1 |
| 05/09/2016 | 1.9 |
| 06/09/2016 | 1.8 |
| 06/09/2016 | 1.8 |
| 06/09/2016 | 1.8 |
| 06/09/2016 | 1.9 |
| 06/09/2016 | 2.1 |
| 06/09/2016 | 2.4 |
| 06/09/2016 | 2.6 |
| 06/09/2016 | 2.7 |
| 06/09/2016 | 2.9 |
| 06/09/2016 | 3 |
| 06/09/2016 | 3 |
| 06/09/2016 | 3 |
| 06/09/2016 | 2.9 |
| 06/09/2016 | 3 |
| 06/09/2016 | 2.9 |
| 06/09/2016 | 3 |
| 06/09/2016 | 3 |
| 06/09/2016 | 2.9 |
| 06/09/2016 | 3 |
| 06/09/2016 | 2.8 |
| 06/09/2016 | 2.6 |
| 06/09/2016 | 2.2 |
| 06/09/2016 | 2.1 |
| 06/09/2016 | 2 |
| 07/09/2016 | 1.9 |
| 07/09/2016 | 1.8 |
| 07/09/2016 | 1.8 |
| 07/09/2016 | 1.9 |
| 07/09/2016 | 2.1 |
| 07/09/2016 | 2.4 |
| 07/09/2016 | 2.7 |
| 07/09/2016 | 2.8 |
| 07/09/2016 | 3 |
| 07/09/2016 | 3 |
| 07/09/2016 | 3.1 |
| 07/09/2016 | 3 |
| 07/09/2016 | 3 |
| 07/09/2016 | 3 |
| 07/09/2016 | 3 |
| 07/09/2016 | 2.8 |
| 07/09/2016 | 3 |
| 07/09/2016 | 2.9 |
| 07/09/2016 | 3 |
| 07/09/2016 | 2.8 |
| 07/09/2016 | 2.6 |
| 07/09/2016 | 2.3 |
| 07/09/2016 | 2.1 |
| 07/09/2016 | 2 |
| 08/09/2016 | 1.9 |
| 08/09/2016 | 1.8 |
| 08/09/2016 | 1.8 |
| 08/09/2016 | 1.9 |
| 08/09/2016 | 2.1 |
| 08/09/2016 | 2.4 |
| 08/09/2016 | 2.6 |
| 08/09/2016 | 2.7 |
| 08/09/2016 | 2.9 |
| 08/09/2016 | 2.9 |
| 08/09/2016 | 3 |
| 08/09/2016 | 2.9 |
| 08/09/2016 | 2.9 |
| 08/09/2016 | 2.9 |
| 08/09/2016 | 2.7 |
| 08/09/2016 | 2.7 |
| 08/09/2016 | 2.8 |
| 08/09/2016 | 2.8 |
| 08/09/2016 | 2.9 |
| 08/09/2016 | 2.8 |
| 08/09/2016 | 2.6 |
| 08/09/2016 | 2.2 |
| 08/09/2016 | 2.1 |
| 08/09/2016 | 2 |
| 09/09/2016 | 1.8 |
| 09/09/2016 | 1.8 |
| 09/09/2016 | 1.8 |
| 09/09/2016 | 1.9 |
| 09/09/2016 | 2.1 |
| 09/09/2016 | 2.4 |
| 09/09/2016 | 2.5 |
| 09/09/2016 | 2.7 |
| 09/09/2016 | 2.9 |
| 09/09/2016 | 3 |
| 09/09/2016 | 3 |
| 09/09/2016 | 3 |
| 09/09/2016 | 3 |
| 09/09/2016 | 2.9 |
| 09/09/2016 | 2.8 |
| 09/09/2016 | 2.8 |
| 09/09/2016 | 2.7 |
| 09/09/2016 | 2.7 |
| 09/09/2016 | 2.8 |
| 09/09/2016 | 2.7 |
| 09/09/2016 | 2.5 |
| 09/09/2016 | 2.3 |
| 09/09/2016 | 2.1 |
| 09/09/2016 | 1.9 |
| 10/09/2016 | 1.8 |
| 10/09/2016 | 1.8 |
| 10/09/2016 | 1.7 |
| 10/09/2016 | 1.8 |
| 10/09/2016 | 1.9 |
| 10/09/2016 | 1.8 |
| 10/09/2016 | 2 |
| 10/09/2016 | 2.1 |
| 10/09/2016 | 2.3 |
| 10/09/2016 | 2.5 |
| 10/09/2016 | 2.6 |
| 10/09/2016 | 2.6 |
| 10/09/2016 | 2.5 |
| 10/09/2016 | 2.4 |
| 10/09/2016 | 2.4 |
| 10/09/2016 | 2.3 |
| 10/09/2016 | 2.4 |
| 10/09/2016 | 2.4 |
| 10/09/2016 | 2.7 |
| 10/09/2016 | 2.5 |
| 10/09/2016 | 2.4 |
| 10/09/2016 | 2.1 |
| 10/09/2016 | 2 |
| 10/09/2016 | 1.9 |
| 11/09/2016 | 1.8 |
| 11/09/2016 | 1.8 |
| 11/09/2016 | 1.8 |
| 11/09/2016 | 1.7 |
| 11/09/2016 | 1.8 |
| 11/09/2016 | 1.8 |
| 11/09/2016 | 1.9 |
| 11/09/2016 | 2 |
| 11/09/2016 | 2.1 |
| 11/09/2016 | 2.3 |
| 11/09/2016 | 2.4 |
| 11/09/2016 | 2.4 |
| 11/09/2016 | 2.4 |
| 11/09/2016 | 2.3 |
| 11/09/2016 | 2.3 |
| 11/09/2016 | 2.3 |
| 11/09/2016 | 2.2 |
| 11/09/2016 | 2.4 |
| 11/09/2016 | 2.4 |
| 11/09/2016 | 2.5 |
| 11/09/2016 | 2.3 |
| 11/09/2016 | 2.2 |
| 11/09/2016 | 2 |
| 11/09/2016 | 2 |
| 12/09/2016 | 1.8 |
| 12/09/2016 | 1.8 |
| 12/09/2016 | 1.8 |
| 12/09/2016 | 1.8 |
| 12/09/2016 | 2.1 |
| 12/09/2016 | 2.3 |
| 12/09/2016 | 2.6 |
| 12/09/2016 | 2.7 |
| 12/09/2016 | 2.9 |
| 12/09/2016 | 3 |
| 12/09/2016 | 3 |
| 12/09/2016 | 3 |
| 12/09/2016 | 3 |
| 12/09/2016 | 2.9 |
| 12/09/2016 | 2.8 |
| 12/09/2016 | 2.8 |
| 12/09/2016 | 2.8 |
| 12/09/2016 | 2.9 |
| 12/09/2016 | 3 |
| 12/09/2016 | 2.9 |
| 12/09/2016 | 2.5 |
| 12/09/2016 | 2.3 |
| 12/09/2016 | 2.1 |
| 12/09/2016 | 1.9 |
| 13/09/2016 | 1.8 |
| 13/09/2016 | 1.8 |
| 13/09/2016 | 1.8 |
| 13/09/2016 | 1.9 |
| 13/09/2016 | 2.1 |
| 13/09/2016 | 2.3 |
| 13/09/2016 | 2.6 |
| 13/09/2016 | 2.7 |
| 13/09/2016 | 2.9 |
| 13/09/2016 | 2.9 |
| 13/09/2016 | 3 |
| 13/09/2016 | 3 |
| 13/09/2016 | 2.9 |
| 13/09/2016 | 2.9 |
| 13/09/2016 | 2.9 |
| 13/09/2016 | 3 |
| 13/09/2016 | 3 |
| 13/09/2016 | 2.9 |
| 13/09/2016 | 3 |
| 13/09/2016 | 3 |
| 13/09/2016 | 2.6 |
| 13/09/2016 | 2.4 |
| 13/09/2016 | 2.1 |
| 13/09/2016 | 2 |
| 14/09/2016 | 1.8 |
| 14/09/2016 | 1.8 |
| 14/09/2016 | 1.8 |
| 14/09/2016 | 1.9 |
| 14/09/2016 | 2.1 |
| 14/09/2016 | 2.3 |
| 14/09/2016 | 2.7 |
| 14/09/2016 | 2.8 |
| 14/09/2016 | 3 |
| 14/09/2016 | 3 |
| 14/09/2016 | 3.1 |
| 14/09/2016 | 3 |
| 14/09/2016 | 3 |
| 14/09/2016 | 3 |
| 14/09/2016 | 3 |
| 14/09/2016 | 2.8 |
| 14/09/2016 | 2.8 |
| 14/09/2016 | 2.9 |
| 14/09/2016 | 3 |
| 14/09/2016 | 3 |
| 14/09/2016 | 2.6 |
| 14/09/2016 | 2.2 |
| 14/09/2016 | 2.1 |
| 14/09/2016 | 2 |
| 15/09/2016 | 1.8 |
| 15/09/2016 | 1.8 |
| 15/09/2016 | 1.8 |
| 15/09/2016 | 1.9 |
| 15/09/2016 | 2.1 |
| 15/09/2016 | 2.3 |
| 15/09/2016 | 2.6 |
| 15/09/2016 | 2.8 |
| 15/09/2016 | 3 |
| 15/09/2016 | 3 |
| 15/09/2016 | 3 |
| 15/09/2016 | 2.9 |
| 15/09/2016 | 3 |
| 15/09/2016 | 2.9 |
| 15/09/2016 | 2.7 |
| 15/09/2016 | 2.7 |
| 15/09/2016 | 2.7 |
| 15/09/2016 | 2.9 |
| 15/09/2016 | 2.9 |
| 15/09/2016 | 2.7 |
| 15/09/2016 | 2.6 |
| 15/09/2016 | 2.2 |
| 15/09/2016 | 2.1 |
| 15/09/2016 | 2 |
| 16/09/2016 | 1.8 |
| 16/09/2016 | 1.8 |
| 16/09/2016 | 1.8 |
| 16/09/2016 | 1.9 |
| 16/09/2016 | 2.1 |
| 16/09/2016 | 2.2 |
| 16/09/2016 | 2.6 |
| 16/09/2016 | 2.8 |
| 16/09/2016 | 3 |
| 16/09/2016 | 3 |
| 16/09/2016 | 3 |
| 16/09/2016 | 3 |
| 16/09/2016 | 3 |
| 16/09/2016 | 2.9 |
| 16/09/2016 | 2.8 |
| 16/09/2016 | 2.8 |
| 16/09/2016 | 2.8 |
| 16/09/2016 | 2.7 |
| 16/09/2016 | 2.8 |
| 16/09/2016 | 2.8 |
| 16/09/2016 | 2.5 |
| 16/09/2016 | 2.3 |
| 16/09/2016 | 2.1 |
| 16/09/2016 | 1.9 |
| 17/09/2016 | 1.8 |
| 17/09/2016 | 1.8 |
| 17/09/2016 | 1.7 |
| 17/09/2016 | 1.8 |
| 17/09/2016 | 1.8 |
| 17/09/2016 | 1.9 |
| 17/09/2016 | 2 |
| 17/09/2016 | 2.1 |
| 17/09/2016 | 2.4 |
| 17/09/2016 | 2.4 |
| 17/09/2016 | 2.4 |
| 17/09/2016 | 2.4 |
| 17/09/2016 | 2.5 |
| 17/09/2016 | 2.4 |
| 17/09/2016 | 2.3 |
| 17/09/2016 | 2.4 |
| 17/09/2016 | 2.4 |
| 17/09/2016 | 2.4 |
| 17/09/2016 | 2.7 |
| 17/09/2016 | 2.6 |
| 17/09/2016 | 2.4 |
| 17/09/2016 | 2.1 |
| 17/09/2016 | 2 |
| 17/09/2016 | 2 |
| 18/09/2016 | 1.8 |
| 18/09/2016 | 1.8 |
| 18/09/2016 | 1.7 |
| 18/09/2016 | 1.7 |
| 18/09/2016 | 1.8 |
| 18/09/2016 | 1.8 |
| 18/09/2016 | 1.8 |
| 18/09/2016 | 2.1 |
| 18/09/2016 | 2.2 |
| 18/09/2016 | 2.4 |
| 18/09/2016 | 2.4 |
| 18/09/2016 | 2.4 |
| 18/09/2016 | 2.4 |
| 18/09/2016 | 2.3 |
| 18/09/2016 | 2.4 |
| 18/09/2016 | 2.3 |
| 18/09/2016 | 2.4 |
| 18/09/2016 | 2.4 |
| 18/09/2016 | 2.4 |
| 18/09/2016 | 2.5 |
| 18/09/2016 | 2.4 |
| 18/09/2016 | 2.2 |
| 18/09/2016 | 2.1 |
| 18/09/2016 | 1.8 |
| 19/09/2016 | 1.8 |
| 19/09/2016 | 1.8 |
| 19/09/2016 | 1.8 |
| 19/09/2016 | 1.9 |
| 19/09/2016 | 1.9 |
| 19/09/2016 | 2.4 |
| 19/09/2016 | 2.5 |
| 19/09/2016 | 2.7 |
| 19/09/2016 | 2.8 |
| 19/09/2016 | 3 |
| 19/09/2016 | 3 |
| 19/09/2016 | 3 |
| 19/09/2016 | 3 |
| 19/09/2016 | 2.9 |
| 19/09/2016 | 2.9 |
| 19/09/2016 | 2.9 |
| 19/09/2016 | 2.8 |
| 19/09/2016 | 2.9 |
| 19/09/2016 | 3 |
| 19/09/2016 | 2.9 |
| 19/09/2016 | 2.6 |
| 19/09/2016 | 2.4 |
| 19/09/2016 | 2.1 |
| 19/09/2016 | 1.9 |
| 20/09/2016 | 1.8 |
| 20/09/2016 | 1.8 |
| 20/09/2016 | 1.8 |
| 20/09/2016 | 1.9 |
| 20/09/2016 | 2.1 |
| 20/09/2016 | 2.4 |
| 20/09/2016 | 2.7 |
| 20/09/2016 | 2.8 |
| 20/09/2016 | 3 |
| 20/09/2016 | 3 |
| 20/09/2016 | 3 |
| 20/09/2016 | 2.9 |
| 20/09/2016 | 3 |
| 20/09/2016 | 3 |
| 20/09/2016 | 3 |
| 20/09/2016 | 2.9 |
| 20/09/2016 | 3 |
| 20/09/2016 | 3 |
| 20/09/2016 | 3 |
| 20/09/2016 | 2.8 |
| 20/09/2016 | 2.7 |
| 20/09/2016 | 2.2 |
| 20/09/2016 | 2.1 |
| 20/09/2016 | 2 |
| 21/09/2016 | 1.9 |
| 21/09/2016 | 1.8 |
| 21/09/2016 | 1.8 |
| 21/09/2016 | 1.9 |
| 21/09/2016 | 2 |
| 21/09/2016 | 2.4 |
| 21/09/2016 | 2.6 |
| 21/09/2016 | 2.8 |
| 21/09/2016 | 2.9 |
| 21/09/2016 | 3 |
| 21/09/2016 | 3 |
| 21/09/2016 | 3 |
| 21/09/2016 | 3 |
| 21/09/2016 | 3 |
| 21/09/2016 | 2.9 |
| 21/09/2016 | 2.9 |
| 21/09/2016 | 3 |
| 21/09/2016 | 2.9 |
| 21/09/2016 | 3 |
| 21/09/2016 | 2.8 |
| 21/09/2016 | 2.6 |
| 21/09/2016 | 2.3 |
| 21/09/2016 | 2.1 |
| 21/09/2016 | 2 |
| 22/09/2016 | 1.9 |
| 22/09/2016 | 1.8 |
| 22/09/2016 | 1.8 |
| 22/09/2016 | 1.9 |
| 22/09/2016 | 2 |
| 22/09/2016 | 2.4 |
| 22/09/2016 | 2.6 |
| 22/09/2016 | 2.7 |
| 22/09/2016 | 2.9 |
| 22/09/2016 | 3 |
| 22/09/2016 | 3 |
| 22/09/2016 | 3 |
| 22/09/2016 | 3 |
| 22/09/2016 | 2.8 |
| 22/09/2016 | 2.7 |
| 22/09/2016 | 2.8 |
| 22/09/2016 | 2.9 |
| 22/09/2016 | 2.9 |
| 22/09/2016 | 3 |
| 22/09/2016 | 2.7 |
| 22/09/2016 | 2.6 |
| 22/09/2016 | 2.2 |
| 22/09/2016 | 2 |
| 22/09/2016 | 2 |
| 23/09/2016 | 1.9 |
| 23/09/2016 | 1.8 |
| 23/09/2016 | 1.8 |
| 23/09/2016 | 1.9 |
| 23/09/2016 | 2.1 |
| 23/09/2016 | 2.3 |
| 23/09/2016 | 2.5 |
| 23/09/2016 | 2.7 |
| 23/09/2016 | 2.9 |
| 23/09/2016 | 3 |
| 23/09/2016 | 3 |
| 23/09/2016 | 2.9 |
| 23/09/2016 | 3 |
| 23/09/2016 | 2.9 |
| 23/09/2016 | 2.9 |
| 23/09/2016 | 2.7 |
| 23/09/2016 | 2.8 |
| 23/09/2016 | 2.9 |
| 23/09/2016 | 2.9 |
| 23/09/2016 | 2.7 |
| 23/09/2016 | 2.5 |
| 23/09/2016 | 2.2 |
| 23/09/2016 | 2.1 |
| 23/09/2016 | 1.9 |
| 24/09/2016 | 1.8 |
| 24/09/2016 | 1.8 |
| 24/09/2016 | 1.8 |
| 24/09/2016 | 1.8 |
| 24/09/2016 | 1.8 |
| 24/09/2016 | 2 |
| 24/09/2016 | 1.9 |
| 24/09/2016 | 2.1 |
| 24/09/2016 | 2.4 |
| 24/09/2016 | 2.4 |
| 24/09/2016 | 2.5 |
| 24/09/2016 | 2.5 |
| 24/09/2016 | 2.4 |
| 24/09/2016 | 2.4 |
| 24/09/2016 | 2.3 |
| 24/09/2016 | 2.4 |
| 24/09/2016 | 2.4 |
| 24/09/2016 | 2.5 |
| 24/09/2016 | 2.7 |
| 24/09/2016 | 2.6 |
| 24/09/2016 | 2.3 |
| 24/09/2016 | 2.1 |
| 24/09/2016 | 2.1 |
| 24/09/2016 | 1.8 |
| 25/09/2016 | 1.8 |
| 25/09/2016 | 1.8 |
| 25/09/2016 | 1.7 |
| 25/09/2016 | 1.7 |
| 25/09/2016 | 1.8 |
| 25/09/2016 | 1.8 |
| 25/09/2016 | 1.9 |
| 25/09/2016 | 2 |
| 25/09/2016 | 2.1 |
| 25/09/2016 | 2.2 |
| 25/09/2016 | 2.4 |
| 25/09/2016 | 2.4 |
| 25/09/2016 | 2.4 |
| 25/09/2016 | 2.3 |
| 25/09/2016 | 2.4 |
| 25/09/2016 | 2.4 |
| 25/09/2016 | 2.3 |
| 25/09/2016 | 2.4 |
| 25/09/2016 | 2.4 |
| 25/09/2016 | 2.4 |
| 25/09/2016 | 2.4 |
| 25/09/2016 | 2.2 |
| 25/09/2016 | 2.1 |
| 25/09/2016 | 1.8 |
| 26/09/2016 | 1.8 |
| 26/09/2016 | 1.8 |
| 26/09/2016 | 1.8 |
| 26/09/2016 | 1.9 |
| 26/09/2016 | 2 |
| 26/09/2016 | 2.3 |
| 26/09/2016 | 2.7 |
| 26/09/2016 | 2.8 |
| 26/09/2016 | 2.9 |
| 26/09/2016 | 2.9 |
| 26/09/2016 | 3 |
| 26/09/2016 | 3 |
| 26/09/2016 | 2.9 |
| 26/09/2016 | 2.9 |
| 26/09/2016 | 2.9 |
| 26/09/2016 | 2.8 |
| 26/09/2016 | 3 |
| 26/09/2016 | 3 |
| 26/09/2016 | 3 |
| 26/09/2016 | 2.7 |
| 26/09/2016 | 2.6 |
| 26/09/2016 | 2.2 |
| 26/09/2016 | 2.1 |
| 26/09/2016 | 2 |
| 27/09/2016 | 1.8 |
| 27/09/2016 | 1.8 |
| 27/09/2016 | 1.8 |
| 27/09/2016 | 1.9 |
| 27/09/2016 | 2 |
| 27/09/2016 | 2.4 |
| 27/09/2016 | 2.7 |
| 27/09/2016 | 2.8 |
| 27/09/2016 | 2.9 |
| 27/09/2016 | 3 |
| 27/09/2016 | 3 |
| 27/09/2016 | 3 |
| 27/09/2016 | 3 |
| 27/09/2016 | 3 |
| 27/09/2016 | 3 |
| 27/09/2016 | 2.9 |
| 27/09/2016 | 3 |
| 27/09/2016 | 3 |
| 27/09/2016 | 3 |
| 27/09/2016 | 2.9 |
| 27/09/2016 | 2.7 |
| 27/09/2016 | 2.3 |
| 27/09/2016 | 2 |
| 27/09/2016 | 2 |
| 28/09/2016 | 1.9 |
| 28/09/2016 | 1.8 |
| 28/09/2016 | 1.8 |
| 28/09/2016 | 2 |
| 28/09/2016 | 2 |
| 28/09/2016 | 2.4 |
| 28/09/2016 | 2.7 |
| 28/09/2016 | 2.9 |
| 28/09/2016 | 3 |
| 28/09/2016 | 3 |
| 28/09/2016 | 3 |
| 28/09/2016 | 3.1 |
| 28/09/2016 | 3.1 |
| 28/09/2016 | 3 |
| 28/09/2016 | 2.9 |
| 28/09/2016 | 3 |
| 28/09/2016 | 3 |
| 28/09/2016 | 3 |
| 28/09/2016 | 3 |
| 28/09/2016 | 2.9 |
| 28/09/2016 | 2.7 |
| 28/09/2016 | 2.3 |
| 28/09/2016 | 2.1 |
| 28/09/2016 | 1.8 |
| 29/09/2016 | 1.9 |
| 29/09/2016 | 1.8 |
| 29/09/2016 | 1.8 |
| 29/09/2016 | 1.8 |
| 29/09/2016 | 2 |
| 29/09/2016 | 2.4 |
| 29/09/2016 | 2.7 |
| 29/09/2016 | 2.8 |
| 29/09/2016 | 3 |
| 29/09/2016 | 2.9 |
| 29/09/2016 | 3 |
| 29/09/2016 | 3 |
| 29/09/2016 | 2.8 |
| 29/09/2016 | 2.8 |
| 29/09/2016 | 2.8 |
| 29/09/2016 | 2.8 |
| 29/09/2016 | 2.9 |
| 29/09/2016 | 2.8 |
| 29/09/2016 | 3 |
| 29/09/2016 | 2.8 |
| 29/09/2016 | 2.4 |
| 29/09/2016 | 2.3 |
| 29/09/2016 | 2.1 |
| 29/09/2016 | 1.8 |
| 30/09/2016 | 1.8 |
| 30/09/2016 | 1.8 |
| 30/09/2016 | 1.8 |
| 30/09/2016 | 1.8 |
| 30/09/2016 | 2 |
| 30/09/2016 | 2.4 |
| 30/09/2016 | 2.7 |
| 30/09/2016 | 2.8 |
| 30/09/2016 | 3 |
| 30/09/2016 | 3 |
| 30/09/2016 | 3 |
| 30/09/2016 | 3 |
| 30/09/2016 | 2.9 |
| 30/09/2016 | 3 |
| 30/09/2016 | 2.9 |
| 30/09/2016 | 2.8 |
| 30/09/2016 | 2.8 |
| 30/09/2016 | 2.9 |
| 30/09/2016 | 2.9 |
| 30/09/2016 | 2.7 |
| 30/09/2016 | 2.4 |
| 30/09/2016 | 2.2 |
| 30/09/2016 | 2.1 |
| 30/09/2016 | 1.9 |
| 01/10/2016 | 1.9 |
| 01/10/2016 | 1.8 |
| 01/10/2016 | 1.8 |
| 01/10/2016 | 1.8 |
| 01/10/2016 | 1.8 |
| 01/10/2016 | 1.8 |
| 01/10/2016 | 2.1 |
| 01/10/2016 | 2.1 |
| 01/10/2016 | 2.3 |
| 01/10/2016 | 2.5 |
| 01/10/2016 | 2.5 |
| 01/10/2016 | 2.5 |
| 01/10/2016 | 2.4 |
| 01/10/2016 | 2.4 |
| 01/10/2016 | 2.4 |
| 01/10/2016 | 2.4 |
| 01/10/2016 | 2.4 |
| 01/10/2016 | 2.6 |
| 01/10/2016 | 2.7 |
| 01/10/2016 | 2.4 |
| 01/10/2016 | 2.3 |
| 01/10/2016 | 2.1 |
| 01/10/2016 | 2.1 |
| 01/10/2016 | 1.8 |
| 02/10/2016 | 1.8 |
| 02/10/2016 | 1.8 |
| 02/10/2016 | 1.8 |
| 02/10/2016 | 1.8 |
| 02/10/2016 | 1.8 |
| 02/10/2016 | 1.8 |
| 02/10/2016 | 1.8 |
| 02/10/2016 | 2 |
| 02/10/2016 | 2.1 |
| 02/10/2016 | 2.3 |
| 02/10/2016 | 2.4 |
| 02/10/2016 | 2.4 |
| 02/10/2016 | 2.4 |
| 02/10/2016 | 2.4 |
| 02/10/2016 | 2.2 |
| 02/10/2016 | 2.2 |
| 02/10/2016 | 2.4 |
| 02/10/2016 | 2.4 |
| 02/10/2016 | 2.4 |
| 02/10/2016 | 2.4 |
| 02/10/2016 | 2.4 |
| 02/10/2016 | 2.1 |
| 02/10/2016 | 1.9 |
| 02/10/2016 | 2 |
| 03/10/2016 | 1.8 |
| 03/10/2016 | 1.8 |
| 03/10/2016 | 1.8 |
| 03/10/2016 | 1.8 |
| 03/10/2016 | 1.8 |
| 03/10/2016 | 1.9 |
| 03/10/2016 | 1.9 |
| 03/10/2016 | 2.1 |
| 03/10/2016 | 2.1 |
| 03/10/2016 | 2.4 |
| 03/10/2016 | 2.5 |
| 03/10/2016 | 2.5 |
| 03/10/2016 | 2.4 |
| 03/10/2016 | 2.4 |
| 03/10/2016 | 2.4 |
| 03/10/2016 | 2.4 |
| 03/10/2016 | 2.3 |
| 03/10/2016 | 2.4 |
| 03/10/2016 | 2.4 |
| 03/10/2016 | 2.4 |
| 03/10/2016 | 2.3 |
| 03/10/2016 | 2 |
| 03/10/2016 | 2 |
| 03/10/2016 | 2 |
| 04/10/2016 | 1.9 |
| 04/10/2016 | 1.8 |
| 04/10/2016 | 1.8 |
| 04/10/2016 | 1.8 |
| 04/10/2016 | 2 |
| 04/10/2016 | 2.3 |
| 04/10/2016 | 2.6 |
| 04/10/2016 | 2.9 |
| 04/10/2016 | 3 |
| 04/10/2016 | 3 |
| 04/10/2016 | 3 |
| 04/10/2016 | 3 |
| 04/10/2016 | 3 |
| 04/10/2016 | 3 |
| 04/10/2016 | 2.8 |
| 04/10/2016 | 3 |
| 04/10/2016 | 3 |
| 04/10/2016 | 3 |
| 04/10/2016 | 3 |
| 04/10/2016 | 2.9 |
| 04/10/2016 | 2.5 |
| 04/10/2016 | 2.3 |
| 04/10/2016 | 2.1 |
| 04/10/2016 | 1.9 |
| 05/10/2016 | 1.8 |
| 05/10/2016 | 1.8 |
| 05/10/2016 | 1.9 |
| 05/10/2016 | 1.8 |
| 05/10/2016 | 2 |
| 05/10/2016 | 2.4 |
| 05/10/2016 | 2.7 |
| 05/10/2016 | 2.8 |
| 05/10/2016 | 3 |
| 05/10/2016 | 3 |
| 05/10/2016 | 3.1 |
| 05/10/2016 | 3.1 |
| 05/10/2016 | 3.1 |
| 05/10/2016 | 3.1 |
| 05/10/2016 | 2.9 |
| 05/10/2016 | 3 |
| 05/10/2016 | 3 |
| 05/10/2016 | 3 |
| 05/10/2016 | 3.1 |
| 05/10/2016 | 2.9 |
| 05/10/2016 | 2.5 |
| 05/10/2016 | 2.3 |
| 05/10/2016 | 2.1 |
| 05/10/2016 | 1.9 |
| 06/10/2016 | 1.8 |
| 06/10/2016 | 1.8 |
| 06/10/2016 | 1.8 |
| 06/10/2016 | 1.8 |
| 06/10/2016 | 2 |
| 06/10/2016 | 2.4 |
| 06/10/2016 | 2.7 |
| 06/10/2016 | 2.8 |
| 06/10/2016 | 2.9 |
| 06/10/2016 | 3 |
| 06/10/2016 | 3 |
| 06/10/2016 | 3 |
| 06/10/2016 | 2.9 |
| 06/10/2016 | 2.8 |
| 06/10/2016 | 2.8 |
| 06/10/2016 | 2.7 |
| 06/10/2016 | 2.9 |
| 06/10/2016 | 3 |
| 06/10/2016 | 3 |
| 06/10/2016 | 2.8 |
| 06/10/2016 | 2.4 |
| 06/10/2016 | 2.3 |
| 06/10/2016 | 2.1 |
| 06/10/2016 | 1.9 |
| 07/10/2016 | 1.8 |
| 07/10/2016 | 1.8 |
| 07/10/2016 | 1.7 |
| 07/10/2016 | 1.8 |
| 07/10/2016 | 2 |
| 07/10/2016 | 2.3 |
| 07/10/2016 | 2.6 |
| 07/10/2016 | 2.8 |
| 07/10/2016 | 2.9 |
| 07/10/2016 | 3 |
| 07/10/2016 | 3 |
| 07/10/2016 | 3 |
| 07/10/2016 | 2.9 |
| 07/10/2016 | 3 |
| 07/10/2016 | 2.9 |
| 07/10/2016 | 2.8 |
| 07/10/2016 | 3 |
| 07/10/2016 | 3 |
| 07/10/2016 | 3 |
| 07/10/2016 | 2.7 |
| 07/10/2016 | 2.4 |
| 07/10/2016 | 2.2 |
| 07/10/2016 | 2 |
| 07/10/2016 | 1.8 |
| 08/10/2016 | 1.8 |
| 08/10/2016 | 1.7 |
| 08/10/2016 | 1.8 |
| 08/10/2016 | 1.8 |
| 08/10/2016 | 1.8 |
| 08/10/2016 | 1.9 |
| 08/10/2016 | 2 |
| 08/10/2016 | 2.2 |
| 08/10/2016 | 2.4 |
| 08/10/2016 | 2.4 |
| 08/10/2016 | 2.6 |
| 08/10/2016 | 2.6 |
| 08/10/2016 | 2.4 |
| 08/10/2016 | 2.5 |
| 08/10/2016 | 2.4 |
| 08/10/2016 | 2.4 |
| 08/10/2016 | 2.5 |
| 08/10/2016 | 2.5 |
| 08/10/2016 | 2.7 |
| 08/10/2016 | 2.5 |
| 08/10/2016 | 2.3 |
| 08/10/2016 | 2.2 |
| 08/10/2016 | 2 |
| 08/10/2016 | 1.8 |
| 09/10/2016 | 1.8 |
| 09/10/2016 | 1.8 |
| 09/10/2016 | 1.8 |
| 09/10/2016 | 1.8 |
| 09/10/2016 | 1.8 |
| 09/10/2016 | 1.9 |
| 09/10/2016 | 1.9 |
| 09/10/2016 | 2.1 |
| 09/10/2016 | 2.2 |
| 09/10/2016 | 2.4 |
| 09/10/2016 | 2.4 |
| 09/10/2016 | 2.4 |
| 09/10/2016 | 2.4 |
| 09/10/2016 | 2.4 |
| 09/10/2016 | 2.3 |
| 09/10/2016 | 2.3 |
| 09/10/2016 | 2.4 |
| 09/10/2016 | 2.5 |
| 09/10/2016 | 2.6 |
| 09/10/2016 | 2.4 |
| 09/10/2016 | 2.2 |
| 09/10/2016 | 2.1 |
| 09/10/2016 | 2 |
| 09/10/2016 | 1.9 |
| 10/10/2016 | 1.8 |
| 10/10/2016 | 1.7 |
| 10/10/2016 | 1.8 |
| 10/10/2016 | 1.8 |
| 10/10/2016 | 2 |
| 10/10/2016 | 2.4 |
| 10/10/2016 | 2.7 |
| 10/10/2016 | 2.8 |
| 10/10/2016 | 2.9 |
| 10/10/2016 | 3 |
| 10/10/2016 | 3 |
| 10/10/2016 | 3 |
| 10/10/2016 | 3 |
| 10/10/2016 | 3 |
| 10/10/2016 | 3 |
| 10/10/2016 | 2.9 |
| 10/10/2016 | 3 |
| 10/10/2016 | 3 |
| 10/10/2016 | 3.1 |
| 10/10/2016 | 2.8 |
| 10/10/2016 | 2.4 |
| 10/10/2016 | 2.3 |
| 10/10/2016 | 2.1 |
| 10/10/2016 | 1.8 |
| 11/10/2016 | 1.8 |
| 11/10/2016 | 1.7 |
| 11/10/2016 | 1.8 |
| 11/10/2016 | 1.8 |
| 11/10/2016 | 2 |
| 11/10/2016 | 2.4 |
| 11/10/2016 | 2.7 |
| 11/10/2016 | 2.8 |
| 11/10/2016 | 2.9 |
| 11/10/2016 | 3 |
| 11/10/2016 | 3 |
| 11/10/2016 | 3 |
| 11/10/2016 | 3 |
| 11/10/2016 | 3 |
| 11/10/2016 | 2.9 |
| 11/10/2016 | 2.9 |
| 11/10/2016 | 3.1 |
| 11/10/2016 | 3.1 |
| 11/10/2016 | 3.1 |
| 11/10/2016 | 2.9 |
| 11/10/2016 | 2.5 |
| 11/10/2016 | 2.1 |
| 11/10/2016 | 2.1 |
| 11/10/2016 | 1.9 |
| 12/10/2016 | 1.8 |
| 12/10/2016 | 1.8 |
| 12/10/2016 | 1.8 |
| 12/10/2016 | 1.8 |
| 12/10/2016 | 2.1 |
| 12/10/2016 | 2.4 |
| 12/10/2016 | 2.7 |
| 12/10/2016 | 3 |
| 12/10/2016 | 3 |
| 12/10/2016 | 3.1 |
| 12/10/2016 | 3.2 |
| 12/10/2016 | 3.2 |
| 12/10/2016 | 3 |
| 12/10/2016 | 3 |
| 12/10/2016 | 3 |
| 12/10/2016 | 2.9 |
| 12/10/2016 | 3 |
| 12/10/2016 | 3 |
| 12/10/2016 | 3.2 |
| 12/10/2016 | 2.9 |
| 12/10/2016 | 2.5 |
| 12/10/2016 | 2.2 |
| 12/10/2016 | 2.1 |
| 12/10/2016 | 1.9 |
| 13/10/2016 | 1.8 |
| 13/10/2016 | 1.8 |
| 13/10/2016 | 1.8 |
| 13/10/2016 | 1.8 |
| 13/10/2016 | 2.1 |
| 13/10/2016 | 2.4 |
| 13/10/2016 | 2.7 |
| 13/10/2016 | 2.9 |
| 13/10/2016 | 3 |
| 13/10/2016 | 3 |
| 13/10/2016 | 3 |
| 13/10/2016 | 3 |
| 13/10/2016 | 2.9 |
| 13/10/2016 | 2.9 |
| 13/10/2016 | 2.9 |
| 13/10/2016 | 2.8 |
| 13/10/2016 | 2.9 |
| 13/10/2016 | 3 |
| 13/10/2016 | 3.1 |
| 13/10/2016 | 2.7 |
| 13/10/2016 | 2.5 |
| 13/10/2016 | 2.2 |
| 13/10/2016 | 2.1 |
| 13/10/2016 | 1.9 |
| 14/10/2016 | 1.8 |
| 14/10/2016 | 1.8 |
| 14/10/2016 | 1.8 |
| 14/10/2016 | 1.8 |
| 14/10/2016 | 2 |
| 14/10/2016 | 2.4 |
| 14/10/2016 | 2.6 |
| 14/10/2016 | 2.9 |
| 14/10/2016 | 3 |
| 14/10/2016 | 3 |
| 14/10/2016 | 3.1 |
| 14/10/2016 | 3 |
| 14/10/2016 | 3 |
| 14/10/2016 | 2.8 |
| 14/10/2016 | 2.8 |
| 14/10/2016 | 2.9 |
| 14/10/2016 | 2.9 |
| 14/10/2016 | 3 |
| 14/10/2016 | 3 |
| 14/10/2016 | 2.7 |
| 14/10/2016 | 2.4 |
| 14/10/2016 | 2.3 |
| 14/10/2016 | 2.1 |
| 14/10/2016 | 1.8 |
| 15/10/2016 | 1.8 |
| 15/10/2016 | 1.8 |
| 15/10/2016 | 1.8 |
| 15/10/2016 | 1.8 |
| 15/10/2016 | 1.8 |
| 15/10/2016 | 2 |
| 15/10/2016 | 2.1 |
| 15/10/2016 | 2.1 |
| 15/10/2016 | 2.4 |
| 15/10/2016 | 2.5 |
| 15/10/2016 | 2.5 |
| 15/10/2016 | 2.6 |
| 15/10/2016 | 2.4 |
| 15/10/2016 | 2.4 |
| 15/10/2016 | 2.4 |
| 15/10/2016 | 2.4 |
| 15/10/2016 | 2.4 |
| 15/10/2016 | 2.7 |
| 15/10/2016 | 2.7 |
| 15/10/2016 | 2.5 |
| 15/10/2016 | 2.3 |
| 15/10/2016 | 2.1 |
| 15/10/2016 | 2 |
| 15/10/2016 | 1.9 |
| 16/10/2016 | 1.7 |
| 16/10/2016 | 1.7 |
| 16/10/2016 | 1.8 |
| 16/10/2016 | 1.8 |
| 16/10/2016 | 1.7 |
| 16/10/2016 | 1.8 |
| 16/10/2016 | 2 |
| 16/10/2016 | 2 |
| 16/10/2016 | 2.1 |
| 16/10/2016 | 2.4 |
| 16/10/2016 | 2.4 |
| 16/10/2016 | 2.5 |
| 16/10/2016 | 2.4 |
| 16/10/2016 | 2.4 |
| 16/10/2016 | 2.3 |
| 16/10/2016 | 2.4 |
| 16/10/2016 | 2.4 |
| 16/10/2016 | 2.6 |
| 16/10/2016 | 2.6 |
| 16/10/2016 | 2.4 |
| 16/10/2016 | 2.2 |
| 16/10/2016 | 2.1 |
| 16/10/2016 | 2 |
| 16/10/2016 | 1.9 |
| 17/10/2016 | 1.8 |
| 17/10/2016 | 1.7 |
| 17/10/2016 | 1.8 |
| 17/10/2016 | 1.8 |
| 17/10/2016 | 1.9 |
| 17/10/2016 | 2.3 |
| 17/10/2016 | 2.5 |
| 17/10/2016 | 2.7 |
| 17/10/2016 | 2.9 |
| 17/10/2016 | 2.9 |
| 17/10/2016 | 3 |
| 17/10/2016 | 3 |
| 17/10/2016 | 3 |
| 17/10/2016 | 2.9 |
| 17/10/2016 | 2.9 |
| 17/10/2016 | 2.9 |
| 17/10/2016 | 3 |
| 17/10/2016 | 3 |
| 17/10/2016 | 2.9 |
| 17/10/2016 | 2.7 |
| 17/10/2016 | 2.4 |
| 17/10/2016 | 2.2 |
| 17/10/2016 | 2.1 |
| 17/10/2016 | 1.8 |
| 18/10/2016 | 1.8 |
| 18/10/2016 | 1.8 |
| 18/10/2016 | 1.8 |
| 18/10/2016 | 1.8 |
| 18/10/2016 | 1.9 |
| 18/10/2016 | 2.3 |
| 18/10/2016 | 2.5 |
| 18/10/2016 | 2.7 |
| 18/10/2016 | 2.9 |
| 18/10/2016 | 3 |
| 18/10/2016 | 3 |
| 18/10/2016 | 2.9 |
| 18/10/2016 | 2.9 |
| 18/10/2016 | 2.7 |
| 18/10/2016 | 2.7 |
| 18/10/2016 | 2.8 |
| 18/10/2016 | 3 |
| 18/10/2016 | 3.1 |
| 18/10/2016 | 3 |
| 18/10/2016 | 2.8 |
| 18/10/2016 | 2.5 |
| 18/10/2016 | 2.3 |
| 18/10/2016 | 2.1 |
| 18/10/2016 | 1.9 |
| 19/10/2016 | 1.8 |
| 19/10/2016 | 1.8 |
| 19/10/2016 | 1.8 |
| 19/10/2016 | 1.8 |
| 19/10/2016 | 2 |
| 19/10/2016 | 2.4 |
| 19/10/2016 | 2.7 |
| 19/10/2016 | 2.8 |
| 19/10/2016 | 3 |
| 19/10/2016 | 3 |
| 19/10/2016 | 3 |
| 19/10/2016 | 3 |
| 19/10/2016 | 3 |
| 19/10/2016 | 2.9 |
| 19/10/2016 | 2.8 |
| 19/10/2016 | 2.9 |
| 19/10/2016 | 3 |
| 19/10/2016 | 3 |
| 19/10/2016 | 3 |
| 19/10/2016 | 2.8 |
| 19/10/2016 | 2.5 |
| 19/10/2016 | 2.1 |
| 19/10/2016 | 2 |
| 19/10/2016 | 1.9 |
| 20/10/2016 | 1.8 |
| 20/10/2016 | 1.8 |
| 20/10/2016 | 1.8 |
| 20/10/2016 | 1.8 |
| 20/10/2016 | 2 |
| 20/10/2016 | 2.3 |
| 20/10/2016 | 2.6 |
| 20/10/2016 | 2.8 |
| 20/10/2016 | 3 |
| 20/10/2016 | 3 |
| 20/10/2016 | 3 |
| 20/10/2016 | 3 |
| 20/10/2016 | 2.9 |
| 20/10/2016 | 2.8 |
| 20/10/2016 | 2.8 |
| 20/10/2016 | 2.8 |
| 20/10/2016 | 3 |
| 20/10/2016 | 3 |
| 20/10/2016 | 2.8 |
| 20/10/2016 | 2.6 |
| 20/10/2016 | 2.3 |
| 20/10/2016 | 2.1 |
| 20/10/2016 | 2 |
| 20/10/2016 | 1.8 |
| 21/10/2016 | 1.8 |
| 21/10/2016 | 1.8 |
| 21/10/2016 | 1.8 |
| 21/10/2016 | 1.8 |
| 21/10/2016 | 1.9 |
| 21/10/2016 | 2.3 |
| 21/10/2016 | 2.6 |
| 21/10/2016 | 2.8 |
| 21/10/2016 | 3 |
| 21/10/2016 | 3 |
| 21/10/2016 | 3 |
| 21/10/2016 | 3 |
| 21/10/2016 | 2.8 |
| 21/10/2016 | 2.8 |
| 21/10/2016 | 2.8 |
| 21/10/2016 | 2.8 |
| 21/10/2016 | 2.9 |
| 21/10/2016 | 3 |
| 21/10/2016 | 2.9 |
| 21/10/2016 | 2.6 |
| 21/10/2016 | 2.3 |
| 21/10/2016 | 2.1 |
| 21/10/2016 | 2.1 |
| 21/10/2016 | 1.9 |
| 22/10/2016 | 1.8 |
| 22/10/2016 | 1.8 |
| 22/10/2016 | 1.8 |
| 22/10/2016 | 1.8 |
| 22/10/2016 | 1.8 |
| 22/10/2016 | 1.9 |
| 22/10/2016 | 2 |
| 22/10/2016 | 2.1 |
| 22/10/2016 | 2.4 |
| 22/10/2016 | 2.4 |
| 22/10/2016 | 2.6 |
| 22/10/2016 | 2.6 |
| 22/10/2016 | 2.4 |
| 22/10/2016 | 2.4 |
| 22/10/2016 | 2.3 |
| 22/10/2016 | 2.4 |
| 22/10/2016 | 2.4 |
| 22/10/2016 | 2.6 |
| 22/10/2016 | 2.6 |
| 22/10/2016 | 2.4 |
| 22/10/2016 | 2.2 |
| 22/10/2016 | 2.1 |
| 22/10/2016 | 2.1 |
| 22/10/2016 | 1.8 |
| 23/10/2016 | 1.8 |
| 23/10/2016 | 1.8 |
| 23/10/2016 | 1.8 |
| 23/10/2016 | 1.8 |
| 23/10/2016 | 1.8 |
| 23/10/2016 | 1.8 |
| 23/10/2016 | 1.8 |
| 23/10/2016 | 2 |
| 23/10/2016 | 2.2 |
| 23/10/2016 | 2.4 |
| 23/10/2016 | 2.4 |
| 23/10/2016 | 2.5 |
| 23/10/2016 | 2.4 |
| 23/10/2016 | 2.3 |
| 23/10/2016 | 2.2 |
| 23/10/2016 | 2.4 |
| 23/10/2016 | 2.4 |
| 23/10/2016 | 2.5 |
| 23/10/2016 | 2.5 |
| 23/10/2016 | 2.4 |
| 23/10/2016 | 2.1 |
| 23/10/2016 | 2.1 |
| 23/10/2016 | 1.9 |
| 23/10/2016 | 1.8 |
| 24/10/2016 | 1.8 |
| 24/10/2016 | 1.8 |
| 24/10/2016 | 1.8 |
| 24/10/2016 | 1.8 |
| 24/10/2016 | 2 |
| 24/10/2016 | 2.2 |
| 24/10/2016 | 2.6 |
| 24/10/2016 | 2.9 |
| 24/10/2016 | 3 |
| 24/10/2016 | 3.1 |
| 24/10/2016 | 3 |
| 24/10/2016 | 3 |
| 24/10/2016 | 3 |
| 24/10/2016 | 2.9 |
| 24/10/2016 | 2.8 |
| 24/10/2016 | 2.9 |
| 24/10/2016 | 3 |
| 24/10/2016 | 3 |
| 24/10/2016 | 3 |
| 24/10/2016 | 2.7 |
| 24/10/2016 | 2.4 |
| 24/10/2016 | 2.2 |
| 24/10/2016 | 2 |
| 24/10/2016 | 2 |
| 25/10/2016 | 1.8 |
| 25/10/2016 | 1.8 |
| 25/10/2016 | 1.8 |
| 25/10/2016 | 1.8 |
| 25/10/2016 | 2 |
| 25/10/2016 | 2.2 |
| 25/10/2016 | 2.6 |
| 25/10/2016 | 2.9 |
| 25/10/2016 | 3 |
| 25/10/2016 | 3.1 |
| 25/10/2016 | 3 |
| 25/10/2016 | 3 |
| 25/10/2016 | 3 |
| 25/10/2016 | 2.9 |
| 25/10/2016 | 2.9 |
| 25/10/2016 | 3 |
| 25/10/2016 | 3 |
| 25/10/2016 | 3.2 |
| 25/10/2016 | 3 |
| 25/10/2016 | 2.9 |
| 25/10/2016 | 2.5 |
| 25/10/2016 | 2.3 |
| 25/10/2016 | 2.1 |
| 25/10/2016 | 1.9 |
| 26/10/2016 | 1.9 |
| 26/10/2016 | 1.8 |
| 26/10/2016 | 1.8 |
| 26/10/2016 | 1.9 |
| 26/10/2016 | 2.1 |
| 26/10/2016 | 2.3 |
| 26/10/2016 | 2.7 |
| 26/10/2016 | 2.9 |
| 26/10/2016 | 3 |
| 26/10/2016 | 3.1 |
| 26/10/2016 | 3.2 |
| 26/10/2016 | 3.2 |
| 26/10/2016 | 3.1 |
| 26/10/2016 | 3 |
| 26/10/2016 | 2.9 |
| 26/10/2016 | 3 |
| 26/10/2016 | 3 |
| 26/10/2016 | 3.1 |
| 26/10/2016 | 3 |
| 26/10/2016 | 2.7 |
| 26/10/2016 | 2.5 |
| 26/10/2016 | 2.2 |
| 26/10/2016 | 2.1 |
| 26/10/2016 | 1.9 |
| 27/10/2016 | 1.8 |
| 27/10/2016 | 1.9 |
| 27/10/2016 | 1.8 |
| 27/10/2016 | 1.9 |
| 27/10/2016 | 2.1 |
| 27/10/2016 | 2.3 |
| 27/10/2016 | 2.7 |
| 27/10/2016 | 2.8 |
| 27/10/2016 | 3 |
| 27/10/2016 | 3 |
| 27/10/2016 | 3.1 |
| 27/10/2016 | 3.1 |
| 27/10/2016 | 2.9 |
| 27/10/2016 | 2.8 |
| 27/10/2016 | 2.8 |
| 27/10/2016 | 2.8 |
| 27/10/2016 | 3 |
| 27/10/2016 | 3 |
| 27/10/2016 | 3 |
| 27/10/2016 | 2.7 |
| 27/10/2016 | 2.4 |
| 27/10/2016 | 2.2 |
| 27/10/2016 | 2 |
| 27/10/2016 | 1.9 |
| 28/10/2016 | 1.8 |
| 28/10/2016 | 1.8 |
| 28/10/2016 | 1.8 |
| 28/10/2016 | 1.9 |
| 28/10/2016 | 2 |
| 28/10/2016 | 2.2 |
| 28/10/2016 | 2.6 |
| 28/10/2016 | 2.8 |
| 28/10/2016 | 3 |
| 28/10/2016 | 3.1 |
| 28/10/2016 | 3.2 |
| 28/10/2016 | 3.1 |
| 28/10/2016 | 3 |
| 28/10/2016 | 3 |
| 28/10/2016 | 2.8 |
| 28/10/2016 | 3 |
| 28/10/2016 | 2.9 |
| 28/10/2016 | 3 |
| 28/10/2016 | 2.9 |
| 28/10/2016 | 2.7 |
| 28/10/2016 | 2.4 |
| 28/10/2016 | 2.3 |
| 28/10/2016 | 2.1 |
| 28/10/2016 | 1.9 |
| 29/10/2016 | 1.8 |
| 29/10/2016 | 1.8 |
| 29/10/2016 | 1.8 |
| 29/10/2016 | 1.8 |
| 29/10/2016 | 1.8 |
| 29/10/2016 | 2 |
| 29/10/2016 | 2.1 |
| 29/10/2016 | 2.3 |
| 29/10/2016 | 2.4 |
| 29/10/2016 | 2.7 |
| 29/10/2016 | 2.7 |
| 29/10/2016 | 2.7 |
| 29/10/2016 | 2.7 |
| 29/10/2016 | 2.6 |
| 29/10/2016 | 2.5 |
| 29/10/2016 | 2.5 |
| 29/10/2016 | 2.7 |
| 29/10/2016 | 2.7 |
| 29/10/2016 | 2.9 |
| 29/10/2016 | 2.5 |
| 29/10/2016 | 2.4 |
| 29/10/2016 | 2.2 |
| 29/10/2016 | 2.1 |
| 29/10/2016 | 1.8 |
| 30/10/2016 | 1.8 |
| 30/10/2016 | 1.8 |
| 30/10/2016 | 1.8 |
| 30/10/2016 | 1.7 |
| 30/10/2016 | 1.7 |
| 30/10/2016 | 1.8 |
| 30/10/2016 | 1.8 |
| 30/10/2016 | 1.9 |
| 30/10/2016 | 2 |
| 30/10/2016 | 2.2 |
| 30/10/2016 | 2.4 |
| 30/10/2016 | 2.4 |
| 30/10/2016 | 2.5 |
| 30/10/2016 | 2.4 |
| 30/10/2016 | 2.4 |
| 30/10/2016 | 2.4 |
| 30/10/2016 | 2.6 |
| 30/10/2016 | 2.7 |
| 30/10/2016 | 2.7 |
| 30/10/2016 | 2.6 |
| 30/10/2016 | 2.5 |
| 30/10/2016 | 2.3 |
| 30/10/2016 | 2.1 |
| 30/10/2016 | 1.9 |
| 30/10/2016 | 1.9 |
| 31/10/2016 | 1.8 |
| 31/10/2016 | 1.8 |
| 31/10/2016 | 1.8 |
| 31/10/2016 | 1.9 |
| 31/10/2016 | 2 |
| 31/10/2016 | 2.4 |
| 31/10/2016 | 2.7 |
| 31/10/2016 | 2.9 |
| 31/10/2016 | 2.9 |
| 31/10/2016 | 3 |
| 31/10/2016 | 3 |
| 31/10/2016 | 3 |
| 31/10/2016 | 3.1 |
| 31/10/2016 | 3 |
| 31/10/2016 | 3 |
| 31/10/2016 | 3.1 |
| 31/10/2016 | 3.2 |
| 31/10/2016 | 3.2 |
| 31/10/2016 | 3 |
| 31/10/2016 | 2.9 |
| 31/10/2016 | 2.6 |
| 31/10/2016 | 2.3 |
| 31/10/2016 | 2 |
| 31/10/2016 | 1.8 |
| 01/11/2016 | 1.8 |
| 01/11/2016 | 1.8 |
| 01/11/2016 | 1.8 |
| 01/11/2016 | 1.8 |
| 01/11/2016 | 2 |
| 01/11/2016 | 2.4 |
| 01/11/2016 | 2.7 |
| 01/11/2016 | 2.9 |
| 01/11/2016 | 2.9 |
| 01/11/2016 | 3.1 |
| 01/11/2016 | 3 |
| 01/11/2016 | 3 |
| 01/11/2016 | 3 |
| 01/11/2016 | 3.1 |
| 01/11/2016 | 3.1 |
| 01/11/2016 | 3.2 |
| 01/11/2016 | 3.5 |
| 01/11/2016 | 3.2 |
| 01/11/2016 | 3.1 |
| 01/11/2016 | 2.9 |
| 01/11/2016 | 2.5 |
| 01/11/2016 | 2.2 |
| 01/11/2016 | 2.1 |
| 01/11/2016 | 1.9 |
| 02/11/2016 | 1.8 |
| 02/11/2016 | 1.8 |
| 02/11/2016 | 1.9 |
| 02/11/2016 | 1.8 |
| 02/11/2016 | 2.1 |
| 02/11/2016 | 2.5 |
| 02/11/2016 | 2.8 |
| 02/11/2016 | 3 |
| 02/11/2016 | 3 |
| 02/11/2016 | 3.1 |
| 02/11/2016 | 3.2 |
| 02/11/2016 | 3.2 |
| 02/11/2016 | 3.2 |
| 02/11/2016 | 3.1 |
| 02/11/2016 | 3.1 |
| 02/11/2016 | 3.2 |
| 02/11/2016 | 3.3 |
| 02/11/2016 | 3.2 |
| 02/11/2016 | 3.2 |
| 02/11/2016 | 2.9 |
| 02/11/2016 | 2.6 |
| 02/11/2016 | 2.3 |
| 02/11/2016 | 2.1 |
| 02/11/2016 | 2 |
| 03/11/2016 | 1.8 |
| 03/11/2016 | 1.8 |
| 03/11/2016 | 1.9 |
| 03/11/2016 | 1.8 |
| 03/11/2016 | 2.1 |
| 03/11/2016 | 2.4 |
| 03/11/2016 | 2.7 |
| 03/11/2016 | 3 |
| 03/11/2016 | 3 |
| 03/11/2016 | 3 |
| 03/11/2016 | 3.1 |
| 03/11/2016 | 3.1 |
| 03/11/2016 | 3.1 |
| 03/11/2016 | 3 |
| 03/11/2016 | 3 |
| 03/11/2016 | 3.1 |
| 03/11/2016 | 3.2 |
| 03/11/2016 | 3.2 |
| 03/11/2016 | 3.1 |
| 03/11/2016 | 2.8 |
| 03/11/2016 | 2.5 |
| 03/11/2016 | 2.3 |
| 03/11/2016 | 2.1 |
| 03/11/2016 | 2 |
| 04/11/2016 | 1.8 |
| 04/11/2016 | 1.8 |
| 04/11/2016 | 1.8 |
| 04/11/2016 | 1.8 |
| 04/11/2016 | 2.1 |
| 04/11/2016 | 2.4 |
| 04/11/2016 | 2.7 |
| 04/11/2016 | 3 |
| 04/11/2016 | 3 |
| 04/11/2016 | 3.1 |
| 04/11/2016 | 3.2 |
| 04/11/2016 | 3.1 |
| 04/11/2016 | 3 |
| 04/11/2016 | 3 |
| 04/11/2016 | 3 |
| 04/11/2016 | 3.2 |
| 04/11/2016 | 3.3 |
| 04/11/2016 | 3.1 |
| 04/11/2016 | 3 |
| 04/11/2016 | 2.8 |
| 04/11/2016 | 2.5 |
| 04/11/2016 | 2.2 |
| 04/11/2016 | 2.1 |
| 04/11/2016 | 1.9 |
| 05/11/2016 | 1.8 |
| 05/11/2016 | 1.8 |
| 05/11/2016 | 1.8 |
| 05/11/2016 | 1.8 |
| 05/11/2016 | 1.8 |
| 05/11/2016 | 2 |
| 05/11/2016 | 2.1 |
| 05/11/2016 | 2.3 |
| 05/11/2016 | 2.4 |
| 05/11/2016 | 2.7 |
| 05/11/2016 | 2.7 |
| 05/11/2016 | 2.7 |
| 05/11/2016 | 2.6 |
| 05/11/2016 | 2.5 |
| 05/11/2016 | 2.5 |
| 05/11/2016 | 2.7 |
| 05/11/2016 | 2.9 |
| 05/11/2016 | 2.8 |
| 05/11/2016 | 2.7 |
| 05/11/2016 | 2.5 |
| 05/11/2016 | 2.4 |
| 05/11/2016 | 2.2 |
| 05/11/2016 | 2.1 |
| 05/11/2016 | 2 |
| 06/11/2016 | 1.8 |
| 06/11/2016 | 1.8 |
| 06/11/2016 | 1.8 |
| 06/11/2016 | 1.8 |
| 06/11/2016 | 1.8 |
| 06/11/2016 | 1.8 |
| 06/11/2016 | 1.8 |
| 06/11/2016 | 2.1 |
| 06/11/2016 | 2.3 |
| 06/11/2016 | 2.4 |
| 06/11/2016 | 2.4 |
| 06/11/2016 | 2.6 |
| 06/11/2016 | 2.5 |
| 06/11/2016 | 2.5 |
| 06/11/2016 | 2.4 |
| 06/11/2016 | 2.7 |
| 06/11/2016 | 2.7 |
| 06/11/2016 | 2.7 |
| 06/11/2016 | 2.5 |
| 06/11/2016 | 2.5 |
| 06/11/2016 | 2.4 |
| 06/11/2016 | 2.1 |
| 06/11/2016 | 2.1 |
| 06/11/2016 | 1.8 |
| 07/11/2016 | 1.8 |
| 07/11/2016 | 1.8 |
| 07/11/2016 | 1.8 |
| 07/11/2016 | 1.8 |
| 07/11/2016 | 2.1 |
| 07/11/2016 | 2.4 |
| 07/11/2016 | 2.7 |
| 07/11/2016 | 2.9 |
| 07/11/2016 | 3 |
| 07/11/2016 | 3 |
| 07/11/2016 | 3.2 |
| 07/11/2016 | 3.2 |
| 07/11/2016 | 3.2 |
| 07/11/2016 | 3.2 |
| 07/11/2016 | 3.2 |
| 07/11/2016 | 3.3 |
| 07/11/2016 | 3.3 |
| 07/11/2016 | 3.2 |
| 07/11/2016 | 3.2 |
| 07/11/2016 | 2.8 |
| 07/11/2016 | 2.7 |
| 07/11/2016 | 2.4 |
| 07/11/2016 | 2.1 |
| 07/11/2016 | 2 |
| 08/11/2016 | 1.8 |
| 08/11/2016 | 1.8 |
| 08/11/2016 | 1.8 |
| 08/11/2016 | 1.9 |
| 08/11/2016 | 2.1 |
| 08/11/2016 | 2.4 |
| 08/11/2016 | 2.7 |
| 08/11/2016 | 2.9 |
| 08/11/2016 | 3.1 |
| 08/11/2016 | 3.2 |
| 08/11/2016 | 3.2 |
| 08/11/2016 | 3.2 |
| 08/11/2016 | 3.2 |
| 08/11/2016 | 3.1 |
| 08/11/2016 | 3.2 |
| 08/11/2016 | 3.4 |
| 08/11/2016 | 3.5 |
| 08/11/2016 | 3.2 |
| 08/11/2016 | 3.2 |
| 08/11/2016 | 3 |
| 08/11/2016 | 2.6 |
| 08/11/2016 | 2.3 |
| 08/11/2016 | 2.1 |
| 08/11/2016 | 1.9 |
| 09/11/2016 | 1.9 |
| 09/11/2016 | 1.8 |
| 09/11/2016 | 1.8 |
| 09/11/2016 | 1.9 |
| 09/11/2016 | 2.1 |
| 09/11/2016 | 2.4 |
| 09/11/2016 | 2.8 |
| 09/11/2016 | 3 |
| 09/11/2016 | 3.1 |
| 09/11/2016 | 3.2 |
| 09/11/2016 | 3.3 |
| 09/11/2016 | 3.3 |
| 09/11/2016 | 3.3 |
| 09/11/2016 | 3.2 |
| 09/11/2016 | 3.3 |
| 09/11/2016 | 3.3 |
| 09/11/2016 | 3.4 |
| 09/11/2016 | 3.3 |
| 09/11/2016 | 3.2 |
| 09/11/2016 | 3 |
| 09/11/2016 | 2.6 |
| 09/11/2016 | 2.4 |
| 09/11/2016 | 2.1 |
| 09/11/2016 | 2 |
| 10/11/2016 | 1.9 |
| 10/11/2016 | 1.8 |
| 10/11/2016 | 1.8 |
| 10/11/2016 | 1.9 |
| 10/11/2016 | 2.1 |
| 10/11/2016 | 2.4 |
| 10/11/2016 | 2.8 |
| 10/11/2016 | 3 |
| 10/11/2016 | 3.1 |
| 10/11/2016 | 3.2 |
| 10/11/2016 | 3.2 |
| 10/11/2016 | 3.2 |
| 10/11/2016 | 3.1 |
| 10/11/2016 | 3 |
| 10/11/2016 | 3.1 |
| 10/11/2016 | 3.2 |
| 10/11/2016 | 3.3 |
| 10/11/2016 | 3.2 |
| 10/11/2016 | 3.1 |
| 10/11/2016 | 2.8 |
| 10/11/2016 | 2.6 |
| 10/11/2016 | 2.4 |
| 10/11/2016 | 2.2 |
| 10/11/2016 | 2 |
| 11/11/2016 | 1.8 |
| 11/11/2016 | 1.9 |
| 11/11/2016 | 1.8 |
| 11/11/2016 | 1.9 |
| 11/11/2016 | 2.1 |
| 11/11/2016 | 2.4 |
| 11/11/2016 | 2.7 |
| 11/11/2016 | 3 |
| 11/11/2016 | 3.1 |
| 11/11/2016 | 3.2 |
| 11/11/2016 | 3.3 |
| 11/11/2016 | 3.2 |
| 11/11/2016 | 3.2 |
| 11/11/2016 | 3.2 |
| 11/11/2016 | 3.2 |
| 11/11/2016 | 3.2 |
| 11/11/2016 | 3.4 |
| 11/11/2016 | 3.2 |
| 11/11/2016 | 3 |
| 11/11/2016 | 2.9 |
| 11/11/2016 | 2.6 |
| 11/11/2016 | 2.3 |
| 11/11/2016 | 2.1 |
| 11/11/2016 | 1.9 |
| 12/11/2016 | 1.9 |
| 12/11/2016 | 1.8 |
| 12/11/2016 | 1.8 |
| 12/11/2016 | 1.8 |
| 12/11/2016 | 1.9 |
| 12/11/2016 | 1.9 |
| 12/11/2016 | 2.1 |
| 12/11/2016 | 2.4 |
| 12/11/2016 | 2.5 |
| 12/11/2016 | 2.7 |
| 12/11/2016 | 2.8 |
| 12/11/2016 | 2.7 |
| 12/11/2016 | 2.7 |
| 12/11/2016 | 2.7 |
| 12/11/2016 | 2.7 |
| 12/11/2016 | 2.7 |
| 12/11/2016 | 2.9 |
| 12/11/2016 | 2.8 |
| 12/11/2016 | 2.8 |
| 12/11/2016 | 2.6 |
| 12/11/2016 | 2.4 |
| 12/11/2016 | 2.2 |
| 12/11/2016 | 2.1 |
| 12/11/2016 | 2 |
| 13/11/2016 | 1.9 |
| 13/11/2016 | 1.8 |
| 13/11/2016 | 1.8 |
| 13/11/2016 | 1.8 |
| 13/11/2016 | 1.8 |
| 13/11/2016 | 1.8 |
| 13/11/2016 | 2 |
| 13/11/2016 | 2.1 |
| 13/11/2016 | 2.3 |
| 13/11/2016 | 2.4 |
| 13/11/2016 | 2.7 |
| 13/11/2016 | 2.7 |
| 13/11/2016 | 2.6 |
| 13/11/2016 | 2.6 |
| 13/11/2016 | 2.6 |
| 13/11/2016 | 2.7 |
| 13/11/2016 | 2.8 |
| 13/11/2016 | 2.7 |
| 13/11/2016 | 2.7 |
| 13/11/2016 | 2.6 |
| 13/11/2016 | 2.4 |
| 13/11/2016 | 2.2 |
| 13/11/2016 | 2.1 |
| 13/11/2016 | 2 |
| 14/11/2016 | 1.9 |
| 14/11/2016 | 1.8 |
| 14/11/2016 | 1.8 |
| 14/11/2016 | 1.9 |
| 14/11/2016 | 2 |
| 14/11/2016 | 2.4 |
| 14/11/2016 | 2.7 |
| 14/11/2016 | 3 |
| 14/11/2016 | 3.2 |
| 14/11/2016 | 3.2 |
| 14/11/2016 | 3.3 |
| 14/11/2016 | 3.3 |
| 14/11/2016 | 3.2 |
| 14/11/2016 | 3.2 |
| 14/11/2016 | 3.2 |
| 14/11/2016 | 3.3 |
| 14/11/2016 | 3.4 |
| 14/11/2016 | 3.3 |
| 14/11/2016 | 3.2 |
| 14/11/2016 | 2.9 |
| 14/11/2016 | 2.7 |
| 14/11/2016 | 2.4 |
| 14/11/2016 | 2.2 |
| 14/11/2016 | 2 |
| 15/11/2016 | 1.8 |
| 15/11/2016 | 1.9 |
| 15/11/2016 | 1.8 |
| 15/11/2016 | 2 |
| 15/11/2016 | 2.1 |
| 15/11/2016 | 2.5 |
| 15/11/2016 | 2.7 |
| 15/11/2016 | 3.1 |
| 15/11/2016 | 3.2 |
| 15/11/2016 | 3.3 |
| 15/11/2016 | 3.3 |
| 15/11/2016 | 3.3 |
| 15/11/2016 | 3.3 |
| 15/11/2016 | 3.2 |
| 15/11/2016 | 3.2 |
| 15/11/2016 | 3.4 |
| 15/11/2016 | 3.5 |
| 15/11/2016 | 3.5 |
| 15/11/2016 | 3.3 |
| 15/11/2016 | 3 |
| 15/11/2016 | 2.7 |
| 15/11/2016 | 2.4 |
| 15/11/2016 | 2.1 |
| 15/11/2016 | 2.1 |
| 16/11/2016 | 1.9 |
| 16/11/2016 | 1.8 |
| 16/11/2016 | 1.9 |
| 16/11/2016 | 1.8 |
| 16/11/2016 | 2.1 |
| 16/11/2016 | 2.4 |
| 16/11/2016 | 2.9 |
| 16/11/2016 | 3.1 |
| 16/11/2016 | 3.2 |
| 16/11/2016 | 3.3 |
| 16/11/2016 | 3.5 |
| 16/11/2016 | 3.5 |
| 16/11/2016 | 3.3 |
| 16/11/2016 | 3.2 |
| 16/11/2016 | 3.4 |
| 16/11/2016 | 3.5 |
| 16/11/2016 | 3.5 |
| 16/11/2016 | 3.3 |
| 16/11/2016 | 3.2 |
| 16/11/2016 | 3.1 |
| 16/11/2016 | 2.7 |
| 16/11/2016 | 2.4 |
| 16/11/2016 | 2.2 |
| 16/11/2016 | 2.1 |
| 17/11/2016 | 1.9 |
| 17/11/2016 | 1.8 |
| 17/11/2016 | 1.9 |
| 17/11/2016 | 1.8 |
| 17/11/2016 | 2.1 |
| 17/11/2016 | 2.4 |
| 17/11/2016 | 2.8 |
| 17/11/2016 | 3 |
| 17/11/2016 | 3.2 |
| 17/11/2016 | 3.2 |
| 17/11/2016 | 3.2 |
| 17/11/2016 | 3.2 |
| 17/11/2016 | 3.2 |
| 17/11/2016 | 3.2 |
| 17/11/2016 | 3.2 |
| 17/11/2016 | 3.3 |
| 17/11/2016 | 3.4 |
| 17/11/2016 | 3.3 |
| 17/11/2016 | 3.2 |
| 17/11/2016 | 2.9 |
| 17/11/2016 | 2.7 |
| 17/11/2016 | 2.4 |
| 17/11/2016 | 2.2 |
| 17/11/2016 | 2 |
| 18/11/2016 | 1.9 |
| 18/11/2016 | 1.8 |
| 18/11/2016 | 1.8 |
| 18/11/2016 | 1.8 |
| 18/11/2016 | 2.1 |
| 18/11/2016 | 2.4 |
| 18/11/2016 | 2.8 |
| 18/11/2016 | 3 |
| 18/11/2016 | 3.2 |
| 18/11/2016 | 3.3 |
| 18/11/2016 | 3.3 |
| 18/11/2016 | 3.4 |
| 18/11/2016 | 3.3 |
| 18/11/2016 | 3.2 |
| 18/11/2016 | 3.2 |
| 18/11/2016 | 3.2 |
| 18/11/2016 | 3.5 |
| 18/11/2016 | 3.4 |
| 18/11/2016 | 3.2 |
| 18/11/2016 | 2.8 |
| 18/11/2016 | 2.6 |
| 18/11/2016 | 2.4 |
| 18/11/2016 | 2.1 |
| 18/11/2016 | 2.1 |
| 19/11/2016 | 1.9 |
| 19/11/2016 | 1.8 |
| 19/11/2016 | 1.8 |
| 19/11/2016 | 1.8 |
| 19/11/2016 | 1.8 |
| 19/11/2016 | 2 |
| 19/11/2016 | 2.1 |
| 19/11/2016 | 2.4 |
| 19/11/2016 | 2.6 |
| 19/11/2016 | 2.8 |
| 19/11/2016 | 2.9 |
| 19/11/2016 | 2.9 |
| 19/11/2016 | 2.7 |
| 19/11/2016 | 2.7 |
| 19/11/2016 | 2.7 |
| 19/11/2016 | 2.8 |
| 19/11/2016 | 2.9 |
| 19/11/2016 | 2.9 |
| 19/11/2016 | 2.8 |
| 19/11/2016 | 2.7 |
| 19/11/2016 | 2.5 |
| 19/11/2016 | 2.3 |
| 19/11/2016 | 2.1 |
| 19/11/2016 | 2 |
| 20/11/2016 | 1.8 |
| 20/11/2016 | 1.8 |
| 20/11/2016 | 1.8 |
| 20/11/2016 | 1.8 |
| 20/11/2016 | 1.8 |
| 20/11/2016 | 1.9 |
| 20/11/2016 | 2 |
| 20/11/2016 | 2.2 |
| 20/11/2016 | 2.4 |
| 20/11/2016 | 2.7 |
| 20/11/2016 | 2.7 |
| 20/11/2016 | 2.7 |
| 20/11/2016 | 2.7 |
| 20/11/2016 | 2.6 |
| 20/11/2016 | 2.7 |
| 20/11/2016 | 2.7 |
| 20/11/2016 | 2.8 |
| 20/11/2016 | 2.9 |
| 20/11/2016 | 2.7 |
| 20/11/2016 | 2.7 |
| 20/11/2016 | 2.4 |
| 20/11/2016 | 2.4 |
| 20/11/2016 | 2.1 |
| 20/11/2016 | 2 |
| 21/11/2016 | 1.8 |
| 21/11/2016 | 1.8 |
| 21/11/2016 | 1.9 |
| 21/11/2016 | 1.8 |
| 21/11/2016 | 2.1 |
| 21/11/2016 | 2.5 |
| 21/11/2016 | 3 |
| 21/11/2016 | 3.2 |
| 21/11/2016 | 3.3 |
| 21/11/2016 | 3.3 |
| 21/11/2016 | 3.5 |
| 21/11/2016 | 3.5 |
| 21/11/2016 | 3.4 |
| 21/11/2016 | 3.3 |
| 21/11/2016 | 3.3 |
| 21/11/2016 | 3.4 |
| 21/11/2016 | 3.5 |
| 21/11/2016 | 3.4 |
| 21/11/2016 | 3.2 |
| 21/11/2016 | 3 |
| 21/11/2016 | 2.7 |
| 21/11/2016 | 2.5 |
| 21/11/2016 | 2.3 |
| 21/11/2016 | 2 |
| 22/11/2016 | 1.9 |
| 22/11/2016 | 1.8 |
| 22/11/2016 | 1.8 |
| 22/11/2016 | 1.9 |
| 22/11/2016 | 2.1 |
| 22/11/2016 | 2.5 |
| 22/11/2016 | 3 |
| 22/11/2016 | 3.2 |
| 22/11/2016 | 3.3 |
| 22/11/2016 | 3.5 |
| 22/11/2016 | 3.5 |
| 22/11/2016 | 3.5 |
| 22/11/2016 | 3.3 |
| 22/11/2016 | 3.2 |
| 22/11/2016 | 3.3 |
| 22/11/2016 | 3.5 |
| 22/11/2016 | 3.5 |
| 22/11/2016 | 3.5 |
| 22/11/2016 | 3.3 |
| 22/11/2016 | 3 |
| 22/11/2016 | 2.7 |
| 22/11/2016 | 2.4 |
| 22/11/2016 | 2.2 |
| 22/11/2016 | 2.1 |
| 23/11/2016 | 2 |
| 23/11/2016 | 1.9 |
| 23/11/2016 | 1.8 |
| 23/11/2016 | 2 |
| 23/11/2016 | 2.2 |
| 23/11/2016 | 2.6 |
| 23/11/2016 | 2.9 |
| 23/11/2016 | 3.2 |
| 23/11/2016 | 3.3 |
| 23/11/2016 | 3.5 |
| 23/11/2016 | 3.6 |
| 23/11/2016 | 3.6 |
| 23/11/2016 | 3.5 |
| 23/11/2016 | 3.4 |
| 23/11/2016 | 3.5 |
| 23/11/2016 | 3.5 |
| 23/11/2016 | 3.5 |
| 23/11/2016 | 3.4 |
| 23/11/2016 | 3.4 |
| 23/11/2016 | 3 |
| 23/11/2016 | 2.7 |
| 23/11/2016 | 2.4 |
| 23/11/2016 | 2.2 |
| 23/11/2016 | 2.1 |
| 24/11/2016 | 1.9 |
| 24/11/2016 | 1.9 |
| 24/11/2016 | 1.8 |
| 24/11/2016 | 2 |
| 24/11/2016 | 2.2 |
| 24/11/2016 | 2.5 |
| 24/11/2016 | 2.9 |
| 24/11/2016 | 3.1 |
| 24/11/2016 | 3.2 |
| 24/11/2016 | 3.4 |
| 24/11/2016 | 3.4 |
| 24/11/2016 | 3.4 |
| 24/11/2016 | 3.4 |
| 24/11/2016 | 3.4 |
| 24/11/2016 | 3.4 |
| 24/11/2016 | 3.4 |
| 24/11/2016 | 3.5 |
| 24/11/2016 | 3.4 |
| 24/11/2016 | 3.3 |
| 24/11/2016 | 3 |
| 24/11/2016 | 2.7 |
| 24/11/2016 | 2.4 |
| 24/11/2016 | 2.2 |
| 24/11/2016 | 2.1 |
| 25/11/2016 | 1.9 |
| 25/11/2016 | 1.9 |
| 25/11/2016 | 1.8 |
| 25/11/2016 | 1.9 |
| 25/11/2016 | 2.1 |
| 25/11/2016 | 2.4 |
| 25/11/2016 | 2.8 |
| 25/11/2016 | 3.1 |
| 25/11/2016 | 3.2 |
| 25/11/2016 | 3.5 |
| 25/11/2016 | 3.4 |
| 25/11/2016 | 3.5 |
| 25/11/2016 | 3.5 |
| 25/11/2016 | 3.3 |
| 25/11/2016 | 3.3 |
| 25/11/2016 | 3.5 |
| 25/11/2016 | 3.5 |
| 25/11/2016 | 3.5 |
| 25/11/2016 | 3.2 |
| 25/11/2016 | 2.9 |
| 25/11/2016 | 2.7 |
| 25/11/2016 | 2.4 |
| 25/11/2016 | 2.3 |
| 25/11/2016 | 2 |
| 26/11/2016 | 2 |
| 26/11/2016 | 1.9 |
| 26/11/2016 | 1.8 |
| 26/11/2016 | 1.9 |
| 26/11/2016 | 1.9 |
| 26/11/2016 | 2.1 |
| 26/11/2016 | 2.2 |
| 26/11/2016 | 2.4 |
| 26/11/2016 | 2.7 |
| 26/11/2016 | 2.8 |
| 26/11/2016 | 3 |
| 26/11/2016 | 2.9 |
| 26/11/2016 | 2.8 |
| 26/11/2016 | 2.8 |
| 26/11/2016 | 2.8 |
| 26/11/2016 | 2.9 |
| 26/11/2016 | 3 |
| 26/11/2016 | 3 |
| 26/11/2016 | 2.9 |
| 26/11/2016 | 2.7 |
| 26/11/2016 | 2.5 |
| 26/11/2016 | 2.3 |
| 26/11/2016 | 2.2 |
| 26/11/2016 | 2.1 |
| 27/11/2016 | 1.9 |
| 27/11/2016 | 1.8 |
| 27/11/2016 | 1.8 |
| 27/11/2016 | 1.8 |
| 27/11/2016 | 1.9 |
| 27/11/2016 | 1.8 |
| 27/11/2016 | 2 |
| 27/11/2016 | 2.1 |
| 27/11/2016 | 2.4 |
| 27/11/2016 | 2.6 |
| 27/11/2016 | 2.7 |
| 27/11/2016 | 2.7 |
| 27/11/2016 | 2.7 |
| 27/11/2016 | 2.7 |
| 27/11/2016 | 2.7 |
| 27/11/2016 | 2.7 |
| 27/11/2016 | 2.8 |
| 27/11/2016 | 2.9 |
| 27/11/2016 | 2.7 |
| 27/11/2016 | 2.7 |
| 27/11/2016 | 2.5 |
| 27/11/2016 | 2.4 |
| 27/11/2016 | 2.3 |
| 27/11/2016 | 2.1 |
| 28/11/2016 | 1.9 |
| 28/11/2016 | 1.8 |
| 28/11/2016 | 1.8 |
| 28/11/2016 | 1.9 |
| 28/11/2016 | 2.1 |
| 28/11/2016 | 2.5 |
| 28/11/2016 | 2.8 |
| 28/11/2016 | 3 |
| 28/11/2016 | 3.2 |
| 28/11/2016 | 3.4 |
| 28/11/2016 | 3.4 |
| 28/11/2016 | 3.5 |
| 28/11/2016 | 3.3 |
| 28/11/2016 | 3.3 |
| 28/11/2016 | 3.4 |
| 28/11/2016 | 3.5 |
| 28/11/2016 | 3.4 |
| 28/11/2016 | 3.5 |
| 28/11/2016 | 3.3 |
| 28/11/2016 | 3 |
| 28/11/2016 | 2.7 |
| 28/11/2016 | 2.4 |
| 28/11/2016 | 2.2 |
| 28/11/2016 | 2.1 |
| 29/11/2016 | 2 |
| 29/11/2016 | 1.9 |
| 29/11/2016 | 1.8 |
| 29/11/2016 | 1.9 |
| 29/11/2016 | 2.1 |
| 29/11/2016 | 2.5 |
| 29/11/2016 | 2.8 |
| 29/11/2016 | 3 |
| 29/11/2016 | 3.3 |
| 29/11/2016 | 3.3 |
| 29/11/2016 | 3.3 |
| 29/11/2016 | 3.3 |
| 29/11/2016 | 3.4 |
| 29/11/2016 | 3.3 |
| 29/11/2016 | 3.4 |
| 29/11/2016 | 3.5 |
| 29/11/2016 | 3.5 |
| 29/11/2016 | 3.4 |
| 29/11/2016 | 3.4 |
| 29/11/2016 | 3 |
| 29/11/2016 | 2.8 |
| 29/11/2016 | 2.5 |
| 29/11/2016 | 2.2 |
| 29/11/2016 | 2.1 |
| 30/11/2016 | 1.9 |
| 30/11/2016 | 2 |
| 30/11/2016 | 1.9 |
| 30/11/2016 | 2 |
| 30/11/2016 | 2.2 |
| 30/11/2016 | 2.5 |
| 30/11/2016 | 2.9 |
| 30/11/2016 | 3.1 |
| 30/11/2016 | 3.2 |
| 30/11/2016 | 3.4 |
| 30/11/2016 | 3.4 |
| 30/11/2016 | 3.5 |
| 30/11/2016 | 3.5 |
| 30/11/2016 | 3.5 |
| 30/11/2016 | 3.3 |
| 30/11/2016 | 3.5 |
| 30/11/2016 | 3.5 |
| 30/11/2016 | 3.4 |
| 30/11/2016 | 3.4 |
| 30/11/2016 | 3 |
| 30/11/2016 | 2.7 |
| 30/11/2016 | 2.5 |
| 30/11/2016 | 2.3 |
| 30/11/2016 | 2.1 |
| 01/12/2016 | 1.9 |
| 01/12/2016 | 1.9 |
| 01/12/2016 | 1.8 |
| 01/12/2016 | 2 |
| 01/12/2016 | 2.1 |
| 01/12/2016 | 2.5 |
| 01/12/2016 | 2.8 |
| 01/12/2016 | 3 |
| 01/12/2016 | 3.2 |
| 01/12/2016 | 3.3 |
| 01/12/2016 | 3.3 |
| 01/12/2016 | 3.4 |
| 01/12/2016 | 3.2 |
| 01/12/2016 | 3.2 |
| 01/12/2016 | 3.2 |
| 01/12/2016 | 3.3 |
| 01/12/2016 | 3.4 |
| 01/12/2016 | 3.3 |
| 01/12/2016 | 3.2 |
| 01/12/2016 | 3 |
| 01/12/2016 | 2.7 |
| 01/12/2016 | 2.4 |
| 01/12/2016 | 2.3 |
| 01/12/2016 | 2 |
| 02/12/2016 | 1.9 |
| 02/12/2016 | 1.9 |
| 02/12/2016 | 1.8 |
| 02/12/2016 | 1.9 |
| 02/12/2016 | 2.1 |
| 02/12/2016 | 2.4 |
| 02/12/2016 | 2.9 |
| 02/12/2016 | 3 |
| 02/12/2016 | 3.2 |
| 02/12/2016 | 3.3 |
| 02/12/2016 | 3.3 |
| 02/12/2016 | 3.3 |
| 02/12/2016 | 3.4 |
| 02/12/2016 | 3.2 |
| 02/12/2016 | 3.2 |
| 02/12/2016 | 3.3 |
| 02/12/2016 | 3.3 |
| 02/12/2016 | 3.3 |
| 02/12/2016 | 3.1 |
| 02/12/2016 | 2.8 |
| 02/12/2016 | 2.7 |
| 02/12/2016 | 2.4 |
| 02/12/2016 | 2.1 |
| 02/12/2016 | 2.1 |
| 03/12/2016 | 1.8 |
| 03/12/2016 | 1.9 |
| 03/12/2016 | 1.8 |
| 03/12/2016 | 1.9 |
| 03/12/2016 | 1.9 |
| 03/12/2016 | 2 |
| 03/12/2016 | 2.1 |
| 03/12/2016 | 2.4 |
| 03/12/2016 | 2.6 |
| 03/12/2016 | 2.7 |
| 03/12/2016 | 2.8 |
| 03/12/2016 | 2.8 |
| 03/12/2016 | 2.7 |
| 03/12/2016 | 2.7 |
| 03/12/2016 | 2.8 |
| 03/12/2016 | 2.7 |
| 03/12/2016 | 2.8 |
| 03/12/2016 | 3 |
| 03/12/2016 | 2.9 |
| 03/12/2016 | 2.7 |
| 03/12/2016 | 2.4 |
| 03/12/2016 | 2.3 |
| 03/12/2016 | 2.2 |
| 03/12/2016 | 2.1 |
| 04/12/2016 | 1.9 |
| 04/12/2016 | 1.8 |
| 04/12/2016 | 1.8 |
| 04/12/2016 | 1.8 |
| 04/12/2016 | 1.8 |
| 04/12/2016 | 1.8 |
| 04/12/2016 | 2 |
| 04/12/2016 | 2.1 |
| 04/12/2016 | 2.3 |
| 04/12/2016 | 2.5 |
| 04/12/2016 | 2.7 |
| 04/12/2016 | 2.7 |
| 04/12/2016 | 2.7 |
| 04/12/2016 | 2.7 |
| 04/12/2016 | 2.7 |
| 04/12/2016 | 2.7 |
| 04/12/2016 | 2.7 |
| 04/12/2016 | 2.8 |
| 04/12/2016 | 2.7 |
| 04/12/2016 | 2.6 |
| 04/12/2016 | 2.4 |
| 04/12/2016 | 2.4 |
| 04/12/2016 | 2.1 |
| 04/12/2016 | 1.9 |
| 05/12/2016 | 1.9 |
| 05/12/2016 | 1.8 |
| 05/12/2016 | 1.8 |
| 05/12/2016 | 1.9 |
| 05/12/2016 | 2.1 |
| 05/12/2016 | 2.4 |
| 05/12/2016 | 2.7 |
| 05/12/2016 | 3 |
| 05/12/2016 | 3.1 |
| 05/12/2016 | 3.2 |
| 05/12/2016 | 3.3 |
| 05/12/2016 | 3.4 |
| 05/12/2016 | 3.2 |
| 05/12/2016 | 3.2 |
| 05/12/2016 | 3.3 |
| 05/12/2016 | 3.4 |
| 05/12/2016 | 3.4 |
| 05/12/2016 | 3.4 |
| 05/12/2016 | 3.2 |
| 05/12/2016 | 2.9 |
| 05/12/2016 | 2.7 |
| 05/12/2016 | 2.4 |
| 05/12/2016 | 2.2 |
| 05/12/2016 | 2.1 |
| 06/12/2016 | 1.8 |
| 06/12/2016 | 1.9 |
| 06/12/2016 | 1.8 |
| 06/12/2016 | 1.9 |
| 06/12/2016 | 2.1 |
| 06/12/2016 | 2.4 |
| 06/12/2016 | 2.9 |
| 06/12/2016 | 3.1 |
| 06/12/2016 | 3.2 |
| 06/12/2016 | 3.2 |
| 06/12/2016 | 3.2 |
| 06/12/2016 | 3.2 |
| 06/12/2016 | 3.3 |
| 06/12/2016 | 3.3 |
| 06/12/2016 | 3.2 |
| 06/12/2016 | 3.4 |
| 06/12/2016 | 3.4 |
| 06/12/2016 | 3.5 |
| 06/12/2016 | 3.3 |
| 06/12/2016 | 3 |
| 06/12/2016 | 2.7 |
| 06/12/2016 | 2.4 |
| 06/12/2016 | 2.2 |
| 06/12/2016 | 2.1 |
| 07/12/2016 | 1.9 |
| 07/12/2016 | 2 |
| 07/12/2016 | 1.9 |
| 07/12/2016 | 2 |
| 07/12/2016 | 2.1 |
| 07/12/2016 | 2.4 |
| 07/12/2016 | 2.8 |
| 07/12/2016 | 3 |
| 07/12/2016 | 3.2 |
| 07/12/2016 | 3.3 |
| 07/12/2016 | 3.3 |
| 07/12/2016 | 3.4 |
| 07/12/2016 | 3.4 |
| 07/12/2016 | 3.2 |
| 07/12/2016 | 3.3 |
| 07/12/2016 | 3.4 |
| 07/12/2016 | 3.4 |
| 07/12/2016 | 3.3 |
| 07/12/2016 | 3.3 |
| 07/12/2016 | 3 |
| 07/12/2016 | 2.7 |
| 07/12/2016 | 2.5 |
| 07/12/2016 | 2.3 |
| 07/12/2016 | 2 |
| 08/12/2016 | 1.9 |
| 08/12/2016 | 2 |
| 08/12/2016 | 1.8 |
| 08/12/2016 | 1.9 |
| 08/12/2016 | 2.1 |
| 08/12/2016 | 2.4 |
| 08/12/2016 | 2.7 |
| 08/12/2016 | 3 |
| 08/12/2016 | 3 |
| 08/12/2016 | 3.2 |
| 08/12/2016 | 3.2 |
| 08/12/2016 | 3.2 |
| 08/12/2016 | 3.2 |
| 08/12/2016 | 3.2 |
| 08/12/2016 | 3.2 |
| 08/12/2016 | 3.2 |
| 08/12/2016 | 3.2 |
| 08/12/2016 | 3.2 |
| 08/12/2016 | 3.1 |
| 08/12/2016 | 2.9 |
| 08/12/2016 | 2.5 |
| 08/12/2016 | 2.4 |
| 08/12/2016 | 2.2 |
| 08/12/2016 | 2 |
| 09/12/2016 | 1.9 |
| 09/12/2016 | 1.9 |
| 09/12/2016 | 1.8 |
| 09/12/2016 | 1.9 |
| 09/12/2016 | 2.1 |
| 09/12/2016 | 2.4 |
| 09/12/2016 | 2.8 |
| 09/12/2016 | 3 |
| 09/12/2016 | 3 |
| 09/12/2016 | 3.2 |
| 09/12/2016 | 3.2 |
| 09/12/2016 | 3.2 |
| 09/12/2016 | 3.2 |
| 09/12/2016 | 3.2 |
| 09/12/2016 | 3.2 |
| 09/12/2016 | 3.2 |
| 09/12/2016 | 3.2 |
| 09/12/2016 | 3.2 |
| 09/12/2016 | 3.1 |
| 09/12/2016 | 2.7 |
| 09/12/2016 | 2.6 |
| 09/12/2016 | 2.4 |
| 09/12/2016 | 2.1 |
| 09/12/2016 | 2.1 |
| 10/12/2016 | 1.9 |
| 10/12/2016 | 1.9 |
| 10/12/2016 | 1.8 |
| 10/12/2016 | 1.8 |
| 10/12/2016 | 1.8 |
| 10/12/2016 | 2 |
| 10/12/2016 | 2.1 |
| 10/12/2016 | 2.3 |
| 10/12/2016 | 2.5 |
| 10/12/2016 | 2.7 |
| 10/12/2016 | 2.7 |
| 10/12/2016 | 2.7 |
| 10/12/2016 | 2.7 |
| 10/12/2016 | 2.7 |
| 10/12/2016 | 2.7 |
| 10/12/2016 | 2.7 |
| 10/12/2016 | 2.9 |
| 10/12/2016 | 2.9 |
| 10/12/2016 | 2.8 |
| 10/12/2016 | 2.6 |
| 10/12/2016 | 2.4 |
| 10/12/2016 | 2.3 |
| 10/12/2016 | 2.1 |
| 10/12/2016 | 1.9 |
| 11/12/2016 | 2 |
| 11/12/2016 | 1.8 |
| 11/12/2016 | 1.8 |
| 11/12/2016 | 1.8 |
| 11/12/2016 | 1.8 |
| 11/12/2016 | 1.9 |
| 11/12/2016 | 1.9 |
| 11/12/2016 | 2.1 |
| 11/12/2016 | 2.2 |
| 11/12/2016 | 2.4 |
| 11/12/2016 | 2.6 |
| 11/12/2016 | 2.6 |
| 11/12/2016 | 2.6 |
| 11/12/2016 | 2.5 |
| 11/12/2016 | 2.5 |
| 11/12/2016 | 2.6 |
| 11/12/2016 | 2.7 |
| 11/12/2016 | 2.7 |
| 11/12/2016 | 2.7 |
| 11/12/2016 | 2.5 |
| 11/12/2016 | 2.4 |
| 11/12/2016 | 2.4 |
| 11/12/2016 | 2.1 |
| 11/12/2016 | 2 |
| 12/12/2016 | 1.9 |
| 12/12/2016 | 1.8 |
| 12/12/2016 | 1.8 |
| 12/12/2016 | 1.9 |
| 12/12/2016 | 2.1 |
| 12/12/2016 | 2.4 |
| 12/12/2016 | 2.8 |
| 12/12/2016 | 3 |
| 12/12/2016 | 3 |
| 12/12/2016 | 3.2 |
| 12/12/2016 | 3.2 |
| 12/12/2016 | 3.2 |
| 12/12/2016 | 3.2 |
| 12/12/2016 | 3.2 |
| 12/12/2016 | 3.3 |
| 12/12/2016 | 3.3 |
| 12/12/2016 | 3.2 |
| 12/12/2016 | 3.2 |
| 12/12/2016 | 3.2 |
| 12/12/2016 | 2.8 |
| 12/12/2016 | 2.7 |
| 12/12/2016 | 2.4 |
| 12/12/2016 | 2.2 |
| 12/12/2016 | 2.1 |
| 13/12/2016 | 1.8 |
| 13/12/2016 | 1.9 |
| 13/12/2016 | 1.8 |
| 13/12/2016 | 1.9 |
| 13/12/2016 | 2.1 |
| 13/12/2016 | 2.4 |
| 13/12/2016 | 2.8 |
| 13/12/2016 | 3 |
| 13/12/2016 | 3.1 |
| 13/12/2016 | 3.1 |
| 13/12/2016 | 3.2 |
| 13/12/2016 | 3.2 |
| 13/12/2016 | 3.2 |
| 13/12/2016 | 3.1 |
| 13/12/2016 | 3.2 |
| 13/12/2016 | 3.4 |
| 13/12/2016 | 3.4 |
| 13/12/2016 | 3.4 |
| 13/12/2016 | 3.1 |
| 13/12/2016 | 3 |
| 13/12/2016 | 2.7 |
| 13/12/2016 | 2.4 |
| 13/12/2016 | 2.2 |
| 13/12/2016 | 2 |
| 14/12/2016 | 1.9 |
| 14/12/2016 | 2 |
| 14/12/2016 | 1.9 |
| 14/12/2016 | 2 |
| 14/12/2016 | 2.1 |
| 14/12/2016 | 2.4 |
| 14/12/2016 | 2.9 |
| 14/12/2016 | 3 |
| 14/12/2016 | 3 |
| 14/12/2016 | 3.2 |
| 14/12/2016 | 3.2 |
| 14/12/2016 | 3.3 |
| 14/12/2016 | 3.2 |
| 14/12/2016 | 3.2 |
| 14/12/2016 | 3.2 |
| 14/12/2016 | 3.2 |
| 14/12/2016 | 3.4 |
| 14/12/2016 | 3.2 |
| 14/12/2016 | 3.1 |
| 14/12/2016 | 3 |
| 14/12/2016 | 2.6 |
| 14/12/2016 | 2.5 |
| 14/12/2016 | 2.3 |
| 14/12/2016 | 2 |
| 15/12/2016 | 1.9 |
| 15/12/2016 | 2 |
| 15/12/2016 | 1.9 |
| 15/12/2016 | 1.9 |
| 15/12/2016 | 2.1 |
| 15/12/2016 | 2.4 |
| 15/12/2016 | 2.8 |
| 15/12/2016 | 3 |
| 15/12/2016 | 3 |
| 15/12/2016 | 3.1 |
| 15/12/2016 | 3.2 |
| 15/12/2016 | 3.2 |
| 15/12/2016 | 3.1 |
| 15/12/2016 | 3.1 |
| 15/12/2016 | 3.2 |
| 15/12/2016 | 3.2 |
| 15/12/2016 | 3.2 |
| 15/12/2016 | 3.1 |
| 15/12/2016 | 3 |
| 15/12/2016 | 2.8 |
| 15/12/2016 | 2.5 |
| 15/12/2016 | 2.3 |
| 15/12/2016 | 2.1 |
| 15/12/2016 | 2 |
| 16/12/2016 | 1.9 |
| 16/12/2016 | 1.8 |
| 16/12/2016 | 1.8 |
| 16/12/2016 | 1.9 |
| 16/12/2016 | 2.1 |
| 16/12/2016 | 2.4 |
| 16/12/2016 | 2.7 |
| 16/12/2016 | 3 |
| 16/12/2016 | 3.1 |
| 16/12/2016 | 3.1 |
| 16/12/2016 | 3.1 |
| 16/12/2016 | 3.2 |
| 16/12/2016 | 3.1 |
| 16/12/2016 | 3 |
| 16/12/2016 | 3 |
| 16/12/2016 | 3.2 |
| 16/12/2016 | 3.2 |
| 16/12/2016 | 3.2 |
| 16/12/2016 | 3 |
| 16/12/2016 | 2.7 |
| 16/12/2016 | 2.4 |
| 16/12/2016 | 2.4 |
| 16/12/2016 | 2.1 |
| 16/12/2016 | 2.1 |
| 17/12/2016 | 1.9 |
| 17/12/2016 | 1.9 |
| 17/12/2016 | 1.8 |
| 17/12/2016 | 1.8 |
| 17/12/2016 | 1.8 |
| 17/12/2016 | 1.9 |
| 17/12/2016 | 2 |
| 17/12/2016 | 2.2 |
| 17/12/2016 | 2.4 |
| 17/12/2016 | 2.5 |
| 17/12/2016 | 2.7 |
| 17/12/2016 | 2.7 |
| 17/12/2016 | 2.6 |
| 17/12/2016 | 2.7 |
| 17/12/2016 | 2.6 |
| 17/12/2016 | 2.6 |
| 17/12/2016 | 2.7 |
| 17/12/2016 | 2.8 |
| 17/12/2016 | 2.8 |
| 17/12/2016 | 2.5 |
| 17/12/2016 | 2.4 |
| 17/12/2016 | 2.2 |
| 17/12/2016 | 2.1 |
| 17/12/2016 | 1.9 |
| 18/12/2016 | 2 |
| 18/12/2016 | 1.8 |
| 18/12/2016 | 1.8 |
| 18/12/2016 | 1.8 |
| 18/12/2016 | 1.8 |
| 18/12/2016 | 1.8 |
| 18/12/2016 | 1.8 |
| 18/12/2016 | 2.1 |
| 18/12/2016 | 2.1 |
| 18/12/2016 | 2.4 |
| 18/12/2016 | 2.5 |
| 18/12/2016 | 2.5 |
| 18/12/2016 | 2.5 |
| 18/12/2016 | 2.4 |
| 18/12/2016 | 2.5 |
| 18/12/2016 | 2.5 |
| 18/12/2016 | 2.6 |
| 18/12/2016 | 2.6 |
| 18/12/2016 | 2.7 |
| 18/12/2016 | 2.5 |
| 18/12/2016 | 2.3 |
| 18/12/2016 | 2.3 |
| 18/12/2016 | 2.1 |
| 18/12/2016 | 2 |
| 19/12/2016 | 2 |
| 19/12/2016 | 1.8 |
| 19/12/2016 | 1.8 |
| 19/12/2016 | 1.9 |
| 19/12/2016 | 2.1 |
| 19/12/2016 | 2.3 |
| 19/12/2016 | 2.7 |
| 19/12/2016 | 3 |
| 19/12/2016 | 3 |
| 19/12/2016 | 3 |
| 19/12/2016 | 3.1 |
| 19/12/2016 | 3 |
| 19/12/2016 | 3.1 |
| 19/12/2016 | 3.2 |
| 19/12/2016 | 3.1 |
| 19/12/2016 | 3.2 |
| 19/12/2016 | 3.3 |
| 19/12/2016 | 3.2 |
| 19/12/2016 | 3.1 |
| 19/12/2016 | 2.8 |
| 19/12/2016 | 2.7 |
| 19/12/2016 | 2.4 |
| 19/12/2016 | 2.2 |
| 19/12/2016 | 2 |
| 20/12/2016 | 1.9 |
| 20/12/2016 | 1.9 |
| 20/12/2016 | 1.8 |
| 20/12/2016 | 1.9 |
| 20/12/2016 | 2.1 |
| 20/12/2016 | 2.4 |
| 20/12/2016 | 2.7 |
| 20/12/2016 | 2.9 |
| 20/12/2016 | 3 |
| 20/12/2016 | 3 |
| 20/12/2016 | 3 |
| 20/12/2016 | 3.1 |
| 20/12/2016 | 3 |
| 20/12/2016 | 3 |
| 20/12/2016 | 3.2 |
| 20/12/2016 | 3.3 |
| 20/12/2016 | 3.2 |
| 20/12/2016 | 3.3 |
| 20/12/2016 | 3.1 |
| 20/12/2016 | 2.9 |
| 20/12/2016 | 2.6 |
| 20/12/2016 | 2.4 |
| 20/12/2016 | 2.2 |
| 20/12/2016 | 2 |
| 21/12/2016 | 1.9 |
| 21/12/2016 | 2 |
| 21/12/2016 | 1.9 |
| 21/12/2016 | 1.9 |
| 21/12/2016 | 2.1 |
| 21/12/2016 | 2.5 |
| 21/12/2016 | 2.7 |
| 21/12/2016 | 3 |
| 21/12/2016 | 3.1 |
| 21/12/2016 | 3.1 |
| 21/12/2016 | 3.1 |
| 21/12/2016 | 3.2 |
| 21/12/2016 | 3.1 |
| 21/12/2016 | 3.2 |
| 21/12/2016 | 3.2 |
| 21/12/2016 | 3.3 |
| 21/12/2016 | 3.2 |
| 21/12/2016 | 3.1 |
| 21/12/2016 | 3.1 |
| 21/12/2016 | 2.9 |
| 21/12/2016 | 2.5 |
| 21/12/2016 | 2.3 |
| 21/12/2016 | 2.1 |
| 21/12/2016 | 2 |
| 22/12/2016 | 1.9 |
| 22/12/2016 | 1.8 |
| 22/12/2016 | 1.9 |
| 22/12/2016 | 1.9 |
| 22/12/2016 | 2.1 |
| 22/12/2016 | 2.4 |
| 22/12/2016 | 2.7 |
| 22/12/2016 | 2.9 |
| 22/12/2016 | 2.8 |
| 22/12/2016 | 3 |
| 22/12/2016 | 3 |
| 22/12/2016 | 3 |
| 22/12/2016 | 3 |
| 22/12/2016 | 3 |
| 22/12/2016 | 3 |
| 22/12/2016 | 3 |
| 22/12/2016 | 3.1 |
| 22/12/2016 | 3 |
| 22/12/2016 | 3 |
| 22/12/2016 | 2.8 |
| 22/12/2016 | 2.5 |
| 22/12/2016 | 2.3 |
| 22/12/2016 | 2.1 |
| 22/12/2016 | 2 |
| 23/12/2016 | 1.9 |
| 23/12/2016 | 1.9 |
| 23/12/2016 | 1.8 |
| 23/12/2016 | 1.9 |
| 23/12/2016 | 2 |
| 23/12/2016 | 2.1 |
| 23/12/2016 | 2.4 |
| 23/12/2016 | 2.7 |
| 23/12/2016 | 2.9 |
| 23/12/2016 | 3 |
| 23/12/2016 | 3 |
| 23/12/2016 | 3 |
| 23/12/2016 | 3 |
| 23/12/2016 | 2.9 |
| 23/12/2016 | 2.9 |
| 23/12/2016 | 3 |
| 23/12/2016 | 3.1 |
| 23/12/2016 | 3.1 |
| 23/12/2016 | 2.8 |
| 23/12/2016 | 2.5 |
| 23/12/2016 | 2.4 |
| 23/12/2016 | 2.2 |
| 23/12/2016 | 2.1 |
| 23/12/2016 | 1.8 |
| 24/12/2016 | 1.8 |
| 24/12/2016 | 1.8 |
| 24/12/2016 | 1.6 |
| 24/12/2016 | 1.7 |
| 24/12/2016 | 1.7 |
| 24/12/2016 | 1.9 |
| 24/12/2016 | 2.1 |
| 24/12/2016 | 2.3 |
| 24/12/2016 | 2.7 |
| 24/12/2016 | 2.8 |
| 24/12/2016 | 2.9 |
| 24/12/2016 | 2.8 |
| 24/12/2016 | 2.7 |
| 24/12/2016 | 2.8 |
| 24/12/2016 | 2.7 |
| 24/12/2016 | 2.5 |
| 24/12/2016 | 2.4 |
| 24/12/2016 | 2.4 |
| 24/12/2016 | 2.4 |
| 24/12/2016 | 2.2 |
| 24/12/2016 | 2.1 |
| 24/12/2016 | 2.1 |
| 24/12/2016 | 2 |
| 24/12/2016 | 2 |
| 25/12/2016 | 1.9 |
| 25/12/2016 | 1.8 |
| 25/12/2016 | 1.8 |
| 25/12/2016 | 1.8 |
| 25/12/2016 | 1.8 |
| 25/12/2016 | 1.8 |
| 25/12/2016 | 2 |
| 25/12/2016 | 2.1 |
| 25/12/2016 | 2.1 |
| 25/12/2016 | 2.3 |
| 25/12/2016 | 2.5 |
| 25/12/2016 | 2.4 |
| 25/12/2016 | 2.3 |
| 25/12/2016 | 2.3 |
| 25/12/2016 | 2.1 |
| 25/12/2016 | 2.4 |
| 25/12/2016 | 2.4 |
| 25/12/2016 | 2.5 |
| 25/12/2016 | 2.4 |
| 25/12/2016 | 2.4 |
| 25/12/2016 | 2.3 |
| 25/12/2016 | 2.3 |
| 25/12/2016 | 2.3 |
| 25/12/2016 | 2 |
| 26/12/2016 | 1.9 |
| 26/12/2016 | 1.8 |
| 26/12/2016 | 1.8 |
| 26/12/2016 | 1.8 |
| 26/12/2016 | 1.8 |
| 26/12/2016 | 1.8 |
| 26/12/2016 | 2 |
| 26/12/2016 | 2.1 |
| 26/12/2016 | 2.1 |
| 26/12/2016 | 2.3 |
| 26/12/2016 | 2.5 |
| 26/12/2016 | 2.4 |
| 26/12/2016 | 2.3 |
| 26/12/2016 | 2.3 |
| 26/12/2016 | 2.1 |
| 26/12/2016 | 2.4 |
| 26/12/2016 | 2.4 |
| 26/12/2016 | 2.5 |
| 26/12/2016 | 2.4 |
| 26/12/2016 | 2.4 |
| 26/12/2016 | 2.3 |
| 26/12/2016 | 2.3 |
| 26/12/2016 | 2.3 |
| 26/12/2016 | 2.1 |
| 27/12/2016 | 2.1 |
| 27/12/2016 | 1.9 |
| 27/12/2016 | 1.8 |
| 27/12/2016 | 1.9 |
| 27/12/2016 | 2 |
| 27/12/2016 | 2.2 |
| 27/12/2016 | 2.2 |
| 27/12/2016 | 2.4 |
| 27/12/2016 | 2.5 |
| 27/12/2016 | 2.7 |
| 27/12/2016 | 2.7 |
| 27/12/2016 | 2.8 |
| 27/12/2016 | 2.8 |
| 27/12/2016 | 2.7 |
| 27/12/2016 | 2.7 |
| 27/12/2016 | 3 |
| 27/12/2016 | 3.1 |
| 27/12/2016 | 3 |
| 27/12/2016 | 3 |
| 27/12/2016 | 2.9 |
| 27/12/2016 | 2.7 |
| 27/12/2016 | 2.5 |
| 27/12/2016 | 2.3 |
| 27/12/2016 | 2.1 |
| 28/12/2016 | 2.1 |
| 28/12/2016 | 1.9 |
| 28/12/2016 | 1.8 |
| 28/12/2016 | 1.9 |
| 28/12/2016 | 2 |
| 28/12/2016 | 2.1 |
| 28/12/2016 | 2.2 |
| 28/12/2016 | 2.4 |
| 28/12/2016 | 2.5 |
| 28/12/2016 | 2.7 |
| 28/12/2016 | 2.7 |
| 28/12/2016 | 2.8 |
| 28/12/2016 | 2.8 |
| 28/12/2016 | 2.7 |
| 28/12/2016 | 2.7 |
| 28/12/2016 | 2.9 |
| 28/12/2016 | 3.1 |
| 28/12/2016 | 3 |
| 28/12/2016 | 3 |
| 28/12/2016 | 2.9 |
| 28/12/2016 | 2.7 |
| 28/12/2016 | 2.5 |
| 28/12/2016 | 2.3 |
| 28/12/2016 | 2.1 |
| 29/12/2016 | 2.1 |
| 29/12/2016 | 1.9 |
| 29/12/2016 | 1.8 |
| 29/12/2016 | 1.9 |
| 29/12/2016 | 2 |
| 29/12/2016 | 2.1 |
| 29/12/2016 | 2.2 |
| 29/12/2016 | 2.4 |
| 29/12/2016 | 2.5 |
| 29/12/2016 | 2.7 |
| 29/12/2016 | 2.7 |
| 29/12/2016 | 2.8 |
| 29/12/2016 | 2.8 |
| 29/12/2016 | 2.7 |
| 29/12/2016 | 2.7 |
| 29/12/2016 | 2.9 |
| 29/12/2016 | 3.1 |
| 29/12/2016 | 3 |
| 29/12/2016 | 3 |
| 29/12/2016 | 2.9 |
| 29/12/2016 | 2.5 |
| 29/12/2016 | 2.5 |
| 29/12/2016 | 2.3 |
| 29/12/2016 | 2.1 |
| 30/12/2016 | 2.1 |
| 30/12/2016 | 1.9 |
| 30/12/2016 | 1.8 |
| 30/12/2016 | 1.9 |
| 30/12/2016 | 2 |
| 30/12/2016 | 2.1 |
| 30/12/2016 | 2.2 |
| 30/12/2016 | 2.4 |
| 30/12/2016 | 2.5 |
| 30/12/2016 | 2.6 |
| 30/12/2016 | 2.7 |
| 30/12/2016 | 2.8 |
| 30/12/2016 | 2.8 |
| 30/12/2016 | 2.7 |
| 30/12/2016 | 2.7 |
| 30/12/2016 | 2.9 |
| 30/12/2016 | 3.1 |
| 30/12/2016 | 3 |
| 30/12/2016 | 3 |
| 30/12/2016 | 2.9 |
| 30/12/2016 | 2.5 |
| 30/12/2016 | 2.5 |
| 30/12/2016 | 2.3 |
| 30/12/2016 | 2.4 |
| 31/12/2016 | 2.2 |
| 31/12/2016 | 2.1 |
| 31/12/2016 | 1.9 |
| 31/12/2016 | 2.1 |
| 31/12/2016 | 2.1 |
| 31/12/2016 | 2.1 |
| 31/12/2016 | 2.3 |
| 31/12/2016 | 2.7 |
| 31/12/2016 | 2.9 |
| 31/12/2016 | 3 |
| 31/12/2016 | 3.2 |
| 31/12/2016 | 3.2 |
| 31/12/2016 | 3.3 |
| 31/12/2016 | 3.2 |
| 31/12/2016 | 3.3 |
| 31/12/2016 | 3.2 |
| 31/12/2016 | 3 |
| 31/12/2016 | 2.9 |
| 31/12/2016 | 2.7 |
| 31/12/2016 | 2.4 |
| 31/12/2016 | 2.4 |
| 31/12/2016 | 2.2 |
| 31/12/2016 | 2.2 |